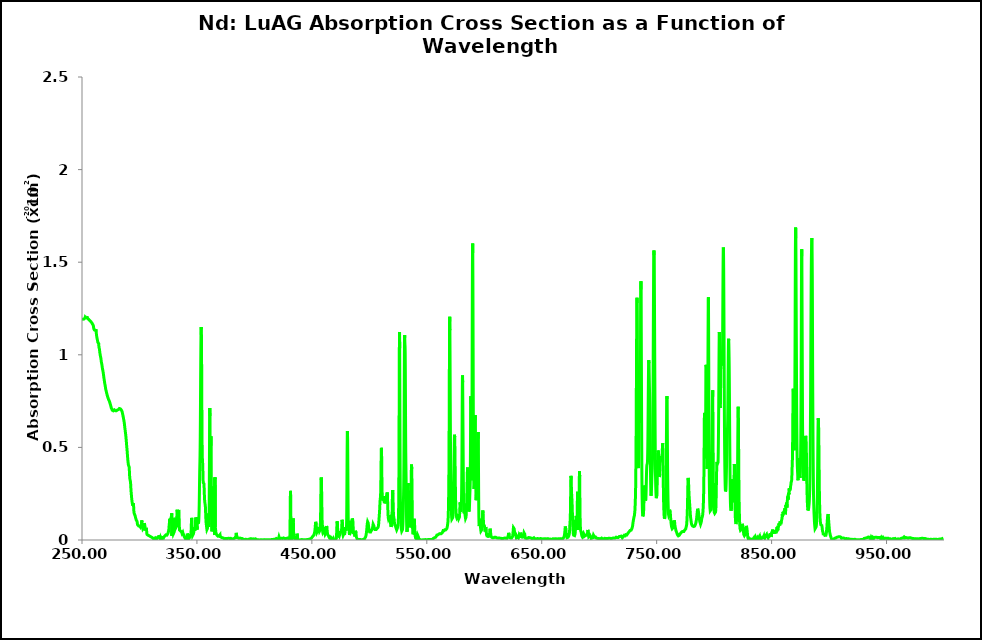
| Category | 175 K |
|---|---|
| 250.0 | 1.189 |
| 250.1 | 1.189 |
| 250.2 | 1.189 |
| 250.3 | 1.189 |
| 250.4 | 1.19 |
| 250.5 | 1.19 |
| 250.6 | 1.191 |
| 250.7 | 1.191 |
| 250.8 | 1.191 |
| 250.9 | 1.192 |
| 251.0 | 1.193 |
| 251.1 | 1.194 |
| 251.2 | 1.193 |
| 251.3 | 1.193 |
| 251.4 | 1.193 |
| 251.5 | 1.193 |
| 251.6 | 1.193 |
| 251.7 | 1.193 |
| 251.8 | 1.193 |
| 251.9 | 1.194 |
| 252.0 | 1.194 |
| 252.1 | 1.195 |
| 252.2 | 1.195 |
| 252.3 | 1.196 |
| 252.4 | 1.196 |
| 252.5 | 1.196 |
| 252.6 | 1.197 |
| 252.7 | 1.199 |
| 252.8 | 1.202 |
| 252.9 | 1.205 |
| 253.0 | 1.208 |
| 253.1 | 1.209 |
| 253.2 | 1.209 |
| 253.3 | 1.207 |
| 253.4 | 1.205 |
| 253.5 | 1.202 |
| 253.6 | 1.2 |
| 253.7 | 1.2 |
| 253.8 | 1.2 |
| 253.9 | 1.2 |
| 254.0 | 1.2 |
| 254.1 | 1.201 |
| 254.2 | 1.201 |
| 254.3 | 1.202 |
| 254.4 | 1.203 |
| 254.5 | 1.204 |
| 254.6 | 1.203 |
| 254.7 | 1.201 |
| 254.8 | 1.198 |
| 254.9 | 1.196 |
| 255.0 | 1.195 |
| 255.1 | 1.196 |
| 255.2 | 1.196 |
| 255.3 | 1.195 |
| 255.4 | 1.194 |
| 255.5 | 1.193 |
| 255.6 | 1.193 |
| 255.7 | 1.192 |
| 255.8 | 1.192 |
| 255.9 | 1.191 |
| 256.0 | 1.191 |
| 256.1 | 1.19 |
| 256.2 | 1.19 |
| 256.3 | 1.189 |
| 256.4 | 1.188 |
| 256.5 | 1.187 |
| 256.6 | 1.186 |
| 256.7 | 1.186 |
| 256.8 | 1.185 |
| 256.9 | 1.184 |
| 257.0 | 1.182 |
| 257.1 | 1.182 |
| 257.2 | 1.182 |
| 257.3 | 1.182 |
| 257.4 | 1.182 |
| 257.5 | 1.181 |
| 257.6 | 1.179 |
| 257.7 | 1.178 |
| 257.8 | 1.178 |
| 257.9 | 1.177 |
| 258.0 | 1.177 |
| 258.1 | 1.176 |
| 258.2 | 1.176 |
| 258.3 | 1.175 |
| 258.4 | 1.175 |
| 258.5 | 1.173 |
| 258.6 | 1.172 |
| 258.7 | 1.171 |
| 258.8 | 1.17 |
| 258.9 | 1.168 |
| 259.0 | 1.168 |
| 259.1 | 1.166 |
| 259.2 | 1.165 |
| 259.3 | 1.164 |
| 259.4 | 1.163 |
| 259.5 | 1.162 |
| 259.6 | 1.161 |
| 259.7 | 1.161 |
| 259.8 | 1.159 |
| 259.9 | 1.158 |
| 260.0 | 1.153 |
| 260.1 | 1.147 |
| 260.2 | 1.142 |
| 260.3 | 1.14 |
| 260.4 | 1.139 |
| 260.5 | 1.139 |
| 260.6 | 1.138 |
| 260.7 | 1.136 |
| 260.8 | 1.134 |
| 260.9 | 1.133 |
| 261.0 | 1.131 |
| 261.1 | 1.131 |
| 261.2 | 1.13 |
| 261.3 | 1.13 |
| 261.4 | 1.129 |
| 261.5 | 1.129 |
| 261.6 | 1.13 |
| 261.7 | 1.133 |
| 261.8 | 1.135 |
| 261.9 | 1.137 |
| 262.0 | 1.138 |
| 262.1 | 1.137 |
| 262.2 | 1.134 |
| 262.3 | 1.128 |
| 262.4 | 1.121 |
| 262.5 | 1.114 |
| 262.6 | 1.108 |
| 262.7 | 1.104 |
| 262.8 | 1.1 |
| 262.9 | 1.096 |
| 263.0 | 1.092 |
| 263.1 | 1.089 |
| 263.2 | 1.086 |
| 263.3 | 1.084 |
| 263.4 | 1.08 |
| 263.5 | 1.077 |
| 263.6 | 1.073 |
| 263.7 | 1.07 |
| 263.8 | 1.067 |
| 263.9 | 1.066 |
| 264.0 | 1.068 |
| 264.1 | 1.071 |
| 264.2 | 1.072 |
| 264.3 | 1.071 |
| 264.4 | 1.066 |
| 264.5 | 1.061 |
| 264.6 | 1.053 |
| 264.7 | 1.046 |
| 264.8 | 1.04 |
| 264.9 | 1.037 |
| 265.0 | 1.035 |
| 265.1 | 1.033 |
| 265.2 | 1.03 |
| 265.3 | 1.025 |
| 265.4 | 1.018 |
| 265.5 | 1.012 |
| 265.6 | 1.009 |
| 265.7 | 1.004 |
| 265.8 | 1.001 |
| 265.9 | 0.997 |
| 266.0 | 0.995 |
| 266.1 | 0.992 |
| 266.2 | 0.988 |
| 266.3 | 0.984 |
| 266.4 | 0.981 |
| 266.5 | 0.978 |
| 266.6 | 0.973 |
| 266.7 | 0.968 |
| 266.8 | 0.963 |
| 266.9 | 0.959 |
| 267.0 | 0.957 |
| 267.1 | 0.954 |
| 267.2 | 0.951 |
| 267.3 | 0.946 |
| 267.4 | 0.942 |
| 267.5 | 0.937 |
| 267.6 | 0.934 |
| 267.7 | 0.929 |
| 267.8 | 0.926 |
| 267.9 | 0.922 |
| 268.0 | 0.92 |
| 268.1 | 0.917 |
| 268.2 | 0.914 |
| 268.3 | 0.91 |
| 268.4 | 0.906 |
| 268.5 | 0.902 |
| 268.6 | 0.898 |
| 268.7 | 0.893 |
| 268.8 | 0.888 |
| 268.9 | 0.883 |
| 269.0 | 0.879 |
| 269.1 | 0.875 |
| 269.2 | 0.87 |
| 269.3 | 0.866 |
| 269.4 | 0.861 |
| 269.5 | 0.857 |
| 269.6 | 0.854 |
| 269.7 | 0.85 |
| 269.8 | 0.846 |
| 269.9 | 0.842 |
| 270.0 | 0.839 |
| 270.1 | 0.835 |
| 270.2 | 0.832 |
| 270.3 | 0.828 |
| 270.4 | 0.825 |
| 270.5 | 0.82 |
| 270.6 | 0.816 |
| 270.7 | 0.813 |
| 270.8 | 0.809 |
| 270.9 | 0.808 |
| 271.0 | 0.806 |
| 271.1 | 0.803 |
| 271.2 | 0.799 |
| 271.3 | 0.797 |
| 271.4 | 0.794 |
| 271.5 | 0.793 |
| 271.6 | 0.79 |
| 271.7 | 0.787 |
| 271.8 | 0.784 |
| 271.9 | 0.783 |
| 272.0 | 0.781 |
| 272.1 | 0.778 |
| 272.2 | 0.776 |
| 272.3 | 0.774 |
| 272.4 | 0.771 |
| 272.5 | 0.769 |
| 272.6 | 0.767 |
| 272.7 | 0.766 |
| 272.8 | 0.765 |
| 272.9 | 0.763 |
| 273.0 | 0.761 |
| 273.1 | 0.758 |
| 273.2 | 0.758 |
| 273.3 | 0.756 |
| 273.4 | 0.757 |
| 273.5 | 0.754 |
| 273.6 | 0.753 |
| 273.7 | 0.751 |
| 273.8 | 0.75 |
| 273.9 | 0.749 |
| 274.0 | 0.746 |
| 274.1 | 0.745 |
| 274.2 | 0.742 |
| 274.3 | 0.74 |
| 274.4 | 0.737 |
| 274.5 | 0.735 |
| 274.6 | 0.733 |
| 274.7 | 0.731 |
| 274.8 | 0.728 |
| 274.9 | 0.727 |
| 275.0 | 0.726 |
| 275.1 | 0.724 |
| 275.2 | 0.72 |
| 275.3 | 0.717 |
| 275.4 | 0.714 |
| 275.5 | 0.711 |
| 275.6 | 0.709 |
| 275.7 | 0.709 |
| 275.8 | 0.71 |
| 275.9 | 0.709 |
| 276.0 | 0.707 |
| 276.1 | 0.704 |
| 276.2 | 0.703 |
| 276.3 | 0.701 |
| 276.4 | 0.699 |
| 276.5 | 0.698 |
| 276.6 | 0.698 |
| 276.7 | 0.698 |
| 276.8 | 0.699 |
| 276.9 | 0.698 |
| 277.0 | 0.698 |
| 277.1 | 0.697 |
| 277.2 | 0.698 |
| 277.3 | 0.698 |
| 277.4 | 0.698 |
| 277.5 | 0.697 |
| 277.6 | 0.696 |
| 277.7 | 0.697 |
| 277.8 | 0.698 |
| 277.9 | 0.699 |
| 278.0 | 0.701 |
| 278.1 | 0.703 |
| 278.2 | 0.703 |
| 278.3 | 0.702 |
| 278.4 | 0.7 |
| 278.5 | 0.7 |
| 278.6 | 0.701 |
| 278.7 | 0.701 |
| 278.8 | 0.7 |
| 278.9 | 0.698 |
| 279.0 | 0.698 |
| 279.1 | 0.698 |
| 279.2 | 0.697 |
| 279.3 | 0.696 |
| 279.4 | 0.697 |
| 279.5 | 0.698 |
| 279.6 | 0.698 |
| 279.7 | 0.698 |
| 279.8 | 0.698 |
| 279.9 | 0.698 |
| 280.0 | 0.7 |
| 280.1 | 0.7 |
| 280.2 | 0.7 |
| 280.3 | 0.7 |
| 280.4 | 0.7 |
| 280.5 | 0.701 |
| 280.6 | 0.701 |
| 280.7 | 0.701 |
| 280.8 | 0.702 |
| 280.9 | 0.702 |
| 281.0 | 0.702 |
| 281.1 | 0.703 |
| 281.2 | 0.704 |
| 281.3 | 0.706 |
| 281.4 | 0.706 |
| 281.5 | 0.705 |
| 281.6 | 0.704 |
| 281.7 | 0.704 |
| 281.8 | 0.704 |
| 281.9 | 0.705 |
| 282.0 | 0.706 |
| 282.1 | 0.707 |
| 282.2 | 0.708 |
| 282.3 | 0.708 |
| 282.4 | 0.709 |
| 282.5 | 0.71 |
| 282.6 | 0.711 |
| 282.7 | 0.711 |
| 282.8 | 0.71 |
| 282.9 | 0.708 |
| 283.0 | 0.708 |
| 283.1 | 0.708 |
| 283.2 | 0.71 |
| 283.3 | 0.709 |
| 283.4 | 0.708 |
| 283.5 | 0.707 |
| 283.6 | 0.706 |
| 283.7 | 0.705 |
| 283.8 | 0.704 |
| 283.9 | 0.704 |
| 284.0 | 0.703 |
| 284.1 | 0.703 |
| 284.2 | 0.701 |
| 284.3 | 0.699 |
| 284.4 | 0.698 |
| 284.5 | 0.699 |
| 284.6 | 0.698 |
| 284.7 | 0.696 |
| 284.8 | 0.695 |
| 284.9 | 0.693 |
| 285.0 | 0.691 |
| 285.1 | 0.687 |
| 285.2 | 0.683 |
| 285.3 | 0.682 |
| 285.4 | 0.68 |
| 285.5 | 0.677 |
| 285.6 | 0.673 |
| 285.7 | 0.669 |
| 285.8 | 0.667 |
| 285.9 | 0.665 |
| 286.0 | 0.661 |
| 286.1 | 0.657 |
| 286.2 | 0.653 |
| 286.3 | 0.65 |
| 286.4 | 0.648 |
| 286.5 | 0.644 |
| 286.6 | 0.639 |
| 286.7 | 0.635 |
| 286.8 | 0.632 |
| 286.9 | 0.629 |
| 287.0 | 0.621 |
| 287.1 | 0.616 |
| 287.2 | 0.61 |
| 287.3 | 0.606 |
| 287.4 | 0.6 |
| 287.5 | 0.596 |
| 287.6 | 0.59 |
| 287.7 | 0.585 |
| 287.8 | 0.58 |
| 287.9 | 0.575 |
| 288.0 | 0.57 |
| 288.1 | 0.564 |
| 288.2 | 0.558 |
| 288.3 | 0.55 |
| 288.4 | 0.544 |
| 288.5 | 0.537 |
| 288.6 | 0.531 |
| 288.7 | 0.522 |
| 288.8 | 0.514 |
| 288.9 | 0.506 |
| 289.0 | 0.5 |
| 289.1 | 0.493 |
| 289.2 | 0.487 |
| 289.3 | 0.478 |
| 289.4 | 0.471 |
| 289.5 | 0.462 |
| 289.6 | 0.453 |
| 289.7 | 0.445 |
| 289.8 | 0.438 |
| 289.9 | 0.431 |
| 290.0 | 0.425 |
| 290.1 | 0.42 |
| 290.2 | 0.414 |
| 290.3 | 0.41 |
| 290.4 | 0.405 |
| 290.5 | 0.405 |
| 290.6 | 0.405 |
| 290.7 | 0.407 |
| 290.8 | 0.411 |
| 290.9 | 0.411 |
| 291.0 | 0.405 |
| 291.1 | 0.392 |
| 291.2 | 0.378 |
| 291.3 | 0.363 |
| 291.4 | 0.351 |
| 291.5 | 0.34 |
| 291.6 | 0.333 |
| 291.7 | 0.328 |
| 291.8 | 0.325 |
| 291.9 | 0.322 |
| 292.0 | 0.319 |
| 292.1 | 0.317 |
| 292.2 | 0.312 |
| 292.3 | 0.305 |
| 292.4 | 0.293 |
| 292.5 | 0.282 |
| 292.6 | 0.271 |
| 292.7 | 0.263 |
| 292.8 | 0.255 |
| 292.9 | 0.25 |
| 293.0 | 0.241 |
| 293.1 | 0.234 |
| 293.2 | 0.227 |
| 293.3 | 0.222 |
| 293.4 | 0.215 |
| 293.5 | 0.209 |
| 293.6 | 0.205 |
| 293.7 | 0.201 |
| 293.8 | 0.198 |
| 293.9 | 0.194 |
| 294.0 | 0.193 |
| 294.1 | 0.19 |
| 294.2 | 0.185 |
| 294.3 | 0.183 |
| 294.4 | 0.184 |
| 294.5 | 0.191 |
| 294.6 | 0.196 |
| 294.7 | 0.198 |
| 294.8 | 0.193 |
| 294.9 | 0.183 |
| 295.0 | 0.169 |
| 295.1 | 0.159 |
| 295.2 | 0.15 |
| 295.3 | 0.148 |
| 295.4 | 0.144 |
| 295.5 | 0.145 |
| 295.6 | 0.141 |
| 295.7 | 0.14 |
| 295.8 | 0.137 |
| 295.9 | 0.137 |
| 296.0 | 0.136 |
| 296.1 | 0.134 |
| 296.2 | 0.133 |
| 296.3 | 0.13 |
| 296.4 | 0.126 |
| 296.5 | 0.123 |
| 296.6 | 0.122 |
| 296.7 | 0.12 |
| 296.8 | 0.118 |
| 296.9 | 0.114 |
| 297.0 | 0.112 |
| 297.1 | 0.111 |
| 297.2 | 0.108 |
| 297.3 | 0.107 |
| 297.4 | 0.105 |
| 297.5 | 0.106 |
| 297.6 | 0.106 |
| 297.7 | 0.105 |
| 297.8 | 0.103 |
| 297.9 | 0.101 |
| 298.0 | 0.096 |
| 298.1 | 0.091 |
| 298.2 | 0.086 |
| 298.3 | 0.083 |
| 298.4 | 0.083 |
| 298.5 | 0.081 |
| 298.6 | 0.081 |
| 298.7 | 0.08 |
| 298.8 | 0.08 |
| 298.9 | 0.079 |
| 299.0 | 0.078 |
| 299.1 | 0.078 |
| 299.2 | 0.076 |
| 299.3 | 0.074 |
| 299.4 | 0.072 |
| 299.5 | 0.071 |
| 299.6 | 0.072 |
| 299.7 | 0.073 |
| 299.8 | 0.073 |
| 299.9 | 0.073 |
| 300.0 | 0.074 |
| 300.1 | 0.075 |
| 300.2 | 0.076 |
| 300.3 | 0.077 |
| 300.4 | 0.076 |
| 300.5 | 0.073 |
| 300.6 | 0.071 |
| 300.7 | 0.07 |
| 300.8 | 0.07 |
| 300.9 | 0.068 |
| 301.0 | 0.067 |
| 301.1 | 0.068 |
| 301.2 | 0.071 |
| 301.3 | 0.074 |
| 301.4 | 0.074 |
| 301.5 | 0.076 |
| 301.6 | 0.081 |
| 301.7 | 0.087 |
| 301.8 | 0.095 |
| 301.9 | 0.1 |
| 302.0 | 0.106 |
| 302.1 | 0.103 |
| 302.2 | 0.096 |
| 302.3 | 0.086 |
| 302.4 | 0.08 |
| 302.5 | 0.076 |
| 302.6 | 0.073 |
| 302.7 | 0.069 |
| 302.8 | 0.065 |
| 302.9 | 0.062 |
| 303.0 | 0.059 |
| 303.1 | 0.059 |
| 303.2 | 0.059 |
| 303.3 | 0.062 |
| 303.4 | 0.061 |
| 303.5 | 0.061 |
| 303.6 | 0.061 |
| 303.7 | 0.061 |
| 303.8 | 0.065 |
| 303.9 | 0.07 |
| 304.0 | 0.078 |
| 304.1 | 0.085 |
| 304.2 | 0.09 |
| 304.3 | 0.091 |
| 304.4 | 0.09 |
| 304.5 | 0.085 |
| 304.6 | 0.081 |
| 304.7 | 0.077 |
| 304.8 | 0.073 |
| 304.9 | 0.067 |
| 305.0 | 0.06 |
| 305.1 | 0.056 |
| 305.2 | 0.051 |
| 305.3 | 0.048 |
| 305.4 | 0.047 |
| 305.5 | 0.051 |
| 305.6 | 0.055 |
| 305.7 | 0.06 |
| 305.8 | 0.063 |
| 305.9 | 0.066 |
| 306.0 | 0.063 |
| 306.1 | 0.059 |
| 306.2 | 0.051 |
| 306.3 | 0.043 |
| 306.4 | 0.036 |
| 306.5 | 0.032 |
| 306.6 | 0.03 |
| 306.7 | 0.03 |
| 306.8 | 0.029 |
| 306.9 | 0.028 |
| 307.0 | 0.027 |
| 307.1 | 0.028 |
| 307.2 | 0.03 |
| 307.3 | 0.03 |
| 307.4 | 0.029 |
| 307.5 | 0.026 |
| 307.6 | 0.021 |
| 307.7 | 0.022 |
| 307.8 | 0.023 |
| 307.9 | 0.025 |
| 308.0 | 0.023 |
| 308.1 | 0.022 |
| 308.2 | 0.023 |
| 308.3 | 0.023 |
| 308.4 | 0.023 |
| 308.5 | 0.024 |
| 308.6 | 0.023 |
| 308.7 | 0.021 |
| 308.8 | 0.022 |
| 308.9 | 0.022 |
| 309.0 | 0.023 |
| 309.1 | 0.021 |
| 309.2 | 0.021 |
| 309.3 | 0.02 |
| 309.4 | 0.017 |
| 309.5 | 0.018 |
| 309.6 | 0.02 |
| 309.7 | 0.019 |
| 309.8 | 0.019 |
| 309.9 | 0.018 |
| 310.0 | 0.02 |
| 310.1 | 0.019 |
| 310.2 | 0.016 |
| 310.3 | 0.014 |
| 310.4 | 0.012 |
| 310.5 | 0.015 |
| 310.6 | 0.017 |
| 310.7 | 0.018 |
| 310.8 | 0.016 |
| 310.9 | 0.014 |
| 311.0 | 0.013 |
| 311.1 | 0.013 |
| 311.2 | 0.012 |
| 311.3 | 0.015 |
| 311.4 | 0.015 |
| 311.5 | 0.018 |
| 311.6 | 0.013 |
| 311.7 | 0.012 |
| 311.8 | 0.009 |
| 311.9 | 0.009 |
| 312.0 | 0.008 |
| 312.1 | 0.008 |
| 312.2 | 0.009 |
| 312.3 | 0.007 |
| 312.4 | 0.007 |
| 312.5 | 0.007 |
| 312.6 | 0.007 |
| 312.7 | 0.007 |
| 312.8 | 0.008 |
| 312.9 | 0.01 |
| 313.0 | 0.009 |
| 313.1 | 0.01 |
| 313.2 | 0.009 |
| 313.3 | 0.01 |
| 313.4 | 0.009 |
| 313.5 | 0.009 |
| 313.6 | 0.007 |
| 313.7 | 0.005 |
| 313.8 | 0.006 |
| 313.9 | 0.008 |
| 314.0 | 0.008 |
| 314.1 | 0.007 |
| 314.2 | 0.007 |
| 314.3 | 0.011 |
| 314.4 | 0.01 |
| 314.5 | 0.009 |
| 314.6 | 0.007 |
| 314.7 | 0.009 |
| 314.8 | 0.01 |
| 314.9 | 0.009 |
| 315.0 | 0.008 |
| 315.1 | 0.007 |
| 315.2 | 0.008 |
| 315.3 | 0.009 |
| 315.4 | 0.01 |
| 315.5 | 0.011 |
| 315.6 | 0.01 |
| 315.7 | 0.011 |
| 315.8 | 0.014 |
| 315.9 | 0.017 |
| 316.0 | 0.016 |
| 316.1 | 0.014 |
| 316.2 | 0.012 |
| 316.3 | 0.013 |
| 316.4 | 0.009 |
| 316.5 | 0.01 |
| 316.6 | 0.012 |
| 316.7 | 0.015 |
| 316.8 | 0.017 |
| 316.9 | 0.02 |
| 317.0 | 0.026 |
| 317.1 | 0.026 |
| 317.2 | 0.024 |
| 317.3 | 0.02 |
| 317.4 | 0.017 |
| 317.5 | 0.013 |
| 317.6 | 0.013 |
| 317.7 | 0.014 |
| 317.8 | 0.013 |
| 317.9 | 0.01 |
| 318.0 | 0.006 |
| 318.1 | 0.009 |
| 318.2 | 0.012 |
| 318.3 | 0.013 |
| 318.4 | 0.012 |
| 318.5 | 0.009 |
| 318.6 | 0.009 |
| 318.7 | 0.005 |
| 318.8 | 0.003 |
| 318.9 | 0.001 |
| 319.0 | 0.001 |
| 319.1 | 0.003 |
| 319.2 | 0.006 |
| 319.3 | 0.008 |
| 319.4 | 0.008 |
| 319.5 | 0.007 |
| 319.6 | 0.006 |
| 319.7 | 0.006 |
| 319.8 | 0.007 |
| 319.9 | 0.01 |
| 320.0 | 0.013 |
| 320.1 | 0.014 |
| 320.2 | 0.013 |
| 320.3 | 0.012 |
| 320.4 | 0.012 |
| 320.5 | 0.009 |
| 320.6 | 0.01 |
| 320.7 | 0.01 |
| 320.8 | 0.013 |
| 320.9 | 0.01 |
| 321.0 | 0.01 |
| 321.1 | 0.012 |
| 321.2 | 0.013 |
| 321.3 | 0.016 |
| 321.4 | 0.016 |
| 321.5 | 0.016 |
| 321.6 | 0.017 |
| 321.7 | 0.018 |
| 321.8 | 0.019 |
| 321.9 | 0.018 |
| 322.0 | 0.02 |
| 322.1 | 0.022 |
| 322.2 | 0.023 |
| 322.3 | 0.023 |
| 322.4 | 0.022 |
| 322.5 | 0.023 |
| 322.6 | 0.024 |
| 322.7 | 0.026 |
| 322.8 | 0.027 |
| 322.9 | 0.028 |
| 323.0 | 0.027 |
| 323.1 | 0.025 |
| 323.2 | 0.026 |
| 323.3 | 0.025 |
| 323.4 | 0.027 |
| 323.5 | 0.026 |
| 323.6 | 0.026 |
| 323.7 | 0.027 |
| 323.8 | 0.026 |
| 323.9 | 0.027 |
| 324.0 | 0.029 |
| 324.1 | 0.031 |
| 324.2 | 0.031 |
| 324.3 | 0.031 |
| 324.4 | 0.032 |
| 324.5 | 0.031 |
| 324.6 | 0.031 |
| 324.7 | 0.034 |
| 324.8 | 0.035 |
| 324.9 | 0.038 |
| 325.0 | 0.038 |
| 325.1 | 0.043 |
| 325.2 | 0.046 |
| 325.3 | 0.049 |
| 325.4 | 0.052 |
| 325.5 | 0.054 |
| 325.6 | 0.059 |
| 325.7 | 0.067 |
| 325.8 | 0.076 |
| 325.9 | 0.082 |
| 326.0 | 0.088 |
| 326.1 | 0.095 |
| 326.2 | 0.106 |
| 326.3 | 0.115 |
| 326.4 | 0.118 |
| 326.5 | 0.117 |
| 326.6 | 0.113 |
| 326.7 | 0.113 |
| 326.8 | 0.108 |
| 326.9 | 0.107 |
| 327.0 | 0.106 |
| 327.1 | 0.11 |
| 327.2 | 0.113 |
| 327.3 | 0.116 |
| 327.4 | 0.116 |
| 327.5 | 0.119 |
| 327.6 | 0.121 |
| 327.7 | 0.126 |
| 327.8 | 0.128 |
| 327.9 | 0.133 |
| 328.0 | 0.139 |
| 328.1 | 0.144 |
| 328.2 | 0.023 |
| 328.3 | 0.03 |
| 328.4 | 0.035 |
| 328.5 | 0.038 |
| 328.6 | 0.042 |
| 328.7 | 0.048 |
| 328.8 | 0.051 |
| 328.9 | 0.051 |
| 329.0 | 0.046 |
| 329.1 | 0.044 |
| 329.2 | 0.04 |
| 329.3 | 0.036 |
| 329.4 | 0.032 |
| 329.5 | 0.03 |
| 329.6 | 0.03 |
| 329.7 | 0.028 |
| 329.8 | 0.029 |
| 329.9 | 0.032 |
| 330.0 | 0.04 |
| 330.1 | 0.05 |
| 330.2 | 0.067 |
| 330.3 | 0.084 |
| 330.4 | 0.1 |
| 330.5 | 0.11 |
| 330.6 | 0.116 |
| 330.7 | 0.12 |
| 330.8 | 0.116 |
| 330.9 | 0.11 |
| 331.0 | 0.098 |
| 331.1 | 0.088 |
| 331.2 | 0.079 |
| 331.3 | 0.073 |
| 331.4 | 0.069 |
| 331.5 | 0.065 |
| 331.6 | 0.061 |
| 331.7 | 0.061 |
| 331.8 | 0.062 |
| 331.9 | 0.064 |
| 332.0 | 0.065 |
| 332.1 | 0.067 |
| 332.2 | 0.073 |
| 332.3 | 0.083 |
| 332.4 | 0.097 |
| 332.5 | 0.118 |
| 332.6 | 0.14 |
| 332.7 | 0.158 |
| 332.8 | 0.163 |
| 332.9 | 0.162 |
| 333.0 | 0.153 |
| 333.1 | 0.142 |
| 333.2 | 0.13 |
| 333.3 | 0.123 |
| 333.4 | 0.119 |
| 333.5 | 0.118 |
| 333.6 | 0.12 |
| 333.7 | 0.127 |
| 333.8 | 0.135 |
| 333.9 | 0.145 |
| 334.0 | 0.154 |
| 334.1 | 0.162 |
| 334.2 | 0.162 |
| 334.3 | 0.154 |
| 334.4 | 0.139 |
| 334.5 | 0.118 |
| 334.6 | 0.094 |
| 334.7 | 0.074 |
| 334.8 | 0.06 |
| 334.9 | 0.053 |
| 335.0 | 0.051 |
| 335.1 | 0.053 |
| 335.2 | 0.053 |
| 335.3 | 0.053 |
| 335.4 | 0.052 |
| 335.5 | 0.053 |
| 335.6 | 0.052 |
| 335.7 | 0.05 |
| 335.8 | 0.047 |
| 335.9 | 0.045 |
| 336.0 | 0.045 |
| 336.1 | 0.045 |
| 336.2 | 0.047 |
| 336.3 | 0.05 |
| 336.4 | 0.05 |
| 336.5 | 0.048 |
| 336.6 | 0.046 |
| 336.7 | 0.043 |
| 336.8 | 0.041 |
| 336.9 | 0.038 |
| 337.0 | 0.037 |
| 337.1 | 0.033 |
| 337.2 | 0.034 |
| 337.3 | 0.036 |
| 337.4 | 0.04 |
| 337.5 | 0.042 |
| 337.6 | 0.042 |
| 337.7 | 0.04 |
| 337.8 | 0.038 |
| 337.9 | 0.035 |
| 338.0 | 0.033 |
| 338.1 | 0.03 |
| 338.2 | 0.03 |
| 338.3 | 0.03 |
| 338.4 | 0.029 |
| 338.5 | 0.028 |
| 338.6 | 0.026 |
| 338.7 | 0.022 |
| 338.8 | 0.019 |
| 338.9 | 0.019 |
| 339.0 | 0.018 |
| 339.1 | 0.016 |
| 339.2 | 0.014 |
| 339.3 | 0.015 |
| 339.4 | 0.015 |
| 339.5 | 0.015 |
| 339.6 | 0.013 |
| 339.7 | 0.013 |
| 339.8 | 0.01 |
| 339.9 | 0.008 |
| 340.0 | 0.005 |
| 340.1 | 0.005 |
| 340.2 | 0.004 |
| 340.3 | 0.006 |
| 340.4 | 0.002 |
| 340.5 | 0.004 |
| 340.6 | 0.006 |
| 340.7 | 0.002 |
| 340.8 | 0.001 |
| 340.9 | 0.002 |
| 341.0 | 0.003 |
| 341.1 | 0.004 |
| 341.2 | 0.006 |
| 341.3 | 0.012 |
| 341.4 | 0.02 |
| 341.5 | 0.026 |
| 341.6 | 0.03 |
| 341.7 | 0.035 |
| 341.8 | 0.038 |
| 341.9 | 0.037 |
| 342.0 | 0.035 |
| 342.1 | 0.029 |
| 342.2 | 0.026 |
| 342.3 | 0.02 |
| 342.4 | 0.02 |
| 342.5 | 0.017 |
| 342.6 | 0.014 |
| 342.7 | 0.01 |
| 342.8 | 0.009 |
| 342.9 | 0.01 |
| 343.0 | 0.008 |
| 343.1 | 0.008 |
| 343.2 | 0.006 |
| 343.3 | 0.008 |
| 343.4 | 0.007 |
| 343.5 | 0.011 |
| 343.6 | 0.01 |
| 343.7 | 0.014 |
| 343.8 | 0.014 |
| 343.9 | 0.017 |
| 344.0 | 0.015 |
| 344.1 | 0.019 |
| 344.2 | 0.02 |
| 344.3 | 0.022 |
| 344.4 | 0.023 |
| 344.5 | 0.026 |
| 344.6 | 0.027 |
| 344.7 | 0.029 |
| 344.8 | 0.034 |
| 344.9 | 0.044 |
| 345.0 | 0.059 |
| 345.1 | 0.076 |
| 345.2 | 0.095 |
| 345.3 | 0.11 |
| 345.4 | 0.119 |
| 345.5 | 0.117 |
| 345.6 | 0.106 |
| 345.7 | 0.091 |
| 345.8 | 0.072 |
| 345.9 | 0.056 |
| 346.0 | 0.039 |
| 346.1 | 0.03 |
| 346.2 | 0.024 |
| 346.3 | 0.023 |
| 346.4 | 0.022 |
| 346.5 | 0.02 |
| 346.6 | 0.021 |
| 346.7 | 0.022 |
| 346.8 | 0.023 |
| 346.9 | 0.024 |
| 347.0 | 0.029 |
| 347.1 | 0.035 |
| 347.2 | 0.043 |
| 347.3 | 0.052 |
| 347.4 | 0.062 |
| 347.5 | 0.069 |
| 347.6 | 0.073 |
| 347.7 | 0.071 |
| 347.8 | 0.066 |
| 347.9 | 0.057 |
| 348.0 | 0.05 |
| 348.1 | 0.046 |
| 348.2 | 0.047 |
| 348.3 | 0.049 |
| 348.4 | 0.052 |
| 348.5 | 0.059 |
| 348.6 | 0.071 |
| 348.7 | 0.087 |
| 348.8 | 0.101 |
| 348.9 | 0.113 |
| 349.0 | 0.118 |
| 349.1 | 0.121 |
| 349.2 | 0.118 |
| 349.3 | 0.11 |
| 349.4 | 0.095 |
| 349.5 | 0.083 |
| 349.6 | 0.072 |
| 349.7 | 0.068 |
| 349.8 | 0.065 |
| 349.9 | 0.068 |
| 350.0 | 0.073 |
| 350.1 | 0.057 |
| 350.2 | 0.064 |
| 350.3 | 0.073 |
| 350.4 | 0.088 |
| 350.5 | 0.103 |
| 350.6 | 0.118 |
| 350.7 | 0.124 |
| 350.8 | 0.123 |
| 350.9 | 0.116 |
| 351.0 | 0.107 |
| 351.1 | 0.097 |
| 351.2 | 0.09 |
| 351.3 | 0.087 |
| 351.4 | 0.089 |
| 351.5 | 0.095 |
| 351.6 | 0.106 |
| 351.7 | 0.121 |
| 351.8 | 0.138 |
| 351.9 | 0.161 |
| 352.0 | 0.191 |
| 352.1 | 0.231 |
| 352.2 | 0.277 |
| 352.3 | 0.324 |
| 352.4 | 0.365 |
| 352.5 | 0.396 |
| 352.6 | 0.424 |
| 352.7 | 0.454 |
| 352.8 | 0.502 |
| 352.9 | 0.562 |
| 353.0 | 0.646 |
| 353.1 | 0.745 |
| 353.2 | 0.849 |
| 353.3 | 0.945 |
| 353.4 | 1.026 |
| 353.5 | 1.091 |
| 353.6 | 1.134 |
| 353.7 | 1.15 |
| 353.8 | 1.137 |
| 353.9 | 1.096 |
| 354.0 | 1.028 |
| 354.1 | 0.933 |
| 354.2 | 0.821 |
| 354.3 | 0.702 |
| 354.4 | 0.601 |
| 354.5 | 0.523 |
| 354.6 | 0.474 |
| 354.7 | 0.446 |
| 354.8 | 0.431 |
| 354.9 | 0.422 |
| 355.0 | 0.41 |
| 355.1 | 0.392 |
| 355.2 | 0.365 |
| 355.3 | 0.338 |
| 355.4 | 0.319 |
| 355.5 | 0.309 |
| 355.6 | 0.307 |
| 355.7 | 0.308 |
| 355.8 | 0.308 |
| 355.9 | 0.31 |
| 356.0 | 0.309 |
| 356.1 | 0.304 |
| 356.2 | 0.292 |
| 356.3 | 0.276 |
| 356.4 | 0.257 |
| 356.5 | 0.24 |
| 356.6 | 0.225 |
| 356.7 | 0.215 |
| 356.8 | 0.206 |
| 356.9 | 0.201 |
| 357.0 | 0.198 |
| 357.1 | 0.197 |
| 357.2 | 0.193 |
| 357.3 | 0.186 |
| 357.4 | 0.174 |
| 357.5 | 0.159 |
| 357.6 | 0.141 |
| 357.7 | 0.126 |
| 357.8 | 0.112 |
| 357.9 | 0.103 |
| 358.0 | 0.093 |
| 358.1 | 0.088 |
| 358.2 | 0.083 |
| 358.3 | 0.078 |
| 358.4 | 0.072 |
| 358.5 | 0.065 |
| 358.6 | 0.061 |
| 358.7 | 0.056 |
| 358.8 | 0.052 |
| 358.9 | 0.051 |
| 359.0 | 0.055 |
| 359.1 | 0.062 |
| 359.2 | 0.076 |
| 359.3 | 0.093 |
| 359.4 | 0.113 |
| 359.5 | 0.132 |
| 359.6 | 0.143 |
| 359.7 | 0.143 |
| 359.8 | 0.127 |
| 359.9 | 0.106 |
| 360.0 | 0.089 |
| 360.1 | 0.076 |
| 360.2 | 0.07 |
| 360.3 | 0.067 |
| 360.4 | 0.075 |
| 360.5 | 0.094 |
| 360.6 | 0.137 |
| 360.7 | 0.209 |
| 360.8 | 0.313 |
| 360.9 | 0.44 |
| 361.0 | 0.572 |
| 361.1 | 0.675 |
| 361.2 | 0.713 |
| 361.3 | 0.669 |
| 361.4 | 0.559 |
| 361.5 | 0.42 |
| 361.6 | 0.301 |
| 361.7 | 0.246 |
| 361.8 | 0.265 |
| 361.9 | 0.345 |
| 362.0 | 0.45 |
| 362.1 | 0.537 |
| 362.2 | 0.56 |
| 362.3 | 0.509 |
| 362.4 | 0.402 |
| 362.5 | 0.285 |
| 362.6 | 0.184 |
| 362.7 | 0.122 |
| 362.8 | 0.083 |
| 362.9 | 0.059 |
| 363.0 | 0.046 |
| 363.1 | 0.052 |
| 363.2 | 0.082 |
| 363.3 | 0.132 |
| 363.4 | 0.196 |
| 363.5 | 0.255 |
| 363.6 | 0.289 |
| 363.7 | 0.287 |
| 363.8 | 0.251 |
| 363.9 | 0.196 |
| 364.0 | 0.139 |
| 364.1 | 0.105 |
| 364.2 | 0.106 |
| 364.3 | 0.139 |
| 364.4 | 0.192 |
| 364.5 | 0.239 |
| 364.6 | 0.268 |
| 364.7 | 0.263 |
| 364.8 | 0.23 |
| 364.9 | 0.175 |
| 365.0 | 0.119 |
| 365.1 | 0.074 |
| 365.2 | 0.045 |
| 365.3 | 0.027 |
| 365.4 | 0.335 |
| 365.5 | 0.33 |
| 365.6 | 0.329 |
| 365.7 | 0.333 |
| 365.8 | 0.338 |
| 365.9 | 0.34 |
| 366.0 | 0.07 |
| 366.1 | 0.063 |
| 366.2 | 0.058 |
| 366.3 | 0.053 |
| 366.4 | 0.046 |
| 366.5 | 0.042 |
| 366.6 | 0.039 |
| 366.7 | 0.038 |
| 366.8 | 0.035 |
| 366.9 | 0.033 |
| 367.0 | 0.032 |
| 367.1 | 0.03 |
| 367.2 | 0.03 |
| 367.3 | 0.027 |
| 367.4 | 0.025 |
| 367.5 | 0.022 |
| 367.6 | 0.023 |
| 367.7 | 0.023 |
| 367.8 | 0.023 |
| 367.9 | 0.022 |
| 368.0 | 0.022 |
| 368.1 | 0.021 |
| 368.2 | 0.021 |
| 368.3 | 0.023 |
| 368.4 | 0.022 |
| 368.5 | 0.024 |
| 368.6 | 0.021 |
| 368.7 | 0.023 |
| 368.8 | 0.022 |
| 368.9 | 0.023 |
| 369.0 | 0.023 |
| 369.1 | 0.021 |
| 369.2 | 0.02 |
| 369.3 | 0.02 |
| 369.4 | 0.021 |
| 369.5 | 0.022 |
| 369.6 | 0.02 |
| 369.7 | 0.018 |
| 369.8 | 0.018 |
| 369.9 | 0.018 |
| 370.0 | 0.028 |
| 370.1 | 0.012 |
| 370.2 | 0.014 |
| 370.3 | 0.017 |
| 370.4 | 0.019 |
| 370.5 | 0.02 |
| 370.6 | 0.019 |
| 370.7 | 0.018 |
| 370.8 | 0.017 |
| 370.9 | 0.017 |
| 371.0 | 0.016 |
| 371.1 | 0.014 |
| 371.2 | 0.014 |
| 371.3 | 0.014 |
| 371.4 | 0.016 |
| 371.5 | 0.015 |
| 371.6 | 0.017 |
| 371.7 | 0.017 |
| 371.8 | 0.017 |
| 371.9 | 0.016 |
| 372.0 | 0.014 |
| 372.1 | 0.013 |
| 372.2 | 0.012 |
| 372.3 | 0.011 |
| 372.4 | 0.012 |
| 372.5 | 0.011 |
| 372.6 | 0.012 |
| 372.7 | 0.011 |
| 372.8 | 0.008 |
| 372.9 | 0.008 |
| 373.0 | 0.008 |
| 373.1 | 0.01 |
| 373.2 | 0.01 |
| 373.3 | 0.008 |
| 373.4 | 0.006 |
| 373.5 | 0.006 |
| 373.6 | 0.006 |
| 373.7 | 0.007 |
| 373.8 | 0.007 |
| 373.9 | 0.008 |
| 374.0 | 0.006 |
| 374.1 | 0.006 |
| 374.2 | 0.006 |
| 374.3 | 0.006 |
| 374.4 | 0.007 |
| 374.5 | 0.007 |
| 374.6 | 0.008 |
| 374.7 | 0.007 |
| 374.8 | 0.008 |
| 374.9 | 0.008 |
| 375.0 | 0.009 |
| 375.1 | 0.006 |
| 375.2 | 0.006 |
| 375.3 | 0.005 |
| 375.4 | 0.007 |
| 375.5 | 0.008 |
| 375.6 | 0.009 |
| 375.7 | 0.009 |
| 375.8 | 0.007 |
| 375.9 | 0.007 |
| 376.0 | 0.008 |
| 376.1 | 0.009 |
| 376.2 | 0.01 |
| 376.3 | 0.01 |
| 376.4 | 0.01 |
| 376.5 | 0.01 |
| 376.6 | 0.008 |
| 376.7 | 0.008 |
| 376.8 | 0.009 |
| 376.9 | 0.011 |
| 377.0 | 0.01 |
| 377.1 | 0.009 |
| 377.2 | 0.01 |
| 377.3 | 0.009 |
| 377.4 | 0.01 |
| 377.5 | 0.01 |
| 377.6 | 0.01 |
| 377.7 | 0.008 |
| 377.8 | 0.007 |
| 377.9 | 0.008 |
| 378.0 | 0.009 |
| 378.1 | 0.01 |
| 378.2 | 0.01 |
| 378.3 | 0.01 |
| 378.4 | 0.01 |
| 378.5 | 0.008 |
| 378.6 | 0.008 |
| 378.7 | 0.007 |
| 378.8 | 0.009 |
| 378.9 | 0.009 |
| 379.0 | 0.008 |
| 379.1 | 0.008 |
| 379.2 | 0.007 |
| 379.3 | 0.01 |
| 379.4 | 0.009 |
| 379.5 | 0.01 |
| 379.6 | 0.009 |
| 379.7 | 0.009 |
| 379.8 | 0.008 |
| 379.9 | 0.007 |
| 380.0 | 0.006 |
| 380.1 | 0.007 |
| 380.2 | 0.006 |
| 380.3 | 0.006 |
| 380.4 | 0.004 |
| 380.5 | 0.006 |
| 380.6 | 0.005 |
| 380.7 | 0.005 |
| 380.8 | 0.004 |
| 380.9 | 0.004 |
| 381.0 | 0.005 |
| 381.1 | 0.005 |
| 381.2 | 0.006 |
| 381.3 | 0.006 |
| 381.4 | 0.009 |
| 381.5 | 0.009 |
| 381.6 | 0.009 |
| 381.7 | 0.011 |
| 381.8 | 0.01 |
| 381.9 | 0.01 |
| 382.0 | 0.007 |
| 382.1 | 0.008 |
| 382.2 | 0.008 |
| 382.3 | 0.009 |
| 382.4 | 0.007 |
| 382.5 | 0.007 |
| 382.6 | 0.008 |
| 382.7 | 0.009 |
| 382.8 | 0.009 |
| 382.9 | 0.01 |
| 383.0 | 0.011 |
| 383.1 | 0.01 |
| 383.2 | 0.009 |
| 383.3 | 0.009 |
| 383.4 | 0.01 |
| 383.5 | 0.011 |
| 383.6 | 0.01 |
| 383.7 | 0.012 |
| 383.8 | 0.013 |
| 383.9 | 0.02 |
| 384.0 | 0.026 |
| 384.1 | 0.033 |
| 384.2 | 0.038 |
| 384.3 | 0.04 |
| 384.4 | 0.036 |
| 384.5 | 0.03 |
| 384.6 | 0.022 |
| 384.7 | 0.018 |
| 384.8 | 0.013 |
| 384.9 | 0.012 |
| 385.0 | 0.011 |
| 385.1 | 0.011 |
| 385.2 | 0.012 |
| 385.3 | 0.014 |
| 385.4 | 0.016 |
| 385.5 | 0.016 |
| 385.6 | 0.012 |
| 385.7 | 0.012 |
| 385.8 | 0.011 |
| 385.9 | 0.012 |
| 386.0 | 0.012 |
| 386.1 | 0.013 |
| 386.2 | 0.015 |
| 386.3 | 0.014 |
| 386.4 | 0.012 |
| 386.5 | 0.01 |
| 386.6 | 0.009 |
| 386.7 | 0.008 |
| 386.8 | 0.009 |
| 386.9 | 0.011 |
| 387.0 | 0.011 |
| 387.1 | 0.011 |
| 387.2 | 0.011 |
| 387.3 | 0.012 |
| 387.4 | 0.011 |
| 387.5 | 0.01 |
| 387.6 | 0.009 |
| 387.7 | 0.01 |
| 387.8 | 0.009 |
| 387.9 | 0.009 |
| 388.0 | 0.008 |
| 388.1 | 0.009 |
| 388.2 | 0.008 |
| 388.3 | 0.009 |
| 388.4 | 0.009 |
| 388.5 | 0.007 |
| 388.6 | 0.008 |
| 388.7 | 0.007 |
| 388.8 | 0.007 |
| 388.9 | 0.007 |
| 389.0 | 0.007 |
| 389.1 | 0.008 |
| 389.2 | 0.007 |
| 389.3 | 0.008 |
| 389.4 | 0.006 |
| 389.5 | 0.006 |
| 389.6 | 0.005 |
| 389.7 | 0.004 |
| 389.8 | 0.005 |
| 389.9 | 0.005 |
| 390.0 | 0.006 |
| 390.1 | 0.005 |
| 390.2 | 0.005 |
| 390.3 | 0.003 |
| 390.4 | 0.004 |
| 390.5 | 0.004 |
| 390.6 | 0.004 |
| 390.7 | 0.004 |
| 390.8 | 0.005 |
| 390.9 | 0.005 |
| 391.0 | 0.004 |
| 391.1 | 0.002 |
| 391.2 | 0.002 |
| 391.3 | 0.005 |
| 391.4 | 0.006 |
| 391.5 | 0.006 |
| 391.6 | 0.004 |
| 391.7 | 0.004 |
| 391.8 | 0.003 |
| 391.9 | 0.004 |
| 392.0 | 0.004 |
| 392.1 | 0.005 |
| 392.2 | 0.003 |
| 392.3 | 0.004 |
| 392.4 | 0.004 |
| 392.5 | 0.006 |
| 392.6 | 0.006 |
| 392.7 | 0.006 |
| 392.8 | 0.004 |
| 392.9 | 0.003 |
| 393.0 | 0.001 |
| 393.1 | 0.002 |
| 393.2 | 0.002 |
| 393.3 | 0.003 |
| 393.4 | 0.003 |
| 393.5 | 0.003 |
| 393.6 | 0.002 |
| 393.7 | 0.001 |
| 393.8 | 0 |
| 393.9 | 0.002 |
| 394.0 | 0.003 |
| 394.1 | 0.003 |
| 394.2 | 0.002 |
| 394.3 | 0.004 |
| 394.4 | 0.003 |
| 394.5 | 0.004 |
| 394.6 | 0.004 |
| 394.7 | 0.004 |
| 394.8 | 0.004 |
| 394.9 | 0.002 |
| 395.0 | 0.003 |
| 395.1 | 0.002 |
| 395.2 | 0.002 |
| 395.3 | 0.002 |
| 395.4 | 0.003 |
| 395.5 | 0.004 |
| 395.6 | 0.003 |
| 395.7 | 0.003 |
| 395.8 | 0.004 |
| 395.9 | 0.006 |
| 396.0 | 0.007 |
| 396.1 | 0.006 |
| 396.2 | 0.006 |
| 396.3 | 0.006 |
| 396.4 | 0.007 |
| 396.5 | 0.007 |
| 396.6 | 0.007 |
| 396.7 | 0.006 |
| 396.8 | 0.006 |
| 396.9 | 0.005 |
| 397.0 | 0.005 |
| 397.1 | 0.005 |
| 397.2 | 0.006 |
| 397.3 | 0.006 |
| 397.4 | 0.007 |
| 397.5 | 0.006 |
| 397.6 | 0.007 |
| 397.7 | 0.006 |
| 397.8 | 0.007 |
| 397.9 | 0.008 |
| 398.0 | 0.006 |
| 398.1 | 0.006 |
| 398.2 | 0.005 |
| 398.3 | 0.005 |
| 398.4 | 0.005 |
| 398.5 | 0.007 |
| 398.6 | 0.007 |
| 398.7 | 0.007 |
| 398.8 | 0.007 |
| 398.9 | 0.006 |
| 399.0 | 0.007 |
| 399.1 | 0.005 |
| 399.2 | 0.006 |
| 399.3 | 0.004 |
| 399.4 | 0.007 |
| 399.5 | 0.006 |
| 399.6 | 0.006 |
| 399.7 | 0.005 |
| 399.8 | 0.005 |
| 399.9 | 0.005 |
| 400.0 | 0.004 |
| 400.1 | 0.004 |
| 400.2 | 0.004 |
| 400.3 | 0.005 |
| 400.4 | 0.004 |
| 400.5 | 0.005 |
| 400.6 | 0.006 |
| 400.7 | 0.005 |
| 400.8 | 0.005 |
| 400.9 | 0.006 |
| 401.0 | 0.006 |
| 401.1 | 0.006 |
| 401.2 | 0.004 |
| 401.3 | 0.004 |
| 401.4 | 0.003 |
| 401.5 | 0.004 |
| 401.6 | 0.003 |
| 401.7 | 0.002 |
| 401.8 | 0.002 |
| 401.9 | 0.002 |
| 402.0 | 0.003 |
| 402.1 | 0.004 |
| 402.2 | 0.004 |
| 402.3 | 0.005 |
| 402.4 | 0.005 |
| 402.5 | 0.004 |
| 402.6 | 0.003 |
| 402.7 | 0.001 |
| 402.8 | 0 |
| 402.9 | 0.001 |
| 403.0 | 0.003 |
| 403.1 | 0.002 |
| 403.2 | 0.003 |
| 403.3 | 0.001 |
| 403.4 | 0.001 |
| 403.5 | 0.001 |
| 403.6 | 0.002 |
| 403.7 | 0.001 |
| 403.8 | 0 |
| 403.9 | 0.003 |
| 404.0 | 0.002 |
| 404.1 | 0.003 |
| 404.2 | 0.002 |
| 404.3 | 0.002 |
| 404.4 | 0 |
| 404.5 | 0.002 |
| 404.6 | 0 |
| 404.7 | 0 |
| 404.8 | 0.002 |
| 404.9 | 0.001 |
| 405.0 | 0.002 |
| 405.1 | 0.002 |
| 405.2 | 0.001 |
| 405.3 | 0.002 |
| 405.4 | 0.002 |
| 405.5 | 0.002 |
| 405.6 | 0.002 |
| 405.7 | 0.002 |
| 405.8 | 0.002 |
| 405.9 | 0.002 |
| 406.0 | 0.001 |
| 406.1 | 0.001 |
| 406.2 | 0 |
| 406.3 | 0 |
| 406.4 | 0.002 |
| 406.5 | 0.002 |
| 406.6 | 0.002 |
| 406.7 | 0.002 |
| 406.8 | 0.001 |
| 406.9 | 0.001 |
| 407.0 | 0.002 |
| 407.1 | 0.001 |
| 407.2 | 0 |
| 407.3 | 0 |
| 407.4 | 0.001 |
| 407.5 | 0.001 |
| 407.6 | 0 |
| 407.7 | 0 |
| 407.8 | 0.001 |
| 407.9 | 0.001 |
| 408.0 | 0.001 |
| 408.1 | 0.001 |
| 408.2 | 0.001 |
| 408.3 | 0.001 |
| 408.4 | 0 |
| 408.5 | 0.002 |
| 408.6 | 0.002 |
| 408.7 | 0.001 |
| 408.8 | 0.002 |
| 408.9 | 0 |
| 409.0 | 0.002 |
| 409.1 | 0.002 |
| 409.2 | 0.002 |
| 409.3 | 0.002 |
| 409.4 | 0 |
| 409.5 | 0.001 |
| 409.6 | 0.003 |
| 409.7 | 0.002 |
| 409.8 | 0.001 |
| 409.9 | 0.001 |
| 410.0 | 0.002 |
| 410.1 | 0.001 |
| 410.2 | 0.001 |
| 410.3 | 0.001 |
| 410.4 | 0.001 |
| 410.5 | 0.001 |
| 410.6 | 0 |
| 410.7 | 0.001 |
| 410.8 | 0 |
| 410.9 | 0.002 |
| 411.0 | 0.001 |
| 411.1 | 0.002 |
| 411.2 | 0.001 |
| 411.3 | 0.001 |
| 411.4 | 0.001 |
| 411.5 | 0.002 |
| 411.6 | 0.001 |
| 411.7 | 0.001 |
| 411.8 | 0.001 |
| 411.9 | 0.002 |
| 412.0 | 0 |
| 412.1 | 0 |
| 412.2 | 0.001 |
| 412.3 | 0.001 |
| 412.4 | 0.002 |
| 412.5 | 0.001 |
| 412.6 | 0.001 |
| 412.7 | 0.001 |
| 412.8 | 0.001 |
| 412.9 | 0.001 |
| 413.0 | 0.001 |
| 413.1 | 0.002 |
| 413.2 | 0.001 |
| 413.3 | 0.001 |
| 413.4 | 0.002 |
| 413.5 | 0.001 |
| 413.6 | 0.001 |
| 413.7 | 0.001 |
| 413.8 | 0.002 |
| 413.9 | 0.001 |
| 414.0 | 0.001 |
| 414.1 | 0.001 |
| 414.2 | 0.002 |
| 414.3 | 0.003 |
| 414.4 | 0.002 |
| 414.5 | 0.002 |
| 414.6 | 0.002 |
| 414.7 | 0.002 |
| 414.8 | 0.003 |
| 414.9 | 0.002 |
| 415.0 | 0.002 |
| 415.1 | 0.001 |
| 415.2 | 0.002 |
| 415.3 | 0.002 |
| 415.4 | 0.003 |
| 415.5 | 0.002 |
| 415.6 | 0.003 |
| 415.7 | 0.003 |
| 415.8 | 0.003 |
| 415.9 | 0.004 |
| 416.0 | 0.003 |
| 416.1 | 0.004 |
| 416.2 | 0.003 |
| 416.3 | 0.003 |
| 416.4 | 0.004 |
| 416.5 | 0.002 |
| 416.6 | 0.002 |
| 416.7 | 0.001 |
| 416.8 | 0.002 |
| 416.9 | 0.002 |
| 417.0 | 0.003 |
| 417.1 | 0.003 |
| 417.2 | 0.005 |
| 417.3 | 0.006 |
| 417.4 | 0.004 |
| 417.5 | 0.004 |
| 417.6 | 0.004 |
| 417.7 | 0.005 |
| 417.8 | 0.004 |
| 417.9 | 0.004 |
| 418.0 | 0.004 |
| 418.1 | 0.004 |
| 418.2 | 0.005 |
| 418.3 | 0.006 |
| 418.4 | 0.006 |
| 418.5 | 0.007 |
| 418.6 | 0.007 |
| 418.7 | 0.007 |
| 418.8 | 0.007 |
| 418.9 | 0.007 |
| 419.0 | 0.008 |
| 419.1 | 0.008 |
| 419.2 | 0.008 |
| 419.3 | 0.008 |
| 419.4 | 0.008 |
| 419.5 | 0.008 |
| 419.6 | 0.006 |
| 419.7 | 0.005 |
| 419.8 | 0.005 |
| 419.9 | 0.005 |
| 420.0 | 0.005 |
| 420.1 | 0.005 |
| 420.2 | 0.006 |
| 420.3 | 0.007 |
| 420.4 | 0.008 |
| 420.5 | 0.008 |
| 420.6 | 0.007 |
| 420.7 | 0.005 |
| 420.8 | 0.004 |
| 420.9 | 0.005 |
| 421.0 | 0.006 |
| 421.1 | 0.008 |
| 421.2 | 0.011 |
| 421.3 | 0.014 |
| 421.4 | 0.016 |
| 421.5 | 0.017 |
| 421.6 | 0.015 |
| 421.7 | 0.013 |
| 421.8 | 0.009 |
| 421.9 | 0.008 |
| 422.0 | 0.006 |
| 422.1 | 0.006 |
| 422.2 | 0.006 |
| 422.3 | 0.007 |
| 422.4 | 0.008 |
| 422.5 | 0.01 |
| 422.6 | 0.009 |
| 422.7 | 0.008 |
| 422.8 | 0.007 |
| 422.9 | 0.008 |
| 423.0 | 0.008 |
| 423.1 | 0.008 |
| 423.2 | 0.008 |
| 423.3 | 0.009 |
| 423.4 | 0.011 |
| 423.5 | 0.01 |
| 423.6 | 0.01 |
| 423.7 | 0.008 |
| 423.8 | 0.009 |
| 423.9 | 0.009 |
| 424.0 | 0.009 |
| 424.1 | 0.008 |
| 424.2 | 0.008 |
| 424.3 | 0.009 |
| 424.4 | 0.008 |
| 424.5 | 0.008 |
| 424.6 | 0.007 |
| 424.7 | 0.008 |
| 424.8 | 0.01 |
| 424.9 | 0.011 |
| 425.0 | 0.011 |
| 425.1 | 0.01 |
| 425.2 | 0.009 |
| 425.3 | 0.01 |
| 425.4 | 0.011 |
| 425.5 | 0.011 |
| 425.6 | 0.01 |
| 425.7 | 0.008 |
| 425.8 | 0.008 |
| 425.9 | 0.008 |
| 426.0 | 0.008 |
| 426.1 | 0.008 |
| 426.2 | 0.008 |
| 426.3 | 0.008 |
| 426.4 | 0.008 |
| 426.5 | 0.007 |
| 426.6 | 0.008 |
| 426.7 | 0.006 |
| 426.8 | 0.007 |
| 426.9 | 0.006 |
| 427.0 | 0.007 |
| 427.1 | 0.007 |
| 427.2 | 0.007 |
| 427.3 | 0.008 |
| 427.4 | 0.008 |
| 427.5 | 0.008 |
| 427.6 | 0.008 |
| 427.7 | 0.008 |
| 427.8 | 0.009 |
| 427.9 | 0.01 |
| 428.0 | 0.009 |
| 428.1 | 0.009 |
| 428.2 | 0.009 |
| 428.3 | 0.009 |
| 428.4 | 0.009 |
| 428.5 | 0.006 |
| 428.6 | 0.007 |
| 428.7 | 0.008 |
| 428.8 | 0.01 |
| 428.9 | 0.01 |
| 429.0 | 0.011 |
| 429.1 | 0.01 |
| 429.2 | 0.011 |
| 429.3 | 0.01 |
| 429.4 | 0.01 |
| 429.5 | 0.011 |
| 429.6 | 0.01 |
| 429.7 | 0.01 |
| 429.8 | 0.009 |
| 429.9 | 0.01 |
| 430.0 | 0.011 |
| 430.1 | 0.001 |
| 430.2 | 0.001 |
| 430.3 | 0.001 |
| 430.4 | 0.002 |
| 430.5 | 0.003 |
| 430.6 | 0.004 |
| 430.7 | 0.006 |
| 430.8 | 0.011 |
| 430.9 | 0.029 |
| 431.0 | 0.064 |
| 431.1 | 0.115 |
| 431.2 | 0.178 |
| 431.3 | 0.236 |
| 431.4 | 0.265 |
| 431.5 | 0.255 |
| 431.6 | 0.21 |
| 431.7 | 0.149 |
| 431.8 | 0.09 |
| 431.9 | 0.046 |
| 432.0 | 0.021 |
| 432.1 | 0.008 |
| 432.2 | 0.003 |
| 432.3 | 0.001 |
| 432.4 | 0.001 |
| 432.5 | 0.001 |
| 432.6 | 0.001 |
| 432.7 | 0.001 |
| 432.8 | 0.002 |
| 432.9 | 0.004 |
| 433.0 | 0.008 |
| 433.1 | 0.015 |
| 433.2 | 0.028 |
| 433.3 | 0.045 |
| 433.4 | 0.068 |
| 433.5 | 0.09 |
| 433.6 | 0.108 |
| 433.7 | 0.117 |
| 433.8 | 0.111 |
| 433.9 | 0.095 |
| 434.0 | 0.071 |
| 434.1 | 0.047 |
| 434.2 | 0.026 |
| 434.3 | 0.011 |
| 434.4 | 0.004 |
| 434.5 | 0.002 |
| 434.6 | 0.003 |
| 434.7 | 0.005 |
| 434.8 | 0.009 |
| 434.9 | 0.012 |
| 435.0 | 0.016 |
| 435.1 | 0.019 |
| 435.2 | 0.019 |
| 435.3 | 0.014 |
| 435.4 | 0.01 |
| 435.5 | 0.007 |
| 435.6 | 0.005 |
| 435.7 | 0.002 |
| 435.8 | 0.001 |
| 435.9 | 0.002 |
| 436.0 | 0.002 |
| 436.1 | 0.001 |
| 436.2 | 0.001 |
| 436.3 | 0.002 |
| 436.4 | 0.002 |
| 436.5 | 0.005 |
| 436.6 | 0.007 |
| 436.7 | 0.012 |
| 436.8 | 0.019 |
| 436.9 | 0.027 |
| 437.0 | 0.034 |
| 437.1 | 0.038 |
| 437.2 | 0.037 |
| 437.3 | 0.034 |
| 437.4 | 0.026 |
| 437.5 | 0.019 |
| 437.6 | 0.012 |
| 437.7 | 0.008 |
| 437.8 | 0.005 |
| 437.9 | 0.002 |
| 438.0 | 0.001 |
| 438.1 | 0 |
| 438.2 | 0.002 |
| 438.3 | 0.001 |
| 438.4 | 0.001 |
| 438.5 | 0 |
| 438.6 | 0.001 |
| 438.7 | 0 |
| 438.8 | 0.001 |
| 438.9 | 0.001 |
| 439.0 | 0.002 |
| 439.1 | 0.001 |
| 439.2 | 0.001 |
| 439.3 | 0.001 |
| 439.4 | 0 |
| 439.5 | 0.002 |
| 439.6 | 0 |
| 439.7 | 0.001 |
| 439.8 | 0 |
| 439.9 | 0.001 |
| 440.0 | 0.002 |
| 440.1 | 0.002 |
| 440.2 | 0.002 |
| 440.3 | 0.002 |
| 440.4 | 0.001 |
| 440.5 | 0.002 |
| 440.6 | 0 |
| 440.7 | 0.001 |
| 440.8 | 0.001 |
| 440.9 | 0.001 |
| 441.0 | 0.001 |
| 441.1 | 0.001 |
| 441.2 | 0.001 |
| 441.3 | 0.001 |
| 441.4 | 0.003 |
| 441.5 | 0.003 |
| 441.6 | 0 |
| 441.7 | 0.001 |
| 441.8 | 0.003 |
| 441.9 | 0.003 |
| 442.0 | 0.002 |
| 442.1 | 0.001 |
| 442.2 | 0.001 |
| 442.3 | 0.001 |
| 442.4 | 0.001 |
| 442.5 | 0.002 |
| 442.6 | 0.002 |
| 442.7 | 0.001 |
| 442.8 | 0 |
| 442.9 | 0 |
| 443.0 | 0.001 |
| 443.1 | 0.001 |
| 443.2 | 0.001 |
| 443.3 | 0.002 |
| 443.4 | 0.001 |
| 443.5 | 0.001 |
| 443.6 | 0.002 |
| 443.7 | 0 |
| 443.8 | 0.001 |
| 443.9 | 0.002 |
| 444.0 | 0.002 |
| 444.1 | 0.001 |
| 444.2 | 0.001 |
| 444.3 | 0.001 |
| 444.4 | 0.002 |
| 444.5 | 0.001 |
| 444.6 | 0.001 |
| 444.7 | 0 |
| 444.8 | 0.001 |
| 444.9 | 0.001 |
| 445.0 | 0.001 |
| 445.1 | 0.001 |
| 445.2 | 0.002 |
| 445.3 | 0.002 |
| 445.4 | 0.002 |
| 445.5 | 0.001 |
| 445.6 | 0.001 |
| 445.7 | 0.001 |
| 445.8 | 0.002 |
| 445.9 | 0.003 |
| 446.0 | 0.002 |
| 446.1 | 0.001 |
| 446.2 | 0.001 |
| 446.3 | 0.002 |
| 446.4 | 0.003 |
| 446.5 | 0.002 |
| 446.6 | 0.002 |
| 446.7 | 0.002 |
| 446.8 | 0.003 |
| 446.9 | 0.003 |
| 447.0 | 0.003 |
| 447.1 | 0.004 |
| 447.2 | 0.004 |
| 447.3 | 0.004 |
| 447.4 | 0.004 |
| 447.5 | 0.004 |
| 447.6 | 0.004 |
| 447.7 | 0.005 |
| 447.8 | 0.005 |
| 447.9 | 0.005 |
| 448.0 | 0.005 |
| 448.1 | 0.006 |
| 448.2 | 0.007 |
| 448.3 | 0.008 |
| 448.4 | 0.008 |
| 448.5 | 0.006 |
| 448.6 | 0.006 |
| 448.7 | 0.006 |
| 448.8 | 0.007 |
| 448.9 | 0.007 |
| 449.0 | 0.007 |
| 449.1 | 0.007 |
| 449.2 | 0.008 |
| 449.3 | 0.009 |
| 449.4 | 0.01 |
| 449.5 | 0.01 |
| 449.6 | 0.01 |
| 449.7 | 0.012 |
| 449.8 | 0.013 |
| 449.9 | 0.013 |
| 450.0 | 0.013 |
| 450.1 | 0.014 |
| 450.2 | 0.015 |
| 450.3 | 0.016 |
| 450.4 | 0.017 |
| 450.5 | 0.018 |
| 450.6 | 0.019 |
| 450.7 | 0.02 |
| 450.8 | 0.021 |
| 450.9 | 0.021 |
| 451.0 | 0.021 |
| 451.1 | 0.022 |
| 451.2 | 0.023 |
| 451.3 | 0.024 |
| 451.4 | 0.024 |
| 451.5 | 0.025 |
| 451.6 | 0.026 |
| 451.7 | 0.026 |
| 451.8 | 0.027 |
| 451.9 | 0.028 |
| 452.0 | 0.031 |
| 452.1 | 0.034 |
| 452.2 | 0.037 |
| 452.3 | 0.039 |
| 452.4 | 0.042 |
| 452.5 | 0.045 |
| 452.6 | 0.05 |
| 452.7 | 0.054 |
| 452.8 | 0.061 |
| 452.9 | 0.067 |
| 453.0 | 0.076 |
| 453.1 | 0.084 |
| 453.2 | 0.092 |
| 453.3 | 0.098 |
| 453.4 | 0.102 |
| 453.5 | 0.103 |
| 453.6 | 0.1 |
| 453.7 | 0.093 |
| 453.8 | 0.084 |
| 453.9 | 0.072 |
| 454.0 | 0.062 |
| 454.1 | 0.055 |
| 454.2 | 0.049 |
| 454.3 | 0.046 |
| 454.4 | 0.042 |
| 454.5 | 0.04 |
| 454.6 | 0.04 |
| 454.7 | 0.042 |
| 454.8 | 0.045 |
| 454.9 | 0.048 |
| 455.0 | 0.051 |
| 455.1 | 0.054 |
| 455.2 | 0.058 |
| 455.3 | 0.063 |
| 455.4 | 0.066 |
| 455.5 | 0.067 |
| 455.6 | 0.067 |
| 455.7 | 0.066 |
| 455.8 | 0.065 |
| 455.9 | 0.063 |
| 456.0 | 0.061 |
| 456.1 | 0.06 |
| 456.2 | 0.058 |
| 456.3 | 0.056 |
| 456.4 | 0.053 |
| 456.5 | 0.05 |
| 456.6 | 0.047 |
| 456.7 | 0.045 |
| 456.8 | 0.044 |
| 456.9 | 0.045 |
| 457.0 | 0.048 |
| 457.1 | 0.053 |
| 457.2 | 0.061 |
| 457.3 | 0.073 |
| 457.4 | 0.088 |
| 457.5 | 0.11 |
| 457.6 | 0.139 |
| 457.7 | 0.179 |
| 457.8 | 0.227 |
| 457.9 | 0.276 |
| 458.0 | 0.316 |
| 458.1 | 0.338 |
| 458.2 | 0.34 |
| 458.3 | 0.325 |
| 458.4 | 0.296 |
| 458.5 | 0.259 |
| 458.6 | 0.22 |
| 458.7 | 0.181 |
| 458.8 | 0.145 |
| 458.9 | 0.113 |
| 459.0 | 0.089 |
| 459.1 | 0.072 |
| 459.2 | 0.06 |
| 459.3 | 0.052 |
| 459.4 | 0.046 |
| 459.5 | 0.041 |
| 459.6 | 0.04 |
| 459.7 | 0.039 |
| 459.8 | 0.039 |
| 459.9 | 0.038 |
| 460.0 | 0.038 |
| 460.1 | 0.039 |
| 460.2 | 0.042 |
| 460.3 | 0.044 |
| 460.4 | 0.048 |
| 460.5 | 0.052 |
| 460.6 | 0.057 |
| 460.7 | 0.059 |
| 460.8 | 0.06 |
| 460.9 | 0.059 |
| 461.0 | 0.056 |
| 461.1 | 0.052 |
| 461.2 | 0.048 |
| 461.3 | 0.044 |
| 461.4 | 0.039 |
| 461.5 | 0.035 |
| 461.6 | 0.032 |
| 461.7 | 0.03 |
| 461.8 | 0.03 |
| 461.9 | 0.031 |
| 462.0 | 0.034 |
| 462.1 | 0.037 |
| 462.2 | 0.043 |
| 462.3 | 0.05 |
| 462.4 | 0.057 |
| 462.5 | 0.062 |
| 462.6 | 0.068 |
| 462.7 | 0.072 |
| 462.8 | 0.075 |
| 462.9 | 0.075 |
| 463.0 | 0.072 |
| 463.1 | 0.067 |
| 463.2 | 0.06 |
| 463.3 | 0.052 |
| 463.4 | 0.045 |
| 463.5 | 0.04 |
| 463.6 | 0.035 |
| 463.7 | 0.031 |
| 463.8 | 0.029 |
| 463.9 | 0.027 |
| 464.0 | 0.027 |
| 464.1 | 0.026 |
| 464.2 | 0.025 |
| 464.3 | 0.025 |
| 464.4 | 0.024 |
| 464.5 | 0.024 |
| 464.6 | 0.022 |
| 464.7 | 0.021 |
| 464.8 | 0.018 |
| 464.9 | 0.016 |
| 465.0 | 0.014 |
| 465.1 | 0.013 |
| 465.2 | 0.013 |
| 465.3 | 0.011 |
| 465.4 | 0.01 |
| 465.5 | 0.009 |
| 465.6 | 0.009 |
| 465.7 | 0.008 |
| 465.8 | 0.008 |
| 465.9 | 0.006 |
| 466.0 | 0.006 |
| 466.1 | 0.005 |
| 466.2 | 0.006 |
| 466.3 | 0.007 |
| 466.4 | 0.009 |
| 466.5 | 0.01 |
| 466.6 | 0.012 |
| 466.7 | 0.013 |
| 466.8 | 0.014 |
| 466.9 | 0.016 |
| 467.0 | 0.017 |
| 467.1 | 0.016 |
| 467.2 | 0.014 |
| 467.3 | 0.011 |
| 467.4 | 0.009 |
| 467.5 | 0.007 |
| 467.6 | 0.005 |
| 467.7 | 0.003 |
| 467.8 | 0 |
| 467.9 | 0 |
| 468.0 | 0 |
| 468.1 | 0.001 |
| 468.2 | 0.002 |
| 468.3 | 0.001 |
| 468.4 | 0 |
| 468.5 | 0.007 |
| 468.6 | 0.005 |
| 468.7 | 0 |
| 468.8 | 0.001 |
| 468.9 | 0.001 |
| 469.0 | 0.001 |
| 469.1 | 0.001 |
| 469.2 | 0.001 |
| 469.3 | 0.001 |
| 469.4 | 0.001 |
| 469.5 | 0.002 |
| 469.6 | 0.002 |
| 469.7 | 0 |
| 469.8 | 0 |
| 469.9 | 0.001 |
| 470.0 | 0.002 |
| 470.1 | 0.002 |
| 470.2 | 0.002 |
| 470.3 | 0.001 |
| 470.4 | 0 |
| 470.5 | 0 |
| 470.6 | 0.001 |
| 470.7 | 0.001 |
| 470.8 | 0.001 |
| 470.9 | 0.002 |
| 471.0 | 0.003 |
| 471.1 | 0.005 |
| 471.2 | 0.008 |
| 471.3 | 0.013 |
| 471.4 | 0.021 |
| 471.5 | 0.031 |
| 471.6 | 0.044 |
| 471.7 | 0.062 |
| 471.8 | 0.08 |
| 471.9 | 0.094 |
| 472.0 | 0.101 |
| 472.1 | 0.1 |
| 472.2 | 0.09 |
| 472.3 | 0.078 |
| 472.4 | 0.065 |
| 472.5 | 0.055 |
| 472.6 | 0.047 |
| 472.7 | 0.042 |
| 472.8 | 0.039 |
| 472.9 | 0.037 |
| 473.0 | 0.034 |
| 473.1 | 0.03 |
| 473.2 | 0.026 |
| 473.3 | 0.024 |
| 473.4 | 0.024 |
| 473.5 | 0.025 |
| 473.6 | 0.027 |
| 473.7 | 0.03 |
| 473.8 | 0.032 |
| 473.9 | 0.031 |
| 474.0 | 0.028 |
| 474.1 | 0.026 |
| 474.2 | 0.025 |
| 474.3 | 0.028 |
| 474.4 | 0.03 |
| 474.5 | 0.034 |
| 474.6 | 0.038 |
| 474.7 | 0.041 |
| 474.8 | 0.043 |
| 474.9 | 0.042 |
| 475.0 | 0.04 |
| 475.1 | 0.039 |
| 475.2 | 0.038 |
| 475.3 | 0.039 |
| 475.4 | 0.04 |
| 475.5 | 0.042 |
| 475.6 | 0.044 |
| 475.7 | 0.048 |
| 475.8 | 0.053 |
| 475.9 | 0.062 |
| 476.0 | 0.073 |
| 476.1 | 0.086 |
| 476.2 | 0.099 |
| 476.3 | 0.109 |
| 476.4 | 0.111 |
| 476.5 | 0.102 |
| 476.6 | 0.087 |
| 476.7 | 0.068 |
| 476.8 | 0.051 |
| 476.9 | 0.038 |
| 477.0 | 0.031 |
| 477.1 | 0.026 |
| 477.2 | 0.025 |
| 477.3 | 0.025 |
| 477.4 | 0.026 |
| 477.5 | 0.028 |
| 477.6 | 0.03 |
| 477.7 | 0.032 |
| 477.8 | 0.034 |
| 477.9 | 0.035 |
| 478.0 | 0.035 |
| 478.1 | 0.034 |
| 478.2 | 0.034 |
| 478.3 | 0.034 |
| 478.4 | 0.032 |
| 478.5 | 0.033 |
| 478.6 | 0.034 |
| 478.7 | 0.037 |
| 478.8 | 0.041 |
| 478.9 | 0.047 |
| 479.0 | 0.053 |
| 479.1 | 0.059 |
| 479.2 | 0.065 |
| 479.3 | 0.069 |
| 479.4 | 0.07 |
| 479.5 | 0.069 |
| 479.6 | 0.063 |
| 479.7 | 0.057 |
| 479.8 | 0.051 |
| 479.9 | 0.047 |
| 480.0 | 0.048 |
| 480.1 | 0.056 |
| 480.2 | 0.08 |
| 480.3 | 0.124 |
| 480.4 | 0.194 |
| 480.5 | 0.289 |
| 480.6 | 0.392 |
| 480.7 | 0.488 |
| 480.8 | 0.555 |
| 480.9 | 0.588 |
| 481.0 | 0.586 |
| 481.1 | 0.549 |
| 481.2 | 0.477 |
| 481.3 | 0.386 |
| 481.4 | 0.286 |
| 481.5 | 0.196 |
| 481.6 | 0.126 |
| 481.7 | 0.089 |
| 481.8 | 0.079 |
| 481.9 | 0.084 |
| 482.0 | 0.093 |
| 482.1 | 0.099 |
| 482.2 | 0.099 |
| 482.3 | 0.09 |
| 482.4 | 0.073 |
| 482.5 | 0.054 |
| 482.6 | 0.038 |
| 482.7 | 0.027 |
| 482.8 | 0.024 |
| 482.9 | 0.026 |
| 483.0 | 0.034 |
| 483.1 | 0.045 |
| 483.2 | 0.06 |
| 483.3 | 0.077 |
| 483.4 | 0.093 |
| 483.5 | 0.104 |
| 483.6 | 0.107 |
| 483.7 | 0.102 |
| 483.8 | 0.092 |
| 483.9 | 0.079 |
| 484.0 | 0.066 |
| 484.1 | 0.054 |
| 484.2 | 0.043 |
| 484.3 | 0.037 |
| 484.4 | 0.036 |
| 484.5 | 0.042 |
| 484.6 | 0.054 |
| 484.7 | 0.069 |
| 484.8 | 0.085 |
| 484.9 | 0.099 |
| 485.0 | 0.11 |
| 485.1 | 0.116 |
| 485.2 | 0.118 |
| 485.3 | 0.117 |
| 485.4 | 0.115 |
| 485.5 | 0.112 |
| 485.6 | 0.107 |
| 485.7 | 0.1 |
| 485.8 | 0.088 |
| 485.9 | 0.073 |
| 486.0 | 0.057 |
| 486.1 | 0.043 |
| 486.2 | 0.032 |
| 486.3 | 0.027 |
| 486.4 | 0.028 |
| 486.5 | 0.033 |
| 486.6 | 0.04 |
| 486.7 | 0.045 |
| 486.8 | 0.047 |
| 486.9 | 0.046 |
| 487.0 | 0.041 |
| 487.1 | 0.034 |
| 487.2 | 0.028 |
| 487.3 | 0.022 |
| 487.4 | 0.019 |
| 487.5 | 0.018 |
| 487.6 | 0.022 |
| 487.7 | 0.029 |
| 487.8 | 0.037 |
| 487.9 | 0.044 |
| 488.0 | 0.05 |
| 488.1 | 0.052 |
| 488.2 | 0.052 |
| 488.3 | 0.046 |
| 488.4 | 0.039 |
| 488.5 | 0.03 |
| 488.6 | 0.022 |
| 488.7 | 0.017 |
| 488.8 | 0.014 |
| 488.9 | 0.014 |
| 489.0 | 0.013 |
| 489.1 | 0.011 |
| 489.2 | 0.01 |
| 489.3 | 0.007 |
| 489.4 | 0.005 |
| 489.5 | 0.003 |
| 489.6 | 0.002 |
| 489.7 | 0.001 |
| 489.8 | 0.001 |
| 489.9 | 0.001 |
| 490.0 | 0.01 |
| 490.1 | 0.007 |
| 490.2 | 0.005 |
| 490.3 | 0 |
| 490.4 | 0 |
| 490.5 | 0.001 |
| 490.6 | 0.001 |
| 490.7 | 0.01 |
| 490.8 | 0.001 |
| 490.9 | 0.001 |
| 491.0 | 0.01 |
| 491.1 | 0.007 |
| 491.2 | 0.001 |
| 491.3 | 0.001 |
| 491.4 | 0 |
| 491.5 | 0.001 |
| 491.6 | 0.001 |
| 491.7 | 0 |
| 491.8 | 0 |
| 491.9 | 0 |
| 492.0 | 0 |
| 492.1 | 0.001 |
| 492.2 | 0.001 |
| 492.3 | 0.001 |
| 492.4 | 0.001 |
| 492.5 | 0.001 |
| 492.6 | 0.002 |
| 492.7 | 0.002 |
| 492.8 | 0.002 |
| 492.9 | 0.001 |
| 493.0 | 0.001 |
| 493.1 | 0 |
| 493.2 | 0 |
| 493.3 | 0 |
| 493.4 | 0.001 |
| 493.5 | 0.001 |
| 493.6 | 0.001 |
| 493.7 | 0.001 |
| 493.8 | 0.001 |
| 493.9 | 0.002 |
| 494.0 | 0.002 |
| 494.1 | 0.003 |
| 494.2 | 0.002 |
| 494.3 | 0.003 |
| 494.4 | 0.003 |
| 494.5 | 0.003 |
| 494.6 | 0.002 |
| 494.7 | 0.003 |
| 494.8 | 0.003 |
| 494.9 | 0.004 |
| 495.0 | 0.004 |
| 495.1 | 0.005 |
| 495.2 | 0.005 |
| 495.3 | 0.006 |
| 495.4 | 0.007 |
| 495.5 | 0.007 |
| 495.6 | 0.006 |
| 495.7 | 0.005 |
| 495.8 | 0.007 |
| 495.9 | 0.007 |
| 496.0 | 0.008 |
| 496.1 | 0.008 |
| 496.2 | 0.011 |
| 496.3 | 0.011 |
| 496.4 | 0.011 |
| 496.5 | 0.011 |
| 496.6 | 0.013 |
| 496.7 | 0.016 |
| 496.8 | 0.018 |
| 496.9 | 0.02 |
| 497.0 | 0.023 |
| 497.1 | 0.025 |
| 497.2 | 0.028 |
| 497.3 | 0.031 |
| 497.4 | 0.036 |
| 497.5 | 0.042 |
| 497.6 | 0.047 |
| 497.7 | 0.053 |
| 497.8 | 0.059 |
| 497.9 | 0.066 |
| 498.0 | 0.073 |
| 498.1 | 0.08 |
| 498.2 | 0.086 |
| 498.3 | 0.091 |
| 498.4 | 0.095 |
| 498.5 | 0.099 |
| 498.6 | 0.1 |
| 498.7 | 0.1 |
| 498.8 | 0.099 |
| 498.9 | 0.096 |
| 499.0 | 0.092 |
| 499.1 | 0.087 |
| 499.2 | 0.082 |
| 499.3 | 0.077 |
| 499.4 | 0.071 |
| 499.5 | 0.065 |
| 499.6 | 0.06 |
| 499.7 | 0.057 |
| 499.8 | 0.053 |
| 499.9 | 0.05 |
| 500.0 | 0.046 |
| 500.1 | 0.045 |
| 500.2 | 0.044 |
| 500.3 | 0.043 |
| 500.4 | 0.042 |
| 500.5 | 0.042 |
| 500.6 | 0.042 |
| 500.7 | 0.042 |
| 500.8 | 0.042 |
| 500.9 | 0.042 |
| 501.0 | 0.043 |
| 501.1 | 0.043 |
| 501.2 | 0.043 |
| 501.3 | 0.044 |
| 501.4 | 0.047 |
| 501.5 | 0.048 |
| 501.6 | 0.049 |
| 501.7 | 0.05 |
| 501.8 | 0.05 |
| 501.9 | 0.051 |
| 502.0 | 0.053 |
| 502.1 | 0.054 |
| 502.2 | 0.054 |
| 502.3 | 0.056 |
| 502.4 | 0.057 |
| 502.5 | 0.058 |
| 502.6 | 0.06 |
| 502.7 | 0.063 |
| 502.8 | 0.067 |
| 502.9 | 0.07 |
| 503.0 | 0.073 |
| 503.1 | 0.077 |
| 503.2 | 0.081 |
| 503.3 | 0.085 |
| 503.4 | 0.088 |
| 503.5 | 0.088 |
| 503.6 | 0.089 |
| 503.7 | 0.087 |
| 503.8 | 0.085 |
| 503.9 | 0.08 |
| 504.0 | 0.075 |
| 504.1 | 0.072 |
| 504.2 | 0.069 |
| 504.3 | 0.067 |
| 504.4 | 0.064 |
| 504.5 | 0.062 |
| 504.6 | 0.06 |
| 504.7 | 0.059 |
| 504.8 | 0.058 |
| 504.9 | 0.058 |
| 505.0 | 0.056 |
| 505.1 | 0.056 |
| 505.2 | 0.055 |
| 505.3 | 0.056 |
| 505.4 | 0.055 |
| 505.5 | 0.055 |
| 505.6 | 0.055 |
| 505.7 | 0.056 |
| 505.8 | 0.056 |
| 505.9 | 0.056 |
| 506.0 | 0.057 |
| 506.1 | 0.058 |
| 506.2 | 0.059 |
| 506.3 | 0.06 |
| 506.4 | 0.06 |
| 506.5 | 0.061 |
| 506.6 | 0.062 |
| 506.7 | 0.063 |
| 506.8 | 0.063 |
| 506.9 | 0.063 |
| 507.0 | 0.064 |
| 507.1 | 0.064 |
| 507.2 | 0.064 |
| 507.3 | 0.065 |
| 507.4 | 0.065 |
| 507.5 | 0.067 |
| 507.6 | 0.068 |
| 507.7 | 0.07 |
| 507.8 | 0.072 |
| 507.9 | 0.076 |
| 508.0 | 0.08 |
| 508.1 | 0.087 |
| 508.2 | 0.094 |
| 508.3 | 0.102 |
| 508.4 | 0.11 |
| 508.5 | 0.12 |
| 508.6 | 0.129 |
| 508.7 | 0.136 |
| 508.8 | 0.145 |
| 508.9 | 0.155 |
| 509.0 | 0.167 |
| 509.1 | 0.179 |
| 509.2 | 0.193 |
| 509.3 | 0.206 |
| 509.4 | 0.215 |
| 509.5 | 0.222 |
| 509.6 | 0.226 |
| 509.7 | 0.233 |
| 509.8 | 0.245 |
| 509.9 | 0.267 |
| 510.0 | 0.301 |
| 510.1 | 0.346 |
| 510.2 | 0.397 |
| 510.3 | 0.445 |
| 510.4 | 0.482 |
| 510.5 | 0.498 |
| 510.6 | 0.488 |
| 510.7 | 0.451 |
| 510.8 | 0.401 |
| 510.9 | 0.346 |
| 511.0 | 0.3 |
| 511.1 | 0.264 |
| 511.2 | 0.238 |
| 511.3 | 0.221 |
| 511.4 | 0.213 |
| 511.5 | 0.211 |
| 511.6 | 0.21 |
| 511.7 | 0.21 |
| 511.8 | 0.212 |
| 511.9 | 0.216 |
| 512.0 | 0.222 |
| 512.1 | 0.227 |
| 512.2 | 0.231 |
| 512.3 | 0.234 |
| 512.4 | 0.237 |
| 512.5 | 0.235 |
| 512.6 | 0.229 |
| 512.7 | 0.22 |
| 512.8 | 0.212 |
| 512.9 | 0.205 |
| 513.0 | 0.199 |
| 513.1 | 0.196 |
| 513.2 | 0.197 |
| 513.3 | 0.2 |
| 513.4 | 0.204 |
| 513.5 | 0.208 |
| 513.6 | 0.209 |
| 513.7 | 0.207 |
| 513.8 | 0.203 |
| 513.9 | 0.198 |
| 514.0 | 0.196 |
| 514.1 | 0.195 |
| 514.2 | 0.197 |
| 514.3 | 0.202 |
| 514.4 | 0.21 |
| 514.5 | 0.218 |
| 514.6 | 0.226 |
| 514.7 | 0.231 |
| 514.8 | 0.236 |
| 514.9 | 0.238 |
| 515.0 | 0.24 |
| 515.1 | 0.241 |
| 515.2 | 0.245 |
| 515.3 | 0.249 |
| 515.4 | 0.253 |
| 515.5 | 0.257 |
| 515.6 | 0.255 |
| 515.7 | 0.248 |
| 515.8 | 0.232 |
| 515.9 | 0.212 |
| 516.0 | 0.19 |
| 516.1 | 0.169 |
| 516.2 | 0.151 |
| 516.3 | 0.136 |
| 516.4 | 0.126 |
| 516.5 | 0.119 |
| 516.6 | 0.115 |
| 516.7 | 0.113 |
| 516.8 | 0.111 |
| 516.9 | 0.11 |
| 517.0 | 0.109 |
| 517.1 | 0.11 |
| 517.2 | 0.112 |
| 517.3 | 0.116 |
| 517.4 | 0.122 |
| 517.5 | 0.127 |
| 517.6 | 0.132 |
| 517.7 | 0.135 |
| 517.8 | 0.138 |
| 517.9 | 0.138 |
| 518.0 | 0.134 |
| 518.1 | 0.124 |
| 518.2 | 0.113 |
| 518.3 | 0.103 |
| 518.4 | 0.095 |
| 518.5 | 0.087 |
| 518.6 | 0.082 |
| 518.7 | 0.076 |
| 518.8 | 0.073 |
| 518.9 | 0.071 |
| 519.0 | 0.072 |
| 519.1 | 0.074 |
| 519.2 | 0.077 |
| 519.3 | 0.082 |
| 519.4 | 0.088 |
| 519.5 | 0.096 |
| 519.6 | 0.107 |
| 519.7 | 0.122 |
| 519.8 | 0.143 |
| 519.9 | 0.172 |
| 520.0 | 0.205 |
| 520.1 | 0.237 |
| 520.2 | 0.259 |
| 520.3 | 0.27 |
| 520.4 | 0.266 |
| 520.5 | 0.252 |
| 520.6 | 0.229 |
| 520.7 | 0.203 |
| 520.8 | 0.176 |
| 520.9 | 0.155 |
| 521.0 | 0.139 |
| 521.1 | 0.13 |
| 521.2 | 0.124 |
| 521.3 | 0.121 |
| 521.4 | 0.119 |
| 521.5 | 0.117 |
| 521.6 | 0.111 |
| 521.7 | 0.104 |
| 521.8 | 0.096 |
| 521.9 | 0.09 |
| 522.0 | 0.085 |
| 522.1 | 0.082 |
| 522.2 | 0.081 |
| 522.3 | 0.082 |
| 522.4 | 0.082 |
| 522.5 | 0.081 |
| 522.6 | 0.079 |
| 522.7 | 0.076 |
| 522.8 | 0.075 |
| 522.9 | 0.072 |
| 523.0 | 0.07 |
| 523.1 | 0.067 |
| 523.2 | 0.065 |
| 523.3 | 0.064 |
| 523.4 | 0.062 |
| 523.5 | 0.06 |
| 523.6 | 0.058 |
| 523.7 | 0.056 |
| 523.8 | 0.055 |
| 523.9 | 0.055 |
| 524.0 | 0.055 |
| 524.1 | 0.057 |
| 524.2 | 0.06 |
| 524.3 | 0.062 |
| 524.4 | 0.065 |
| 524.5 | 0.066 |
| 524.6 | 0.07 |
| 524.7 | 0.072 |
| 524.8 | 0.075 |
| 524.9 | 0.078 |
| 525.0 | 0.084 |
| 525.1 | 0.092 |
| 525.2 | 0.104 |
| 525.3 | 0.119 |
| 525.4 | 0.14 |
| 525.5 | 0.175 |
| 525.6 | 0.235 |
| 525.7 | 0.33 |
| 525.8 | 0.458 |
| 525.9 | 0.624 |
| 526.0 | 0.81 |
| 526.1 | 0.992 |
| 526.2 | 1.108 |
| 526.3 | 1.123 |
| 526.4 | 1.036 |
| 526.5 | 0.876 |
| 526.6 | 0.688 |
| 526.7 | 0.52 |
| 526.8 | 0.386 |
| 526.9 | 0.29 |
| 527.0 | 0.223 |
| 527.1 | 0.178 |
| 527.2 | 0.149 |
| 527.3 | 0.125 |
| 527.4 | 0.106 |
| 527.5 | 0.091 |
| 527.6 | 0.079 |
| 527.7 | 0.069 |
| 527.8 | 0.061 |
| 527.9 | 0.057 |
| 528.0 | 0.054 |
| 528.1 | 0.051 |
| 528.2 | 0.048 |
| 528.3 | 0.047 |
| 528.4 | 0.048 |
| 528.5 | 0.048 |
| 528.6 | 0.049 |
| 528.7 | 0.051 |
| 528.8 | 0.055 |
| 528.9 | 0.059 |
| 529.0 | 0.066 |
| 529.1 | 0.074 |
| 529.2 | 0.086 |
| 529.3 | 0.105 |
| 529.4 | 0.128 |
| 529.5 | 0.156 |
| 529.6 | 0.185 |
| 529.7 | 0.215 |
| 529.8 | 0.247 |
| 529.9 | 0.284 |
| 530.0 | 0.341 |
| 530.1 | 0.419 |
| 530.2 | 0.534 |
| 530.3 | 0.686 |
| 530.4 | 0.854 |
| 530.5 | 1 |
| 530.6 | 1.082 |
| 530.7 | 1.107 |
| 530.8 | 1.092 |
| 530.9 | 1.069 |
| 531.0 | 1.054 |
| 531.1 | 1.044 |
| 531.2 | 1.012 |
| 531.3 | 0.932 |
| 531.4 | 0.81 |
| 531.5 | 0.672 |
| 531.6 | 0.557 |
| 531.7 | 0.472 |
| 531.8 | 0.416 |
| 531.9 | 0.37 |
| 532.0 | 0.322 |
| 532.1 | 0.268 |
| 532.2 | 0.208 |
| 532.3 | 0.153 |
| 532.4 | 0.107 |
| 532.5 | 0.077 |
| 532.6 | 0.059 |
| 532.7 | 0.05 |
| 532.8 | 0.044 |
| 532.9 | 0.045 |
| 533.0 | 0.05 |
| 533.1 | 0.061 |
| 533.2 | 0.084 |
| 533.3 | 0.122 |
| 533.4 | 0.173 |
| 533.5 | 0.226 |
| 533.6 | 0.272 |
| 533.7 | 0.302 |
| 533.8 | 0.308 |
| 533.9 | 0.292 |
| 534.0 | 0.258 |
| 534.1 | 0.223 |
| 534.2 | 0.191 |
| 534.3 | 0.168 |
| 534.4 | 0.153 |
| 534.5 | 0.147 |
| 534.6 | 0.144 |
| 534.7 | 0.137 |
| 534.8 | 0.129 |
| 534.9 | 0.116 |
| 535.0 | 0.102 |
| 535.1 | 0.086 |
| 535.2 | 0.074 |
| 535.3 | 0.068 |
| 535.4 | 0.069 |
| 535.5 | 0.078 |
| 535.6 | 0.092 |
| 535.7 | 0.115 |
| 535.8 | 0.144 |
| 535.9 | 0.174 |
| 536.0 | 0.2 |
| 536.1 | 0.22 |
| 536.2 | 0.241 |
| 536.3 | 0.268 |
| 536.4 | 0.304 |
| 536.5 | 0.347 |
| 536.6 | 0.385 |
| 536.7 | 0.408 |
| 536.8 | 0.407 |
| 536.9 | 0.383 |
| 537.0 | 0.341 |
| 537.1 | 0.289 |
| 537.2 | 0.233 |
| 537.3 | 0.179 |
| 537.4 | 0.132 |
| 537.5 | 0.097 |
| 537.6 | 0.072 |
| 537.7 | 0.056 |
| 537.8 | 0.045 |
| 537.9 | 0.036 |
| 538.0 | 0.031 |
| 538.1 | 0.028 |
| 538.2 | 0.026 |
| 538.3 | 0.027 |
| 538.4 | 0.03 |
| 538.5 | 0.038 |
| 538.6 | 0.049 |
| 538.7 | 0.064 |
| 538.8 | 0.079 |
| 538.9 | 0.095 |
| 539.0 | 0.107 |
| 539.1 | 0.115 |
| 539.2 | 0.112 |
| 539.3 | 0.099 |
| 539.4 | 0.081 |
| 539.5 | 0.064 |
| 539.6 | 0.05 |
| 539.7 | 0.038 |
| 539.8 | 0.029 |
| 539.9 | 0.023 |
| 540.0 | 0.018 |
| 540.1 | 0.015 |
| 540.2 | 0.013 |
| 540.3 | 0.011 |
| 540.4 | 0.009 |
| 540.5 | 0.006 |
| 540.6 | 0.005 |
| 540.7 | 0.004 |
| 540.8 | 0.005 |
| 540.9 | 0.006 |
| 541.0 | 0.005 |
| 541.1 | 0.005 |
| 541.2 | 0.004 |
| 541.3 | 0.005 |
| 541.4 | 0.005 |
| 541.5 | 0.006 |
| 541.6 | 0.008 |
| 541.7 | 0.011 |
| 541.8 | 0.014 |
| 541.9 | 0.017 |
| 542.0 | 0.021 |
| 542.1 | 0.025 |
| 542.2 | 0.027 |
| 542.3 | 0.026 |
| 542.4 | 0.025 |
| 542.5 | 0.021 |
| 542.6 | 0.018 |
| 542.7 | 0.015 |
| 542.8 | 0.013 |
| 542.9 | 0.011 |
| 543.0 | 0.009 |
| 543.1 | 0.008 |
| 543.2 | 0.007 |
| 543.3 | 0.005 |
| 543.4 | 0.005 |
| 543.5 | 0.004 |
| 543.6 | 0.003 |
| 543.7 | 0.003 |
| 543.8 | 0.003 |
| 543.9 | 0.003 |
| 544.0 | 0.002 |
| 544.1 | 0.002 |
| 544.2 | 0.002 |
| 544.3 | 0.002 |
| 544.4 | 0.002 |
| 544.5 | 0.002 |
| 544.6 | 0.002 |
| 544.7 | 0.002 |
| 544.8 | 0.002 |
| 544.9 | 0.002 |
| 545.0 | 0.001 |
| 545.1 | 0.001 |
| 545.2 | 0.001 |
| 545.3 | 0.001 |
| 545.4 | 0.001 |
| 545.5 | 0 |
| 545.6 | 0 |
| 545.7 | 0 |
| 545.8 | 0.001 |
| 545.9 | 0 |
| 546.0 | 0 |
| 546.1 | 0 |
| 546.2 | 0 |
| 546.3 | 0.001 |
| 546.4 | 0.001 |
| 546.5 | 0.002 |
| 546.6 | 0.001 |
| 546.7 | 0.002 |
| 546.8 | 0.002 |
| 546.9 | 0.002 |
| 547.0 | 0.002 |
| 547.1 | 0.001 |
| 547.2 | 0.001 |
| 547.3 | 0.001 |
| 547.4 | 0.001 |
| 547.5 | 0 |
| 547.6 | 0 |
| 547.7 | 0.001 |
| 547.8 | 0.001 |
| 547.9 | 0.002 |
| 548.0 | 0.001 |
| 548.1 | 0 |
| 548.2 | 0.003 |
| 548.3 | 0.002 |
| 548.4 | 0 |
| 548.5 | 0.001 |
| 548.6 | 0.001 |
| 548.7 | 0.003 |
| 548.8 | 0.002 |
| 548.9 | 0.002 |
| 549.0 | 0.003 |
| 549.1 | 0 |
| 549.2 | 0.001 |
| 549.3 | 0.001 |
| 549.4 | 0.001 |
| 549.5 | 0 |
| 549.6 | 0.001 |
| 549.7 | 0 |
| 549.8 | 0.001 |
| 549.9 | 0 |
| 550.0 | 0.001 |
| 550.1 | 0.001 |
| 550.2 | 0.001 |
| 550.3 | 0.001 |
| 550.4 | 0.002 |
| 550.5 | 0.001 |
| 550.6 | 0.001 |
| 550.7 | 0 |
| 550.8 | 0.001 |
| 550.9 | 0.002 |
| 551.0 | 0.002 |
| 551.1 | 0.002 |
| 551.2 | 0.002 |
| 551.3 | 0.002 |
| 551.4 | 0.003 |
| 551.5 | 0.003 |
| 551.6 | 0.005 |
| 551.7 | 0.005 |
| 551.8 | 0.006 |
| 551.9 | 0.005 |
| 552.0 | 0.005 |
| 552.1 | 0.004 |
| 552.2 | 0.004 |
| 552.3 | 0.003 |
| 552.4 | 0.004 |
| 552.5 | 0.003 |
| 552.6 | 0.002 |
| 552.7 | 0.001 |
| 552.8 | 0.003 |
| 552.9 | 0.003 |
| 553.0 | 0.003 |
| 553.1 | 0.002 |
| 553.2 | 0.003 |
| 553.3 | 0.003 |
| 553.4 | 0.004 |
| 553.5 | 0.004 |
| 553.6 | 0.004 |
| 553.7 | 0.004 |
| 553.8 | 0.003 |
| 553.9 | 0.002 |
| 554.0 | 0.002 |
| 554.1 | 0.003 |
| 554.2 | 0.003 |
| 554.3 | 0.002 |
| 554.4 | 0.002 |
| 554.5 | 0.003 |
| 554.6 | 0.003 |
| 554.7 | 0.003 |
| 554.8 | 0.004 |
| 554.9 | 0.004 |
| 555.0 | 0.004 |
| 555.1 | 0.005 |
| 555.2 | 0.006 |
| 555.3 | 0.007 |
| 555.4 | 0.007 |
| 555.5 | 0.008 |
| 555.6 | 0.009 |
| 555.7 | 0.009 |
| 555.8 | 0.009 |
| 555.9 | 0.01 |
| 556.0 | 0.01 |
| 556.1 | 0.011 |
| 556.2 | 0.01 |
| 556.3 | 0.01 |
| 556.4 | 0.01 |
| 556.5 | 0.011 |
| 556.6 | 0.012 |
| 556.7 | 0.013 |
| 556.8 | 0.013 |
| 556.9 | 0.012 |
| 557.0 | 0.012 |
| 557.1 | 0.012 |
| 557.2 | 0.012 |
| 557.3 | 0.013 |
| 557.4 | 0.013 |
| 557.5 | 0.014 |
| 557.6 | 0.015 |
| 557.7 | 0.015 |
| 557.8 | 0.016 |
| 557.9 | 0.016 |
| 558.0 | 0.017 |
| 558.1 | 0.018 |
| 558.2 | 0.018 |
| 558.3 | 0.02 |
| 558.4 | 0.022 |
| 558.5 | 0.023 |
| 558.6 | 0.024 |
| 558.7 | 0.025 |
| 558.8 | 0.026 |
| 558.9 | 0.028 |
| 559.0 | 0.027 |
| 559.1 | 0.028 |
| 559.2 | 0.028 |
| 559.3 | 0.028 |
| 559.4 | 0.027 |
| 559.5 | 0.027 |
| 559.6 | 0.027 |
| 559.7 | 0.028 |
| 559.8 | 0.027 |
| 559.9 | 0.028 |
| 560.0 | 0.029 |
| 560.1 | 0.03 |
| 560.2 | 0.031 |
| 560.3 | 0.031 |
| 560.4 | 0.031 |
| 560.5 | 0.031 |
| 560.6 | 0.033 |
| 560.7 | 0.033 |
| 560.8 | 0.034 |
| 560.9 | 0.033 |
| 561.0 | 0.034 |
| 561.1 | 0.034 |
| 561.2 | 0.034 |
| 561.3 | 0.034 |
| 561.4 | 0.034 |
| 561.5 | 0.034 |
| 561.6 | 0.035 |
| 561.7 | 0.034 |
| 561.8 | 0.034 |
| 561.9 | 0.033 |
| 562.0 | 0.033 |
| 562.1 | 0.033 |
| 562.2 | 0.033 |
| 562.3 | 0.034 |
| 562.4 | 0.034 |
| 562.5 | 0.034 |
| 562.6 | 0.034 |
| 562.7 | 0.035 |
| 562.8 | 0.036 |
| 562.9 | 0.035 |
| 563.0 | 0.036 |
| 563.1 | 0.037 |
| 563.2 | 0.038 |
| 563.3 | 0.038 |
| 563.4 | 0.038 |
| 563.5 | 0.039 |
| 563.6 | 0.041 |
| 563.7 | 0.043 |
| 563.8 | 0.044 |
| 563.9 | 0.046 |
| 564.0 | 0.048 |
| 564.1 | 0.049 |
| 564.2 | 0.051 |
| 564.3 | 0.051 |
| 564.4 | 0.052 |
| 564.5 | 0.05 |
| 564.6 | 0.049 |
| 564.7 | 0.048 |
| 564.8 | 0.048 |
| 564.9 | 0.048 |
| 565.0 | 0.048 |
| 565.1 | 0.05 |
| 565.2 | 0.051 |
| 565.3 | 0.052 |
| 565.4 | 0.053 |
| 565.5 | 0.053 |
| 565.6 | 0.054 |
| 565.7 | 0.056 |
| 565.8 | 0.057 |
| 565.9 | 0.058 |
| 566.0 | 0.057 |
| 566.1 | 0.057 |
| 566.2 | 0.056 |
| 566.3 | 0.055 |
| 566.4 | 0.056 |
| 566.5 | 0.056 |
| 566.6 | 0.056 |
| 566.7 | 0.056 |
| 566.8 | 0.056 |
| 566.9 | 0.056 |
| 567.0 | 0.057 |
| 567.1 | 0.058 |
| 567.2 | 0.059 |
| 567.3 | 0.061 |
| 567.4 | 0.062 |
| 567.5 | 0.064 |
| 567.6 | 0.066 |
| 567.7 | 0.068 |
| 567.8 | 0.071 |
| 567.9 | 0.075 |
| 568.0 | 0.079 |
| 568.1 | 0.083 |
| 568.2 | 0.087 |
| 568.3 | 0.092 |
| 568.4 | 0.1 |
| 568.5 | 0.11 |
| 568.6 | 0.122 |
| 568.7 | 0.139 |
| 568.8 | 0.162 |
| 568.9 | 0.192 |
| 569.0 | 0.233 |
| 569.1 | 0.281 |
| 569.2 | 0.344 |
| 569.3 | 0.43 |
| 569.4 | 0.547 |
| 569.5 | 0.691 |
| 569.6 | 0.85 |
| 569.7 | 1.007 |
| 569.8 | 1.134 |
| 569.9 | 1.205 |
| 570.0 | 1.201 |
| 570.1 | 1.133 |
| 570.2 | 1.02 |
| 570.3 | 0.886 |
| 570.4 | 0.75 |
| 570.5 | 0.629 |
| 570.6 | 0.531 |
| 570.7 | 0.449 |
| 570.8 | 0.38 |
| 570.9 | 0.323 |
| 571.0 | 0.277 |
| 571.1 | 0.24 |
| 571.2 | 0.207 |
| 571.3 | 0.18 |
| 571.4 | 0.156 |
| 571.5 | 0.139 |
| 571.6 | 0.126 |
| 571.7 | 0.118 |
| 571.8 | 0.113 |
| 571.9 | 0.11 |
| 572.0 | 0.108 |
| 572.1 | 0.109 |
| 572.2 | 0.109 |
| 572.3 | 0.112 |
| 572.4 | 0.114 |
| 572.5 | 0.118 |
| 572.6 | 0.121 |
| 572.7 | 0.128 |
| 572.8 | 0.135 |
| 572.9 | 0.144 |
| 573.0 | 0.155 |
| 573.1 | 0.168 |
| 573.2 | 0.187 |
| 573.3 | 0.212 |
| 573.4 | 0.247 |
| 573.5 | 0.287 |
| 573.6 | 0.335 |
| 573.7 | 0.39 |
| 573.8 | 0.451 |
| 573.9 | 0.506 |
| 574.0 | 0.546 |
| 574.1 | 0.568 |
| 574.2 | 0.571 |
| 574.3 | 0.555 |
| 574.4 | 0.521 |
| 574.5 | 0.476 |
| 574.6 | 0.423 |
| 574.7 | 0.369 |
| 574.8 | 0.318 |
| 574.9 | 0.272 |
| 575.0 | 0.238 |
| 575.1 | 0.21 |
| 575.2 | 0.188 |
| 575.3 | 0.169 |
| 575.4 | 0.153 |
| 575.5 | 0.143 |
| 575.6 | 0.136 |
| 575.7 | 0.13 |
| 575.8 | 0.126 |
| 575.9 | 0.123 |
| 576.0 | 0.121 |
| 576.1 | 0.12 |
| 576.2 | 0.119 |
| 576.3 | 0.119 |
| 576.4 | 0.12 |
| 576.5 | 0.122 |
| 576.6 | 0.124 |
| 576.7 | 0.125 |
| 576.8 | 0.128 |
| 576.9 | 0.129 |
| 577.0 | 0.128 |
| 577.1 | 0.128 |
| 577.2 | 0.126 |
| 577.3 | 0.124 |
| 577.4 | 0.121 |
| 577.5 | 0.118 |
| 577.6 | 0.116 |
| 577.7 | 0.114 |
| 577.8 | 0.113 |
| 577.9 | 0.112 |
| 578.0 | 0.111 |
| 578.1 | 0.112 |
| 578.2 | 0.114 |
| 578.3 | 0.118 |
| 578.4 | 0.124 |
| 578.5 | 0.133 |
| 578.6 | 0.145 |
| 578.7 | 0.16 |
| 578.8 | 0.178 |
| 578.9 | 0.194 |
| 579.0 | 0.204 |
| 579.1 | 0.205 |
| 579.2 | 0.2 |
| 579.3 | 0.188 |
| 579.4 | 0.174 |
| 579.5 | 0.161 |
| 579.6 | 0.153 |
| 579.7 | 0.151 |
| 579.8 | 0.154 |
| 579.9 | 0.163 |
| 580.0 | 0.175 |
| 580.1 | 0.194 |
| 580.2 | 0.22 |
| 580.3 | 0.257 |
| 580.4 | 0.309 |
| 580.5 | 0.379 |
| 580.6 | 0.474 |
| 580.7 | 0.589 |
| 580.8 | 0.712 |
| 580.9 | 0.814 |
| 581.0 | 0.876 |
| 581.1 | 0.889 |
| 581.2 | 0.851 |
| 581.3 | 0.777 |
| 581.4 | 0.685 |
| 581.5 | 0.588 |
| 581.6 | 0.492 |
| 581.7 | 0.402 |
| 581.8 | 0.326 |
| 581.9 | 0.269 |
| 582.0 | 0.226 |
| 582.1 | 0.192 |
| 582.2 | 0.169 |
| 582.3 | 0.152 |
| 582.4 | 0.143 |
| 582.5 | 0.139 |
| 582.6 | 0.141 |
| 582.7 | 0.145 |
| 582.8 | 0.149 |
| 582.9 | 0.151 |
| 583.0 | 0.15 |
| 583.1 | 0.147 |
| 583.2 | 0.143 |
| 583.3 | 0.136 |
| 583.4 | 0.13 |
| 583.5 | 0.124 |
| 583.6 | 0.119 |
| 583.7 | 0.117 |
| 583.8 | 0.116 |
| 583.9 | 0.117 |
| 584.0 | 0.119 |
| 584.1 | 0.123 |
| 584.2 | 0.13 |
| 584.3 | 0.138 |
| 584.4 | 0.15 |
| 584.5 | 0.166 |
| 584.6 | 0.184 |
| 584.7 | 0.208 |
| 584.8 | 0.233 |
| 584.9 | 0.26 |
| 585.0 | 0.287 |
| 585.1 | 0.316 |
| 585.2 | 0.345 |
| 585.3 | 0.368 |
| 585.4 | 0.385 |
| 585.5 | 0.391 |
| 585.6 | 0.386 |
| 585.7 | 0.366 |
| 585.8 | 0.337 |
| 585.9 | 0.303 |
| 586.0 | 0.268 |
| 586.1 | 0.233 |
| 586.2 | 0.202 |
| 586.3 | 0.179 |
| 586.4 | 0.162 |
| 586.5 | 0.153 |
| 586.6 | 0.149 |
| 586.7 | 0.148 |
| 586.8 | 0.15 |
| 586.9 | 0.154 |
| 587.0 | 0.163 |
| 587.1 | 0.177 |
| 587.2 | 0.195 |
| 587.3 | 0.216 |
| 587.4 | 0.237 |
| 587.5 | 0.257 |
| 587.6 | 0.272 |
| 587.7 | 0.291 |
| 587.8 | 0.325 |
| 587.9 | 0.391 |
| 588.0 | 0.494 |
| 588.1 | 0.619 |
| 588.2 | 0.727 |
| 588.3 | 0.776 |
| 588.4 | 0.736 |
| 588.5 | 0.633 |
| 588.6 | 0.506 |
| 588.7 | 0.407 |
| 588.8 | 0.343 |
| 588.9 | 0.323 |
| 589.0 | 0.336 |
| 589.1 | 0.389 |
| 589.2 | 0.48 |
| 589.3 | 0.636 |
| 589.4 | 0.843 |
| 589.5 | 1.089 |
| 589.6 | 1.306 |
| 589.7 | 1.477 |
| 589.8 | 1.575 |
| 589.9 | 1.601 |
| 590.0 | 1.549 |
| 590.1 | 1.429 |
| 590.2 | 1.254 |
| 590.3 | 1.039 |
| 590.4 | 0.825 |
| 590.5 | 0.638 |
| 590.6 | 0.507 |
| 590.7 | 0.415 |
| 590.8 | 0.356 |
| 590.9 | 0.315 |
| 591.0 | 0.289 |
| 591.1 | 0.276 |
| 591.2 | 0.272 |
| 591.3 | 0.277 |
| 591.4 | 0.294 |
| 591.5 | 0.327 |
| 591.6 | 0.378 |
| 591.7 | 0.447 |
| 591.8 | 0.529 |
| 591.9 | 0.605 |
| 592.0 | 0.659 |
| 592.1 | 0.675 |
| 592.2 | 0.648 |
| 592.3 | 0.576 |
| 592.4 | 0.485 |
| 592.5 | 0.396 |
| 592.6 | 0.329 |
| 592.7 | 0.275 |
| 592.8 | 0.237 |
| 592.9 | 0.215 |
| 593.0 | 0.212 |
| 593.1 | 0.23 |
| 593.2 | 0.272 |
| 593.3 | 0.334 |
| 593.4 | 0.405 |
| 593.5 | 0.466 |
| 593.6 | 0.509 |
| 593.7 | 0.527 |
| 593.8 | 0.521 |
| 593.9 | 0.495 |
| 594.0 | 0.458 |
| 594.1 | 0.423 |
| 594.2 | 0.405 |
| 594.3 | 0.416 |
| 594.4 | 0.459 |
| 594.5 | 0.518 |
| 594.6 | 0.569 |
| 594.7 | 0.583 |
| 594.8 | 0.547 |
| 594.9 | 0.468 |
| 595.0 | 0.366 |
| 595.1 | 0.263 |
| 595.2 | 0.18 |
| 595.3 | 0.124 |
| 595.4 | 0.096 |
| 595.5 | 0.08 |
| 595.6 | 0.075 |
| 595.7 | 0.071 |
| 595.8 | 0.073 |
| 595.9 | 0.077 |
| 596.0 | 0.086 |
| 596.1 | 0.098 |
| 596.2 | 0.109 |
| 596.3 | 0.115 |
| 596.4 | 0.113 |
| 596.5 | 0.104 |
| 596.6 | 0.09 |
| 596.7 | 0.076 |
| 596.8 | 0.065 |
| 596.9 | 0.056 |
| 597.0 | 0.051 |
| 597.1 | 0.048 |
| 597.2 | 0.047 |
| 597.3 | 0.046 |
| 597.4 | 0.047 |
| 597.5 | 0.048 |
| 597.6 | 0.05 |
| 597.7 | 0.054 |
| 597.8 | 0.059 |
| 597.9 | 0.066 |
| 598.0 | 0.074 |
| 598.1 | 0.086 |
| 598.2 | 0.098 |
| 598.3 | 0.112 |
| 598.4 | 0.125 |
| 598.5 | 0.139 |
| 598.6 | 0.151 |
| 598.7 | 0.159 |
| 598.8 | 0.161 |
| 598.9 | 0.155 |
| 599.0 | 0.142 |
| 599.1 | 0.127 |
| 599.2 | 0.112 |
| 599.3 | 0.099 |
| 599.4 | 0.089 |
| 599.5 | 0.083 |
| 599.6 | 0.082 |
| 599.7 | 0.083 |
| 599.8 | 0.086 |
| 599.9 | 0.085 |
| 600.0 | 0.084 |
| 600.1 | 0.08 |
| 600.2 | 0.075 |
| 600.3 | 0.069 |
| 600.4 | 0.064 |
| 600.5 | 0.056 |
| 600.6 | 0.051 |
| 600.7 | 0.045 |
| 600.8 | 0.043 |
| 600.9 | 0.043 |
| 601.0 | 0.047 |
| 601.1 | 0.054 |
| 601.2 | 0.063 |
| 601.3 | 0.069 |
| 601.4 | 0.073 |
| 601.5 | 0.069 |
| 601.6 | 0.062 |
| 601.7 | 0.052 |
| 601.8 | 0.042 |
| 601.9 | 0.034 |
| 602.0 | 0.028 |
| 602.1 | 0.024 |
| 602.2 | 0.024 |
| 602.3 | 0.022 |
| 602.4 | 0.021 |
| 602.5 | 0.02 |
| 602.6 | 0.02 |
| 602.7 | 0.02 |
| 602.8 | 0.02 |
| 602.9 | 0.019 |
| 603.0 | 0.02 |
| 603.1 | 0.019 |
| 603.2 | 0.019 |
| 603.3 | 0.019 |
| 603.4 | 0.018 |
| 603.5 | 0.018 |
| 603.6 | 0.017 |
| 603.7 | 0.017 |
| 603.8 | 0.018 |
| 603.9 | 0.019 |
| 604.0 | 0.019 |
| 604.1 | 0.019 |
| 604.2 | 0.02 |
| 604.3 | 0.022 |
| 604.4 | 0.024 |
| 604.5 | 0.027 |
| 604.6 | 0.033 |
| 604.7 | 0.04 |
| 604.8 | 0.047 |
| 604.9 | 0.054 |
| 605.0 | 0.059 |
| 605.1 | 0.061 |
| 605.2 | 0.06 |
| 605.3 | 0.055 |
| 605.4 | 0.049 |
| 605.5 | 0.041 |
| 605.6 | 0.035 |
| 605.7 | 0.029 |
| 605.8 | 0.026 |
| 605.9 | 0.022 |
| 606.0 | 0.02 |
| 606.1 | 0.018 |
| 606.2 | 0.017 |
| 606.3 | 0.015 |
| 606.4 | 0.014 |
| 606.5 | 0.013 |
| 606.6 | 0.013 |
| 606.7 | 0.012 |
| 606.8 | 0.012 |
| 606.9 | 0.012 |
| 607.0 | 0.012 |
| 607.1 | 0.012 |
| 607.2 | 0.012 |
| 607.3 | 0.012 |
| 607.4 | 0.012 |
| 607.5 | 0.013 |
| 607.6 | 0.014 |
| 607.7 | 0.014 |
| 607.8 | 0.013 |
| 607.9 | 0.012 |
| 608.0 | 0.012 |
| 608.1 | 0.012 |
| 608.2 | 0.012 |
| 608.3 | 0.013 |
| 608.4 | 0.014 |
| 608.5 | 0.013 |
| 608.6 | 0.012 |
| 608.7 | 0.012 |
| 608.8 | 0.013 |
| 608.9 | 0.014 |
| 609.0 | 0.015 |
| 609.1 | 0.016 |
| 609.2 | 0.017 |
| 609.3 | 0.015 |
| 609.4 | 0.016 |
| 609.5 | 0.014 |
| 609.6 | 0.013 |
| 609.7 | 0.012 |
| 609.8 | 0.014 |
| 609.9 | 0.015 |
| 610.0 | 0.015 |
| 610.1 | 0.014 |
| 610.2 | 0.013 |
| 610.3 | 0.014 |
| 610.4 | 0.013 |
| 610.5 | 0.013 |
| 610.6 | 0.011 |
| 610.7 | 0.011 |
| 610.8 | 0.012 |
| 610.9 | 0.011 |
| 611.0 | 0.011 |
| 611.1 | 0.011 |
| 611.2 | 0.011 |
| 611.3 | 0.011 |
| 611.4 | 0.01 |
| 611.5 | 0.011 |
| 611.6 | 0.011 |
| 611.7 | 0.011 |
| 611.8 | 0.011 |
| 611.9 | 0.011 |
| 612.0 | 0.012 |
| 612.1 | 0.011 |
| 612.2 | 0.012 |
| 612.3 | 0.012 |
| 612.4 | 0.012 |
| 612.5 | 0.01 |
| 612.6 | 0.01 |
| 612.7 | 0.011 |
| 612.8 | 0.012 |
| 612.9 | 0.011 |
| 613.0 | 0.01 |
| 613.1 | 0.01 |
| 613.2 | 0.011 |
| 613.3 | 0.011 |
| 613.4 | 0.011 |
| 613.5 | 0.01 |
| 613.6 | 0.01 |
| 613.7 | 0.01 |
| 613.8 | 0.01 |
| 613.9 | 0.011 |
| 614.0 | 0.011 |
| 614.1 | 0.01 |
| 614.2 | 0.009 |
| 614.3 | 0.009 |
| 614.4 | 0.01 |
| 614.5 | 0.009 |
| 614.6 | 0.01 |
| 614.7 | 0.01 |
| 614.8 | 0.011 |
| 614.9 | 0.01 |
| 615.0 | 0.01 |
| 615.1 | 0.009 |
| 615.2 | 0.008 |
| 615.3 | 0.008 |
| 615.4 | 0.008 |
| 615.5 | 0.009 |
| 615.6 | 0.008 |
| 615.7 | 0.007 |
| 615.8 | 0.007 |
| 615.9 | 0.009 |
| 616.0 | 0.01 |
| 616.1 | 0.01 |
| 616.2 | 0.008 |
| 616.3 | 0.007 |
| 616.4 | 0.008 |
| 616.5 | 0.009 |
| 616.6 | 0.01 |
| 616.7 | 0.009 |
| 616.8 | 0.009 |
| 616.9 | 0.009 |
| 617.0 | 0.01 |
| 617.1 | 0.01 |
| 617.2 | 0.01 |
| 617.3 | 0.01 |
| 617.4 | 0.01 |
| 617.5 | 0.01 |
| 617.6 | 0.01 |
| 617.7 | 0.01 |
| 617.8 | 0.01 |
| 617.9 | 0.011 |
| 618.0 | 0.011 |
| 618.1 | 0.011 |
| 618.2 | 0.01 |
| 618.3 | 0.01 |
| 618.4 | 0.009 |
| 618.5 | 0.01 |
| 618.6 | 0.01 |
| 618.7 | 0.01 |
| 618.8 | 0.009 |
| 618.9 | 0.009 |
| 619.0 | 0.01 |
| 619.1 | 0.01 |
| 619.2 | 0.01 |
| 619.3 | 0.01 |
| 619.4 | 0.01 |
| 619.5 | 0.009 |
| 619.6 | 0.01 |
| 619.7 | 0.009 |
| 619.8 | 0.009 |
| 619.9 | 0.009 |
| 620.0 | 0.01 |
| 620.1 | 0.012 |
| 620.2 | 0.012 |
| 620.3 | 0.014 |
| 620.4 | 0.015 |
| 620.5 | 0.016 |
| 620.6 | 0.017 |
| 620.7 | 0.019 |
| 620.8 | 0.022 |
| 620.9 | 0.024 |
| 621.0 | 0.028 |
| 621.1 | 0.032 |
| 621.2 | 0.039 |
| 621.3 | 0.042 |
| 621.4 | 0.043 |
| 621.5 | 0.04 |
| 621.6 | 0.034 |
| 621.7 | 0.028 |
| 621.8 | 0.021 |
| 621.9 | 0.017 |
| 622.0 | 0.014 |
| 622.1 | 0.012 |
| 622.2 | 0.011 |
| 622.3 | 0.012 |
| 622.4 | 0.013 |
| 622.5 | 0.013 |
| 622.6 | 0.012 |
| 622.7 | 0.011 |
| 622.8 | 0.01 |
| 622.9 | 0.011 |
| 623.0 | 0.011 |
| 623.1 | 0.012 |
| 623.2 | 0.012 |
| 623.3 | 0.012 |
| 623.4 | 0.012 |
| 623.5 | 0.011 |
| 623.6 | 0.011 |
| 623.7 | 0.01 |
| 623.8 | 0.011 |
| 623.9 | 0.011 |
| 624.0 | 0.012 |
| 624.1 | 0.012 |
| 624.2 | 0.013 |
| 624.3 | 0.014 |
| 624.4 | 0.015 |
| 624.5 | 0.015 |
| 624.6 | 0.019 |
| 624.7 | 0.022 |
| 624.8 | 0.025 |
| 624.9 | 0.028 |
| 625.0 | 0.036 |
| 625.1 | 0.044 |
| 625.2 | 0.054 |
| 625.3 | 0.061 |
| 625.4 | 0.067 |
| 625.5 | 0.07 |
| 625.6 | 0.071 |
| 625.7 | 0.071 |
| 625.8 | 0.069 |
| 625.9 | 0.066 |
| 626.0 | 0.061 |
| 626.1 | 0.056 |
| 626.2 | 0.051 |
| 626.3 | 0.047 |
| 626.4 | 0.043 |
| 626.5 | 0.041 |
| 626.6 | 0.039 |
| 626.7 | 0.041 |
| 626.8 | 0.044 |
| 626.9 | 0.046 |
| 627.0 | 0.046 |
| 627.1 | 0.044 |
| 627.2 | 0.039 |
| 627.3 | 0.033 |
| 627.4 | 0.026 |
| 627.5 | 0.022 |
| 627.6 | 0.018 |
| 627.7 | 0.017 |
| 627.8 | 0.014 |
| 627.9 | 0.012 |
| 628.0 | 0.011 |
| 628.1 | 0.012 |
| 628.2 | 0.013 |
| 628.3 | 0.014 |
| 628.4 | 0.014 |
| 628.5 | 0.014 |
| 628.6 | 0.015 |
| 628.7 | 0.016 |
| 628.8 | 0.018 |
| 628.9 | 0.018 |
| 629.0 | 0.02 |
| 629.1 | 0.02 |
| 629.2 | 0.02 |
| 629.3 | 0.019 |
| 629.4 | 0.017 |
| 629.5 | 0.015 |
| 629.6 | 0.013 |
| 629.7 | 0.011 |
| 629.8 | 0.012 |
| 629.9 | 0.015 |
| 630.0 | 0.017 |
| 630.1 | 0.019 |
| 630.2 | 0.022 |
| 630.3 | 0.025 |
| 630.4 | 0.028 |
| 630.5 | 0.027 |
| 630.6 | 0.025 |
| 630.7 | 0.02 |
| 630.8 | 0.015 |
| 630.9 | 0.012 |
| 631.0 | 0.012 |
| 631.1 | 0.014 |
| 631.2 | 0.016 |
| 631.3 | 0.02 |
| 631.4 | 0.025 |
| 631.5 | 0.033 |
| 631.6 | 0.04 |
| 631.7 | 0.043 |
| 631.8 | 0.041 |
| 631.9 | 0.035 |
| 632.0 | 0.028 |
| 632.1 | 0.022 |
| 632.2 | 0.019 |
| 632.3 | 0.018 |
| 632.4 | 0.017 |
| 632.5 | 0.016 |
| 632.6 | 0.015 |
| 632.7 | 0.016 |
| 632.8 | 0.016 |
| 632.9 | 0.016 |
| 633.0 | 0.016 |
| 633.1 | 0.016 |
| 633.2 | 0.017 |
| 633.3 | 0.017 |
| 633.4 | 0.015 |
| 633.5 | 0.014 |
| 633.6 | 0.014 |
| 633.7 | 0.015 |
| 633.8 | 0.015 |
| 633.9 | 0.016 |
| 634.0 | 0.016 |
| 634.1 | 0.019 |
| 634.2 | 0.023 |
| 634.3 | 0.027 |
| 634.4 | 0.031 |
| 634.5 | 0.035 |
| 634.6 | 0.039 |
| 634.7 | 0.042 |
| 634.8 | 0.042 |
| 634.9 | 0.043 |
| 635.0 | 0.04 |
| 635.1 | 0.036 |
| 635.2 | 0.032 |
| 635.3 | 0.027 |
| 635.4 | 0.022 |
| 635.5 | 0.018 |
| 635.6 | 0.015 |
| 635.7 | 0.013 |
| 635.8 | 0.011 |
| 635.9 | 0.01 |
| 636.0 | 0.009 |
| 636.1 | 0.01 |
| 636.2 | 0.009 |
| 636.3 | 0.01 |
| 636.4 | 0.01 |
| 636.5 | 0.009 |
| 636.6 | 0.009 |
| 636.7 | 0.008 |
| 636.8 | 0.009 |
| 636.9 | 0.008 |
| 637.0 | 0.008 |
| 637.1 | 0.008 |
| 637.2 | 0.008 |
| 637.3 | 0.009 |
| 637.4 | 0.007 |
| 637.5 | 0.008 |
| 637.6 | 0.008 |
| 637.7 | 0.009 |
| 637.8 | 0.01 |
| 637.9 | 0.011 |
| 638.0 | 0.012 |
| 638.1 | 0.013 |
| 638.2 | 0.013 |
| 638.3 | 0.012 |
| 638.4 | 0.012 |
| 638.5 | 0.013 |
| 638.6 | 0.014 |
| 638.7 | 0.013 |
| 638.8 | 0.012 |
| 638.9 | 0.012 |
| 639.0 | 0.012 |
| 639.1 | 0.013 |
| 639.2 | 0.013 |
| 639.3 | 0.014 |
| 639.4 | 0.013 |
| 639.5 | 0.012 |
| 639.6 | 0.013 |
| 639.7 | 0.013 |
| 639.8 | 0.014 |
| 639.9 | 0.014 |
| 640.0 | 0.014 |
| 640.1 | 0.014 |
| 640.2 | 0.013 |
| 640.3 | 0.012 |
| 640.4 | 0.011 |
| 640.5 | 0.01 |
| 640.6 | 0.011 |
| 640.7 | 0.01 |
| 640.8 | 0.011 |
| 640.9 | 0.009 |
| 641.0 | 0.008 |
| 641.1 | 0.009 |
| 641.2 | 0.008 |
| 641.3 | 0.008 |
| 641.4 | 0.006 |
| 641.5 | 0.006 |
| 641.6 | 0.006 |
| 641.7 | 0.006 |
| 641.8 | 0.007 |
| 641.9 | 0.007 |
| 642.0 | 0.007 |
| 642.1 | 0.008 |
| 642.2 | 0.008 |
| 642.3 | 0.008 |
| 642.4 | 0.007 |
| 642.5 | 0.008 |
| 642.6 | 0.009 |
| 642.7 | 0.01 |
| 642.8 | 0.01 |
| 642.9 | 0.011 |
| 643.0 | 0.011 |
| 643.1 | 0.012 |
| 643.2 | 0.011 |
| 643.3 | 0.01 |
| 643.4 | 0.009 |
| 643.5 | 0.008 |
| 643.6 | 0.007 |
| 643.7 | 0.006 |
| 643.8 | 0.006 |
| 643.9 | 0.006 |
| 644.0 | 0.006 |
| 644.1 | 0.007 |
| 644.2 | 0.007 |
| 644.3 | 0.008 |
| 644.4 | 0.007 |
| 644.5 | 0.007 |
| 644.6 | 0.006 |
| 644.7 | 0.006 |
| 644.8 | 0.006 |
| 644.9 | 0.007 |
| 645.0 | 0.007 |
| 645.1 | 0.008 |
| 645.2 | 0.007 |
| 645.3 | 0.007 |
| 645.4 | 0.006 |
| 645.5 | 0.006 |
| 645.6 | 0.007 |
| 645.7 | 0.006 |
| 645.8 | 0.007 |
| 645.9 | 0.007 |
| 646.0 | 0.007 |
| 646.1 | 0.006 |
| 646.2 | 0.006 |
| 646.3 | 0.007 |
| 646.4 | 0.008 |
| 646.5 | 0.008 |
| 646.6 | 0.007 |
| 646.7 | 0.007 |
| 646.8 | 0.007 |
| 646.9 | 0.006 |
| 647.0 | 0.006 |
| 647.1 | 0.006 |
| 647.2 | 0.007 |
| 647.3 | 0.006 |
| 647.4 | 0.007 |
| 647.5 | 0.008 |
| 647.6 | 0.008 |
| 647.7 | 0.007 |
| 647.8 | 0.006 |
| 647.9 | 0.007 |
| 648.0 | 0.006 |
| 648.1 | 0.007 |
| 648.2 | 0.007 |
| 648.3 | 0.008 |
| 648.4 | 0.007 |
| 648.5 | 0.007 |
| 648.6 | 0.007 |
| 648.7 | 0.007 |
| 648.8 | 0.006 |
| 648.9 | 0.007 |
| 649.0 | 0.006 |
| 649.1 | 0.008 |
| 649.2 | 0.007 |
| 649.3 | 0.007 |
| 649.4 | 0.007 |
| 649.5 | 0.007 |
| 649.6 | 0.006 |
| 649.7 | 0.005 |
| 649.8 | 0.005 |
| 649.9 | 0.007 |
| 650.0 | 0.007 |
| 650.1 | 0.007 |
| 650.2 | 0.006 |
| 650.3 | 0.008 |
| 650.4 | 0.008 |
| 650.5 | 0.008 |
| 650.6 | 0.007 |
| 650.7 | 0.006 |
| 650.8 | 0.005 |
| 650.9 | 0.004 |
| 651.0 | 0.007 |
| 651.1 | 0.006 |
| 651.2 | 0.006 |
| 651.3 | 0.006 |
| 651.4 | 0.006 |
| 651.5 | 0.006 |
| 651.6 | 0.006 |
| 651.7 | 0.007 |
| 651.8 | 0.007 |
| 651.9 | 0.008 |
| 652.0 | 0.007 |
| 652.1 | 0.008 |
| 652.2 | 0.007 |
| 652.3 | 0.007 |
| 652.4 | 0.006 |
| 652.5 | 0.006 |
| 652.6 | 0.007 |
| 652.7 | 0.007 |
| 652.8 | 0.007 |
| 652.9 | 0.005 |
| 653.0 | 0.005 |
| 653.1 | 0.006 |
| 653.2 | 0.008 |
| 653.3 | 0.008 |
| 653.4 | 0.007 |
| 653.5 | 0.007 |
| 653.6 | 0.007 |
| 653.7 | 0.007 |
| 653.8 | 0.005 |
| 653.9 | 0.004 |
| 654.0 | 0.004 |
| 654.1 | 0.003 |
| 654.2 | 0.004 |
| 654.3 | 0.004 |
| 654.4 | 0.004 |
| 654.5 | 0.003 |
| 654.6 | 0.005 |
| 654.7 | 0.003 |
| 654.8 | 0.003 |
| 654.9 | 0.002 |
| 655.0 | 0.005 |
| 655.1 | 0.006 |
| 655.2 | 0.008 |
| 655.3 | 0.008 |
| 655.4 | 0.007 |
| 655.5 | 0.007 |
| 655.6 | 0.007 |
| 655.7 | 0.007 |
| 655.8 | 0.005 |
| 655.9 | 0.004 |
| 656.0 | 0.004 |
| 656.1 | 0.003 |
| 656.2 | 0.004 |
| 656.3 | 0.004 |
| 656.4 | 0.004 |
| 656.5 | 0.003 |
| 656.6 | 0.005 |
| 656.7 | 0.003 |
| 656.8 | 0.003 |
| 656.9 | 0.002 |
| 657.0 | 0.007 |
| 657.1 | 0.005 |
| 657.2 | 0.006 |
| 657.3 | 0.008 |
| 657.4 | 0.008 |
| 657.5 | 0.007 |
| 657.6 | 0.007 |
| 657.7 | 0.007 |
| 657.8 | 0.007 |
| 657.9 | 0.005 |
| 658.0 | 0.004 |
| 658.1 | 0.004 |
| 658.2 | 0.003 |
| 658.3 | 0.004 |
| 658.4 | 0.004 |
| 658.5 | 0.004 |
| 658.6 | 0.003 |
| 658.7 | 0.005 |
| 658.8 | 0.003 |
| 658.9 | 0.003 |
| 659.0 | 0.002 |
| 659.1 | 0.007 |
| 659.2 | 0.007 |
| 659.3 | 0.007 |
| 659.4 | 0.007 |
| 659.5 | 0.007 |
| 659.6 | 0.006 |
| 659.7 | 0.005 |
| 659.8 | 0.005 |
| 659.9 | 0.007 |
| 660.0 | 0.007 |
| 660.1 | 0.007 |
| 660.2 | 0.006 |
| 660.3 | 0.008 |
| 660.4 | 0.008 |
| 660.5 | 0.008 |
| 660.6 | 0.007 |
| 660.7 | 0.006 |
| 660.8 | 0.005 |
| 660.9 | 0.004 |
| 661.0 | 0.007 |
| 661.1 | 0.006 |
| 661.2 | 0.006 |
| 661.3 | 0.006 |
| 661.4 | 0.006 |
| 661.5 | 0.006 |
| 661.6 | 0.006 |
| 661.7 | 0.007 |
| 661.8 | 0.007 |
| 661.9 | 0.008 |
| 662.0 | 0.007 |
| 662.1 | 0.008 |
| 662.2 | 0.007 |
| 662.3 | 0.007 |
| 662.4 | 0.006 |
| 662.5 | 0.006 |
| 662.6 | 0.007 |
| 662.7 | 0.007 |
| 662.8 | 0.007 |
| 662.9 | 0.005 |
| 663.0 | 0.005 |
| 663.1 | 0.006 |
| 663.2 | 0.008 |
| 663.3 | 0.008 |
| 663.4 | 0.005 |
| 663.5 | 0.004 |
| 663.6 | 0.007 |
| 663.7 | 0.006 |
| 663.8 | 0.006 |
| 663.9 | 0.006 |
| 664.0 | 0.006 |
| 664.1 | 0.006 |
| 664.2 | 0.006 |
| 664.3 | 0.007 |
| 664.4 | 0.007 |
| 664.5 | 0.008 |
| 664.6 | 0.007 |
| 664.7 | 0.008 |
| 664.8 | 0.007 |
| 664.9 | 0.007 |
| 665.0 | 0.006 |
| 665.1 | 0.006 |
| 665.2 | 0.007 |
| 665.3 | 0.007 |
| 665.4 | 0.007 |
| 665.5 | 0.005 |
| 665.6 | 0.005 |
| 665.7 | 0.006 |
| 665.8 | 0.008 |
| 665.9 | 0.008 |
| 666.0 | 0.007 |
| 666.1 | 0.007 |
| 666.2 | 0.007 |
| 666.3 | 0.007 |
| 666.4 | 0.005 |
| 666.5 | 0.007 |
| 666.6 | 0 |
| 666.7 | 0.001 |
| 666.8 | 0.001 |
| 666.9 | 0.001 |
| 667.0 | 0.001 |
| 667.1 | 0.003 |
| 667.2 | 0.003 |
| 667.3 | 0.003 |
| 667.4 | 0.003 |
| 667.5 | 0.004 |
| 667.6 | 0.005 |
| 667.7 | 0.005 |
| 667.8 | 0.006 |
| 667.9 | 0.006 |
| 668.0 | 0.006 |
| 668.1 | 0.007 |
| 668.2 | 0.007 |
| 668.3 | 0.008 |
| 668.4 | 0.008 |
| 668.5 | 0.009 |
| 668.6 | 0.008 |
| 668.7 | 0.01 |
| 668.8 | 0.01 |
| 668.9 | 0.012 |
| 669.0 | 0.012 |
| 669.1 | 0.013 |
| 669.2 | 0.014 |
| 669.3 | 0.014 |
| 669.4 | 0.016 |
| 669.5 | 0.018 |
| 669.6 | 0.021 |
| 669.7 | 0.024 |
| 669.8 | 0.028 |
| 669.9 | 0.033 |
| 670.0 | 0.038 |
| 670.1 | 0.044 |
| 670.2 | 0.051 |
| 670.3 | 0.058 |
| 670.4 | 0.066 |
| 670.5 | 0.073 |
| 670.6 | 0.077 |
| 670.7 | 0.078 |
| 670.8 | 0.075 |
| 670.9 | 0.068 |
| 671.0 | 0.059 |
| 671.1 | 0.049 |
| 671.2 | 0.041 |
| 671.3 | 0.032 |
| 671.4 | 0.025 |
| 671.5 | 0.022 |
| 671.6 | 0.02 |
| 671.7 | 0.018 |
| 671.8 | 0.016 |
| 671.9 | 0.014 |
| 672.0 | 0.013 |
| 672.1 | 0.012 |
| 672.2 | 0.011 |
| 672.3 | 0.011 |
| 672.4 | 0.011 |
| 672.5 | 0.012 |
| 672.6 | 0.013 |
| 672.7 | 0.013 |
| 672.8 | 0.013 |
| 672.9 | 0.014 |
| 673.0 | 0.017 |
| 673.1 | 0.018 |
| 673.2 | 0.018 |
| 673.3 | 0.018 |
| 673.4 | 0.019 |
| 673.5 | 0.022 |
| 673.6 | 0.023 |
| 673.7 | 0.024 |
| 673.8 | 0.026 |
| 673.9 | 0.031 |
| 674.0 | 0.035 |
| 674.1 | 0.04 |
| 674.2 | 0.047 |
| 674.3 | 0.058 |
| 674.4 | 0.072 |
| 674.5 | 0.084 |
| 674.6 | 0.094 |
| 674.7 | 0.101 |
| 674.8 | 0.114 |
| 674.9 | 0.135 |
| 675.0 | 0.168 |
| 675.1 | 0.214 |
| 675.2 | 0.263 |
| 675.3 | 0.309 |
| 675.4 | 0.338 |
| 675.5 | 0.346 |
| 675.6 | 0.333 |
| 675.7 | 0.311 |
| 675.8 | 0.285 |
| 675.9 | 0.265 |
| 676.0 | 0.25 |
| 676.1 | 0.238 |
| 676.2 | 0.228 |
| 676.3 | 0.214 |
| 676.4 | 0.2 |
| 676.5 | 0.181 |
| 676.6 | 0.162 |
| 676.7 | 0.142 |
| 676.8 | 0.122 |
| 676.9 | 0.105 |
| 677.0 | 0.086 |
| 677.1 | 0.072 |
| 677.2 | 0.058 |
| 677.3 | 0.048 |
| 677.4 | 0.039 |
| 677.5 | 0.032 |
| 677.6 | 0.028 |
| 677.7 | 0.026 |
| 677.8 | 0.025 |
| 677.9 | 0.024 |
| 678.0 | 0.023 |
| 678.1 | 0.022 |
| 678.2 | 0.022 |
| 678.3 | 0.021 |
| 678.4 | 0.021 |
| 678.5 | 0.023 |
| 678.6 | 0.024 |
| 678.7 | 0.025 |
| 678.8 | 0.026 |
| 678.9 | 0.029 |
| 679.0 | 0.032 |
| 679.1 | 0.036 |
| 679.2 | 0.044 |
| 679.3 | 0.053 |
| 679.4 | 0.066 |
| 679.5 | 0.079 |
| 679.6 | 0.094 |
| 679.7 | 0.11 |
| 679.8 | 0.123 |
| 679.9 | 0.13 |
| 680.0 | 0.131 |
| 680.1 | 0.129 |
| 680.2 | 0.122 |
| 680.3 | 0.114 |
| 680.4 | 0.104 |
| 680.5 | 0.099 |
| 680.6 | 0.099 |
| 680.7 | 0.108 |
| 680.8 | 0.13 |
| 680.9 | 0.165 |
| 681.0 | 0.207 |
| 681.1 | 0.243 |
| 681.2 | 0.261 |
| 681.3 | 0.253 |
| 681.4 | 0.219 |
| 681.5 | 0.176 |
| 681.6 | 0.132 |
| 681.7 | 0.099 |
| 681.8 | 0.074 |
| 681.9 | 0.06 |
| 682.0 | 0.054 |
| 682.1 | 0.057 |
| 682.2 | 0.068 |
| 682.3 | 0.094 |
| 682.4 | 0.135 |
| 682.5 | 0.192 |
| 682.6 | 0.258 |
| 682.7 | 0.32 |
| 682.8 | 0.364 |
| 682.9 | 0.371 |
| 683.0 | 0.344 |
| 683.1 | 0.286 |
| 683.2 | 0.22 |
| 683.3 | 0.16 |
| 683.4 | 0.12 |
| 683.5 | 0.092 |
| 683.6 | 0.074 |
| 683.7 | 0.063 |
| 683.8 | 0.055 |
| 683.9 | 0.051 |
| 684.0 | 0.049 |
| 684.1 | 0.046 |
| 684.2 | 0.044 |
| 684.3 | 0.042 |
| 684.4 | 0.04 |
| 684.5 | 0.036 |
| 684.6 | 0.033 |
| 684.7 | 0.03 |
| 684.8 | 0.026 |
| 684.9 | 0.022 |
| 685.0 | 0.02 |
| 685.1 | 0.02 |
| 685.2 | 0.018 |
| 685.3 | 0.018 |
| 685.4 | 0.017 |
| 685.5 | 0.016 |
| 685.6 | 0.016 |
| 685.7 | 0.018 |
| 685.8 | 0.018 |
| 685.9 | 0.019 |
| 686.0 | 0.022 |
| 686.1 | 0.025 |
| 686.2 | 0.028 |
| 686.3 | 0.03 |
| 686.4 | 0.033 |
| 686.5 | 0.035 |
| 686.6 | 0.035 |
| 686.7 | 0.034 |
| 686.8 | 0.033 |
| 686.9 | 0.031 |
| 687.0 | 0.03 |
| 687.1 | 0.028 |
| 687.2 | 0.025 |
| 687.3 | 0.021 |
| 687.4 | 0.019 |
| 687.5 | 0.019 |
| 687.6 | 0.02 |
| 687.7 | 0.022 |
| 687.8 | 0.022 |
| 687.9 | 0.023 |
| 688.0 | 0.024 |
| 688.1 | 0.026 |
| 688.2 | 0.026 |
| 688.3 | 0.025 |
| 688.4 | 0.025 |
| 688.5 | 0.025 |
| 688.6 | 0.027 |
| 688.7 | 0.026 |
| 688.8 | 0.026 |
| 688.9 | 0.027 |
| 689.0 | 0.026 |
| 689.1 | 0.026 |
| 689.2 | 0.025 |
| 689.3 | 0.025 |
| 689.4 | 0.025 |
| 689.5 | 0.026 |
| 689.6 | 0.028 |
| 689.7 | 0.03 |
| 689.8 | 0.033 |
| 689.9 | 0.039 |
| 690.0 | 0.047 |
| 690.1 | 0.054 |
| 690.2 | 0.058 |
| 690.3 | 0.058 |
| 690.4 | 0.055 |
| 690.5 | 0.048 |
| 690.6 | 0.041 |
| 690.7 | 0.032 |
| 690.8 | 0.025 |
| 690.9 | 0.02 |
| 691.0 | 0.017 |
| 691.1 | 0.016 |
| 691.2 | 0.015 |
| 691.3 | 0.015 |
| 691.4 | 0.015 |
| 691.5 | 0.016 |
| 691.6 | 0.019 |
| 691.7 | 0.023 |
| 691.8 | 0.027 |
| 691.9 | 0.029 |
| 692.0 | 0.03 |
| 692.1 | 0.029 |
| 692.2 | 0.028 |
| 692.3 | 0.024 |
| 692.4 | 0.02 |
| 692.5 | 0.017 |
| 692.6 | 0.015 |
| 692.7 | 0.014 |
| 692.8 | 0.013 |
| 692.9 | 0.01 |
| 693.0 | 0.009 |
| 693.1 | 0.009 |
| 693.2 | 0.011 |
| 693.3 | 0.011 |
| 693.4 | 0.01 |
| 693.5 | 0.01 |
| 693.6 | 0.01 |
| 693.7 | 0.011 |
| 693.8 | 0.01 |
| 693.9 | 0.011 |
| 694.0 | 0.01 |
| 694.1 | 0.01 |
| 694.2 | 0.01 |
| 694.3 | 0.011 |
| 694.4 | 0.012 |
| 694.5 | 0.012 |
| 694.6 | 0.016 |
| 694.7 | 0.019 |
| 694.8 | 0.022 |
| 694.9 | 0.024 |
| 695.0 | 0.026 |
| 695.1 | 0.028 |
| 695.2 | 0.03 |
| 695.3 | 0.028 |
| 695.4 | 0.025 |
| 695.5 | 0.021 |
| 695.6 | 0.019 |
| 695.7 | 0.018 |
| 695.8 | 0.016 |
| 695.9 | 0.015 |
| 696.0 | 0.015 |
| 696.1 | 0.015 |
| 696.2 | 0.015 |
| 696.3 | 0.015 |
| 696.4 | 0.015 |
| 696.5 | 0.014 |
| 696.6 | 0.014 |
| 696.7 | 0.015 |
| 696.8 | 0.016 |
| 696.9 | 0.017 |
| 697.0 | 0.015 |
| 697.1 | 0.016 |
| 697.2 | 0.015 |
| 697.3 | 0.015 |
| 697.4 | 0.013 |
| 697.5 | 0.011 |
| 697.6 | 0.01 |
| 697.7 | 0.01 |
| 697.8 | 0.01 |
| 697.9 | 0.011 |
| 698.0 | 0.012 |
| 698.1 | 0.013 |
| 698.2 | 0.012 |
| 698.3 | 0.01 |
| 698.4 | 0.008 |
| 698.5 | 0.009 |
| 698.6 | 0.01 |
| 698.7 | 0.011 |
| 698.8 | 0.01 |
| 698.9 | 0.01 |
| 699.0 | 0.011 |
| 699.1 | 0.014 |
| 699.2 | 0.011 |
| 699.3 | 0.01 |
| 699.4 | 0.008 |
| 699.5 | 0.011 |
| 699.6 | 0.011 |
| 699.7 | 0.01 |
| 699.8 | 0.009 |
| 699.9 | 0.009 |
| 700.0 | 0.009 |
| 700.1 | 0.009 |
| 700.2 | 0.009 |
| 700.3 | 0.007 |
| 700.4 | 0.006 |
| 700.5 | 0.005 |
| 700.6 | 0.005 |
| 700.7 | 0.006 |
| 700.8 | 0.005 |
| 700.9 | 0.007 |
| 701.0 | 0.006 |
| 701.1 | 0.006 |
| 701.2 | 0.007 |
| 701.3 | 0.007 |
| 701.4 | 0.008 |
| 701.5 | 0.006 |
| 701.6 | 0.007 |
| 701.7 | 0.008 |
| 701.8 | 0.009 |
| 701.9 | 0.01 |
| 702.0 | 0.01 |
| 702.1 | 0.01 |
| 702.2 | 0.01 |
| 702.3 | 0.009 |
| 702.4 | 0.007 |
| 702.5 | 0.007 |
| 702.6 | 0.007 |
| 702.7 | 0.008 |
| 702.8 | 0.007 |
| 702.9 | 0.007 |
| 703.0 | 0.006 |
| 703.1 | 0.007 |
| 703.2 | 0.007 |
| 703.3 | 0.006 |
| 703.4 | 0.005 |
| 703.5 | 0.006 |
| 703.6 | 0.006 |
| 703.7 | 0.007 |
| 703.8 | 0.006 |
| 703.9 | 0.006 |
| 704.0 | 0.006 |
| 704.1 | 0.007 |
| 704.2 | 0.008 |
| 704.3 | 0.009 |
| 704.4 | 0.009 |
| 704.5 | 0.008 |
| 704.6 | 0.008 |
| 704.7 | 0.008 |
| 704.8 | 0.009 |
| 704.9 | 0.009 |
| 705.0 | 0.01 |
| 705.1 | 0.009 |
| 705.2 | 0.009 |
| 705.3 | 0.008 |
| 705.4 | 0.007 |
| 705.5 | 0.007 |
| 705.6 | 0.007 |
| 705.7 | 0.008 |
| 705.8 | 0.008 |
| 705.9 | 0.008 |
| 706.0 | 0.008 |
| 706.1 | 0.009 |
| 706.2 | 0.008 |
| 706.3 | 0.008 |
| 706.4 | 0.008 |
| 706.5 | 0.008 |
| 706.6 | 0.008 |
| 706.7 | 0.007 |
| 706.8 | 0.007 |
| 706.9 | 0.007 |
| 707.0 | 0.006 |
| 707.1 | 0.007 |
| 707.2 | 0.005 |
| 707.3 | 0.006 |
| 707.4 | 0.006 |
| 707.5 | 0.008 |
| 707.6 | 0.008 |
| 707.7 | 0.008 |
| 707.8 | 0.008 |
| 707.9 | 0.008 |
| 708.0 | 0.008 |
| 708.1 | 0.007 |
| 708.2 | 0.007 |
| 708.3 | 0.008 |
| 708.4 | 0.01 |
| 708.5 | 0.01 |
| 708.6 | 0.01 |
| 708.7 | 0.009 |
| 708.8 | 0.008 |
| 708.9 | 0.008 |
| 709.0 | 0.009 |
| 709.1 | 0.01 |
| 709.2 | 0.009 |
| 709.3 | 0.009 |
| 709.4 | 0.008 |
| 709.5 | 0.009 |
| 709.6 | 0.009 |
| 709.7 | 0.008 |
| 709.8 | 0.008 |
| 709.9 | 0.008 |
| 710.0 | 0.009 |
| 710.1 | 0.008 |
| 710.2 | 0.008 |
| 710.3 | 0.008 |
| 710.4 | 0.008 |
| 710.5 | 0.009 |
| 710.6 | 0.009 |
| 710.7 | 0.009 |
| 710.8 | 0.007 |
| 710.9 | 0.006 |
| 711.0 | 0.007 |
| 711.1 | 0.009 |
| 711.2 | 0.009 |
| 711.3 | 0.01 |
| 711.4 | 0.01 |
| 711.5 | 0.011 |
| 711.6 | 0.01 |
| 711.7 | 0.012 |
| 711.8 | 0.012 |
| 711.9 | 0.012 |
| 712.0 | 0.011 |
| 712.1 | 0.01 |
| 712.2 | 0.009 |
| 712.3 | 0.009 |
| 712.4 | 0.009 |
| 712.5 | 0.009 |
| 712.6 | 0.009 |
| 712.7 | 0.009 |
| 712.8 | 0.011 |
| 712.9 | 0.01 |
| 713.0 | 0.01 |
| 713.1 | 0.009 |
| 713.2 | 0.011 |
| 713.3 | 0.011 |
| 713.4 | 0.011 |
| 713.5 | 0.011 |
| 713.6 | 0.01 |
| 713.7 | 0.011 |
| 713.8 | 0.011 |
| 713.9 | 0.013 |
| 714.0 | 0.014 |
| 714.1 | 0.016 |
| 714.2 | 0.014 |
| 714.3 | 0.013 |
| 714.4 | 0.013 |
| 714.5 | 0.013 |
| 714.6 | 0.015 |
| 714.7 | 0.015 |
| 714.8 | 0.016 |
| 714.9 | 0.015 |
| 715.0 | 0.013 |
| 715.1 | 0.013 |
| 715.2 | 0.013 |
| 715.3 | 0.013 |
| 715.4 | 0.012 |
| 715.5 | 0.012 |
| 715.6 | 0.013 |
| 715.7 | 0.015 |
| 715.8 | 0.015 |
| 715.9 | 0.015 |
| 716.0 | 0.013 |
| 716.1 | 0.013 |
| 716.2 | 0.013 |
| 716.3 | 0.013 |
| 716.4 | 0.014 |
| 716.5 | 0.013 |
| 716.6 | 0.013 |
| 716.7 | 0.012 |
| 716.8 | 0.014 |
| 716.9 | 0.014 |
| 717.0 | 0.014 |
| 717.1 | 0.013 |
| 717.2 | 0.016 |
| 717.3 | 0.017 |
| 717.4 | 0.019 |
| 717.5 | 0.019 |
| 717.6 | 0.02 |
| 717.7 | 0.019 |
| 717.8 | 0.019 |
| 717.9 | 0.015 |
| 718.0 | 0.016 |
| 718.1 | 0.015 |
| 718.2 | 0.018 |
| 718.3 | 0.02 |
| 718.4 | 0.021 |
| 718.5 | 0.02 |
| 718.6 | 0.019 |
| 718.7 | 0.019 |
| 718.8 | 0.02 |
| 718.9 | 0.021 |
| 719.0 | 0.022 |
| 719.1 | 0.022 |
| 719.2 | 0.021 |
| 719.3 | 0.021 |
| 719.4 | 0.021 |
| 719.5 | 0.02 |
| 719.6 | 0.019 |
| 719.7 | 0.019 |
| 719.8 | 0.021 |
| 719.9 | 0.022 |
| 720.0 | 0.022 |
| 720.1 | 0.012 |
| 720.2 | 0.013 |
| 720.3 | 0.014 |
| 720.4 | 0.014 |
| 720.5 | 0.015 |
| 720.6 | 0.015 |
| 720.7 | 0.017 |
| 720.8 | 0.017 |
| 720.9 | 0.018 |
| 721.0 | 0.019 |
| 721.1 | 0.021 |
| 721.2 | 0.023 |
| 721.3 | 0.023 |
| 721.4 | 0.023 |
| 721.5 | 0.022 |
| 721.6 | 0.021 |
| 721.7 | 0.021 |
| 721.8 | 0.025 |
| 721.9 | 0.028 |
| 722.0 | 0.029 |
| 722.1 | 0.026 |
| 722.2 | 0.027 |
| 722.3 | 0.027 |
| 722.4 | 0.027 |
| 722.5 | 0.025 |
| 722.6 | 0.023 |
| 722.7 | 0.023 |
| 722.8 | 0.023 |
| 722.9 | 0.024 |
| 723.0 | 0.026 |
| 723.1 | 0.028 |
| 723.2 | 0.029 |
| 723.3 | 0.029 |
| 723.4 | 0.03 |
| 723.5 | 0.028 |
| 723.6 | 0.027 |
| 723.7 | 0.026 |
| 723.8 | 0.027 |
| 723.9 | 0.026 |
| 724.0 | 0.025 |
| 724.1 | 0.027 |
| 724.2 | 0.028 |
| 724.3 | 0.028 |
| 724.4 | 0.029 |
| 724.5 | 0.03 |
| 724.6 | 0.031 |
| 724.7 | 0.032 |
| 724.8 | 0.035 |
| 724.9 | 0.036 |
| 725.0 | 0.037 |
| 725.1 | 0.038 |
| 725.2 | 0.04 |
| 725.3 | 0.039 |
| 725.4 | 0.04 |
| 725.5 | 0.042 |
| 725.6 | 0.043 |
| 725.7 | 0.042 |
| 725.8 | 0.041 |
| 725.9 | 0.043 |
| 726.0 | 0.045 |
| 726.1 | 0.045 |
| 726.2 | 0.046 |
| 726.3 | 0.046 |
| 726.4 | 0.047 |
| 726.5 | 0.047 |
| 726.6 | 0.047 |
| 726.7 | 0.048 |
| 726.8 | 0.05 |
| 726.9 | 0.052 |
| 727.0 | 0.052 |
| 727.1 | 0.051 |
| 727.2 | 0.052 |
| 727.3 | 0.049 |
| 727.4 | 0.051 |
| 727.5 | 0.05 |
| 727.6 | 0.053 |
| 727.7 | 0.052 |
| 727.8 | 0.053 |
| 727.9 | 0.053 |
| 728.0 | 0.054 |
| 728.1 | 0.055 |
| 728.2 | 0.057 |
| 728.3 | 0.06 |
| 728.4 | 0.06 |
| 728.5 | 0.06 |
| 728.6 | 0.062 |
| 728.7 | 0.065 |
| 728.8 | 0.068 |
| 728.9 | 0.072 |
| 729.0 | 0.075 |
| 729.1 | 0.078 |
| 729.2 | 0.081 |
| 729.3 | 0.088 |
| 729.4 | 0.094 |
| 729.5 | 0.099 |
| 729.6 | 0.101 |
| 729.7 | 0.105 |
| 729.8 | 0.109 |
| 729.9 | 0.112 |
| 730.0 | 0.114 |
| 730.1 | 0.118 |
| 730.2 | 0.121 |
| 730.3 | 0.125 |
| 730.4 | 0.126 |
| 730.5 | 0.128 |
| 730.6 | 0.131 |
| 730.7 | 0.136 |
| 730.8 | 0.142 |
| 730.9 | 0.148 |
| 731.0 | 0.154 |
| 731.1 | 0.163 |
| 731.2 | 0.175 |
| 731.3 | 0.191 |
| 731.4 | 0.208 |
| 731.5 | 0.226 |
| 731.6 | 0.25 |
| 731.7 | 0.282 |
| 731.8 | 0.324 |
| 731.9 | 0.376 |
| 732.0 | 0.441 |
| 732.1 | 0.527 |
| 732.2 | 0.633 |
| 732.3 | 0.759 |
| 732.4 | 0.885 |
| 732.5 | 1.01 |
| 732.6 | 1.126 |
| 732.7 | 1.224 |
| 732.8 | 1.289 |
| 732.9 | 1.308 |
| 733.0 | 1.28 |
| 733.1 | 1.204 |
| 733.2 | 1.091 |
| 733.3 | 0.957 |
| 733.4 | 0.832 |
| 733.5 | 0.716 |
| 733.6 | 0.619 |
| 733.7 | 0.534 |
| 733.8 | 0.469 |
| 733.9 | 0.424 |
| 734.0 | 0.396 |
| 734.1 | 0.389 |
| 734.2 | 0.399 |
| 734.3 | 0.434 |
| 734.4 | 0.49 |
| 734.5 | 0.569 |
| 734.6 | 0.659 |
| 734.7 | 0.754 |
| 734.8 | 0.834 |
| 734.9 | 0.884 |
| 735.0 | 0.891 |
| 735.1 | 0.856 |
| 735.2 | 0.792 |
| 735.3 | 0.722 |
| 735.4 | 0.663 |
| 735.5 | 0.632 |
| 735.6 | 0.636 |
| 735.7 | 0.691 |
| 735.8 | 0.795 |
| 735.9 | 0.947 |
| 736.0 | 1.12 |
| 736.1 | 1.275 |
| 736.2 | 1.373 |
| 736.3 | 1.397 |
| 736.4 | 1.352 |
| 736.5 | 1.256 |
| 736.6 | 1.12 |
| 736.7 | 0.969 |
| 736.8 | 0.808 |
| 736.9 | 0.647 |
| 737.0 | 0.503 |
| 737.1 | 0.385 |
| 737.2 | 0.305 |
| 737.3 | 0.25 |
| 737.4 | 0.213 |
| 737.5 | 0.185 |
| 737.6 | 0.163 |
| 737.7 | 0.147 |
| 737.8 | 0.136 |
| 737.9 | 0.128 |
| 738.0 | 0.125 |
| 738.1 | 0.124 |
| 738.2 | 0.125 |
| 738.3 | 0.129 |
| 738.4 | 0.135 |
| 738.5 | 0.142 |
| 738.6 | 0.151 |
| 738.7 | 0.163 |
| 738.8 | 0.183 |
| 738.9 | 0.204 |
| 739.0 | 0.229 |
| 739.1 | 0.252 |
| 739.2 | 0.274 |
| 739.3 | 0.287 |
| 739.4 | 0.294 |
| 739.5 | 0.295 |
| 739.6 | 0.292 |
| 739.7 | 0.285 |
| 739.8 | 0.272 |
| 739.9 | 0.257 |
| 740.0 | 0.242 |
| 740.1 | 0.231 |
| 740.2 | 0.221 |
| 740.3 | 0.213 |
| 740.4 | 0.21 |
| 740.5 | 0.212 |
| 740.6 | 0.22 |
| 740.7 | 0.236 |
| 740.8 | 0.257 |
| 740.9 | 0.285 |
| 741.0 | 0.315 |
| 741.1 | 0.343 |
| 741.2 | 0.366 |
| 741.3 | 0.385 |
| 741.4 | 0.397 |
| 741.5 | 0.404 |
| 741.6 | 0.406 |
| 741.7 | 0.408 |
| 741.8 | 0.409 |
| 741.9 | 0.413 |
| 742.0 | 0.422 |
| 742.1 | 0.441 |
| 742.2 | 0.471 |
| 742.3 | 0.51 |
| 742.4 | 0.562 |
| 742.5 | 0.626 |
| 742.6 | 0.701 |
| 742.7 | 0.779 |
| 742.8 | 0.848 |
| 742.9 | 0.908 |
| 743.0 | 0.949 |
| 743.1 | 0.971 |
| 743.2 | 0.971 |
| 743.3 | 0.954 |
| 743.4 | 0.926 |
| 743.5 | 0.893 |
| 743.6 | 0.858 |
| 743.7 | 0.828 |
| 743.8 | 0.8 |
| 743.9 | 0.776 |
| 744.0 | 0.75 |
| 744.1 | 0.72 |
| 744.2 | 0.676 |
| 744.3 | 0.615 |
| 744.4 | 0.538 |
| 744.5 | 0.461 |
| 744.6 | 0.393 |
| 744.7 | 0.339 |
| 744.8 | 0.296 |
| 744.9 | 0.267 |
| 745.0 | 0.248 |
| 745.1 | 0.239 |
| 745.2 | 0.239 |
| 745.3 | 0.247 |
| 745.4 | 0.261 |
| 745.5 | 0.274 |
| 745.6 | 0.293 |
| 745.7 | 0.314 |
| 745.8 | 0.333 |
| 745.9 | 0.349 |
| 746.0 | 0.361 |
| 746.1 | 0.374 |
| 746.2 | 0.39 |
| 746.3 | 0.412 |
| 746.4 | 0.445 |
| 746.5 | 0.494 |
| 746.6 | 0.559 |
| 746.7 | 0.642 |
| 746.8 | 0.737 |
| 746.9 | 0.852 |
| 747.0 | 0.984 |
| 747.1 | 1.124 |
| 747.2 | 1.262 |
| 747.3 | 1.379 |
| 747.4 | 1.472 |
| 747.5 | 1.532 |
| 747.6 | 1.563 |
| 747.7 | 1.565 |
| 747.8 | 1.538 |
| 747.9 | 1.479 |
| 748.0 | 1.383 |
| 748.1 | 1.268 |
| 748.2 | 1.14 |
| 748.3 | 1.009 |
| 748.4 | 0.877 |
| 748.5 | 0.753 |
| 748.6 | 0.646 |
| 748.7 | 0.549 |
| 748.8 | 0.465 |
| 748.9 | 0.396 |
| 749.0 | 0.348 |
| 749.1 | 0.315 |
| 749.2 | 0.289 |
| 749.3 | 0.269 |
| 749.4 | 0.252 |
| 749.5 | 0.241 |
| 749.6 | 0.232 |
| 749.7 | 0.226 |
| 749.8 | 0.223 |
| 749.9 | 0.222 |
| 750.0 | 0.225 |
| 750.1 | 0.231 |
| 750.2 | 0.247 |
| 750.3 | 0.268 |
| 750.4 | 0.296 |
| 750.5 | 0.327 |
| 750.6 | 0.362 |
| 750.7 | 0.394 |
| 750.8 | 0.423 |
| 750.9 | 0.446 |
| 751.0 | 0.463 |
| 751.1 | 0.475 |
| 751.2 | 0.483 |
| 751.3 | 0.487 |
| 751.4 | 0.488 |
| 751.5 | 0.483 |
| 751.6 | 0.473 |
| 751.7 | 0.46 |
| 751.8 | 0.444 |
| 751.9 | 0.426 |
| 752.0 | 0.406 |
| 752.1 | 0.386 |
| 752.2 | 0.366 |
| 752.3 | 0.35 |
| 752.4 | 0.34 |
| 752.5 | 0.338 |
| 752.6 | 0.344 |
| 752.7 | 0.355 |
| 752.8 | 0.372 |
| 752.9 | 0.392 |
| 753.0 | 0.413 |
| 753.1 | 0.431 |
| 753.2 | 0.444 |
| 753.3 | 0.452 |
| 753.4 | 0.453 |
| 753.5 | 0.449 |
| 753.6 | 0.44 |
| 753.7 | 0.432 |
| 753.8 | 0.425 |
| 753.9 | 0.422 |
| 754.0 | 0.425 |
| 754.1 | 0.43 |
| 754.2 | 0.436 |
| 754.3 | 0.44 |
| 754.4 | 0.445 |
| 754.5 | 0.451 |
| 754.6 | 0.455 |
| 754.7 | 0.461 |
| 754.8 | 0.469 |
| 754.9 | 0.482 |
| 755.0 | 0.498 |
| 755.1 | 0.514 |
| 755.2 | 0.522 |
| 755.3 | 0.516 |
| 755.4 | 0.496 |
| 755.5 | 0.461 |
| 755.6 | 0.415 |
| 755.7 | 0.358 |
| 755.8 | 0.301 |
| 755.9 | 0.252 |
| 756.0 | 0.218 |
| 756.1 | 0.193 |
| 756.2 | 0.173 |
| 756.3 | 0.156 |
| 756.4 | 0.141 |
| 756.5 | 0.13 |
| 756.6 | 0.122 |
| 756.7 | 0.117 |
| 756.8 | 0.115 |
| 756.9 | 0.114 |
| 757.0 | 0.115 |
| 757.1 | 0.117 |
| 757.2 | 0.122 |
| 757.3 | 0.129 |
| 757.4 | 0.136 |
| 757.5 | 0.149 |
| 757.6 | 0.162 |
| 757.7 | 0.18 |
| 757.8 | 0.2 |
| 757.9 | 0.226 |
| 758.0 | 0.256 |
| 758.1 | 0.293 |
| 758.2 | 0.337 |
| 758.3 | 0.394 |
| 758.4 | 0.466 |
| 758.5 | 0.551 |
| 758.6 | 0.635 |
| 758.7 | 0.708 |
| 758.8 | 0.756 |
| 758.9 | 0.777 |
| 759.0 | 0.761 |
| 759.1 | 0.717 |
| 759.2 | 0.647 |
| 759.3 | 0.562 |
| 759.4 | 0.474 |
| 759.5 | 0.394 |
| 759.6 | 0.334 |
| 759.7 | 0.285 |
| 759.8 | 0.246 |
| 759.9 | 0.212 |
| 760.0 | 0.189 |
| 760.1 | 0.167 |
| 760.2 | 0.15 |
| 760.3 | 0.138 |
| 760.4 | 0.133 |
| 760.5 | 0.132 |
| 760.6 | 0.13 |
| 760.7 | 0.13 |
| 760.8 | 0.133 |
| 760.9 | 0.138 |
| 761.0 | 0.146 |
| 761.1 | 0.156 |
| 761.2 | 0.163 |
| 761.3 | 0.167 |
| 761.4 | 0.167 |
| 761.5 | 0.168 |
| 761.6 | 0.166 |
| 761.7 | 0.16 |
| 761.8 | 0.151 |
| 761.9 | 0.142 |
| 762.0 | 0.134 |
| 762.1 | 0.124 |
| 762.2 | 0.115 |
| 762.3 | 0.107 |
| 762.4 | 0.103 |
| 762.5 | 0.095 |
| 762.6 | 0.089 |
| 762.7 | 0.083 |
| 762.8 | 0.08 |
| 762.9 | 0.076 |
| 763.0 | 0.072 |
| 763.1 | 0.068 |
| 763.2 | 0.065 |
| 763.3 | 0.065 |
| 763.4 | 0.063 |
| 763.5 | 0.061 |
| 763.6 | 0.058 |
| 763.7 | 0.056 |
| 763.8 | 0.057 |
| 763.9 | 0.057 |
| 764.0 | 0.057 |
| 764.1 | 0.057 |
| 764.2 | 0.058 |
| 764.3 | 0.062 |
| 764.4 | 0.067 |
| 764.5 | 0.07 |
| 764.6 | 0.075 |
| 764.7 | 0.079 |
| 764.8 | 0.087 |
| 764.9 | 0.092 |
| 765.0 | 0.098 |
| 765.1 | 0.102 |
| 765.2 | 0.106 |
| 765.3 | 0.106 |
| 765.4 | 0.105 |
| 765.5 | 0.103 |
| 765.6 | 0.098 |
| 765.7 | 0.089 |
| 765.8 | 0.082 |
| 765.9 | 0.077 |
| 766.0 | 0.074 |
| 766.1 | 0.07 |
| 766.2 | 0.067 |
| 766.3 | 0.064 |
| 766.4 | 0.063 |
| 766.5 | 0.06 |
| 766.6 | 0.057 |
| 766.7 | 0.053 |
| 766.8 | 0.05 |
| 766.9 | 0.048 |
| 767.0 | 0.047 |
| 767.1 | 0.046 |
| 767.2 | 0.046 |
| 767.3 | 0.044 |
| 767.4 | 0.041 |
| 767.5 | 0.038 |
| 767.6 | 0.036 |
| 767.7 | 0.035 |
| 767.8 | 0.032 |
| 767.9 | 0.03 |
| 768.0 | 0.03 |
| 768.1 | 0.028 |
| 768.2 | 0.03 |
| 768.3 | 0.027 |
| 768.4 | 0.028 |
| 768.5 | 0.025 |
| 768.6 | 0.025 |
| 768.7 | 0.023 |
| 768.8 | 0.023 |
| 768.9 | 0.02 |
| 769.0 | 0.023 |
| 769.1 | 0.021 |
| 769.2 | 0.023 |
| 769.3 | 0.023 |
| 769.4 | 0.025 |
| 769.5 | 0.026 |
| 769.6 | 0.024 |
| 769.7 | 0.026 |
| 769.8 | 0.027 |
| 769.9 | 0.03 |
| 770.0 | 0.03 |
| 770.1 | 0.03 |
| 770.2 | 0.032 |
| 770.3 | 0.031 |
| 770.4 | 0.03 |
| 770.5 | 0.032 |
| 770.6 | 0.033 |
| 770.7 | 0.035 |
| 770.8 | 0.035 |
| 770.9 | 0.037 |
| 771.0 | 0.038 |
| 771.1 | 0.038 |
| 771.2 | 0.037 |
| 771.3 | 0.037 |
| 771.4 | 0.04 |
| 771.5 | 0.04 |
| 771.6 | 0.041 |
| 771.7 | 0.04 |
| 771.8 | 0.042 |
| 771.9 | 0.044 |
| 772.0 | 0.046 |
| 772.1 | 0.046 |
| 772.2 | 0.045 |
| 772.3 | 0.047 |
| 772.4 | 0.046 |
| 772.5 | 0.048 |
| 772.6 | 0.045 |
| 772.7 | 0.046 |
| 772.8 | 0.047 |
| 772.9 | 0.05 |
| 773.0 | 0.05 |
| 773.1 | 0.05 |
| 773.2 | 0.049 |
| 773.3 | 0.051 |
| 773.4 | 0.05 |
| 773.5 | 0.048 |
| 773.6 | 0.045 |
| 773.7 | 0.047 |
| 773.8 | 0.048 |
| 773.9 | 0.049 |
| 774.0 | 0.048 |
| 774.1 | 0.049 |
| 774.2 | 0.049 |
| 774.3 | 0.05 |
| 774.4 | 0.051 |
| 774.5 | 0.054 |
| 774.6 | 0.055 |
| 774.7 | 0.055 |
| 774.8 | 0.053 |
| 774.9 | 0.056 |
| 775.0 | 0.056 |
| 775.1 | 0.059 |
| 775.2 | 0.059 |
| 775.3 | 0.061 |
| 775.4 | 0.061 |
| 775.5 | 0.064 |
| 775.6 | 0.069 |
| 775.7 | 0.07 |
| 775.8 | 0.074 |
| 775.9 | 0.077 |
| 776.0 | 0.08 |
| 776.1 | 0.085 |
| 776.2 | 0.091 |
| 776.3 | 0.102 |
| 776.4 | 0.113 |
| 776.5 | 0.127 |
| 776.6 | 0.143 |
| 776.7 | 0.161 |
| 776.8 | 0.183 |
| 776.9 | 0.213 |
| 777.0 | 0.248 |
| 777.1 | 0.279 |
| 777.2 | 0.305 |
| 777.3 | 0.323 |
| 777.4 | 0.335 |
| 777.5 | 0.337 |
| 777.6 | 0.332 |
| 777.7 | 0.317 |
| 777.8 | 0.301 |
| 777.9 | 0.284 |
| 778.0 | 0.269 |
| 778.1 | 0.255 |
| 778.2 | 0.241 |
| 778.3 | 0.231 |
| 778.4 | 0.221 |
| 778.5 | 0.213 |
| 778.6 | 0.205 |
| 778.7 | 0.195 |
| 778.8 | 0.185 |
| 778.9 | 0.176 |
| 779.0 | 0.167 |
| 779.1 | 0.158 |
| 779.2 | 0.149 |
| 779.3 | 0.139 |
| 779.4 | 0.13 |
| 779.5 | 0.124 |
| 779.6 | 0.118 |
| 779.7 | 0.114 |
| 779.8 | 0.11 |
| 779.9 | 0.105 |
| 780.0 | 0.1 |
| 780.1 | 0.094 |
| 780.2 | 0.091 |
| 780.3 | 0.088 |
| 780.4 | 0.085 |
| 780.5 | 0.083 |
| 780.6 | 0.081 |
| 780.7 | 0.081 |
| 780.8 | 0.081 |
| 780.9 | 0.081 |
| 781.0 | 0.079 |
| 781.1 | 0.078 |
| 781.2 | 0.076 |
| 781.3 | 0.075 |
| 781.4 | 0.074 |
| 781.5 | 0.075 |
| 781.6 | 0.074 |
| 781.7 | 0.073 |
| 781.8 | 0.073 |
| 781.9 | 0.075 |
| 782.0 | 0.073 |
| 782.1 | 0.073 |
| 782.2 | 0.073 |
| 782.3 | 0.073 |
| 782.4 | 0.074 |
| 782.5 | 0.073 |
| 782.6 | 0.074 |
| 782.7 | 0.075 |
| 782.8 | 0.076 |
| 782.9 | 0.075 |
| 783.0 | 0.075 |
| 783.1 | 0.075 |
| 783.2 | 0.077 |
| 783.3 | 0.078 |
| 783.4 | 0.08 |
| 783.5 | 0.081 |
| 783.6 | 0.083 |
| 783.7 | 0.083 |
| 783.8 | 0.085 |
| 783.9 | 0.085 |
| 784.0 | 0.089 |
| 784.1 | 0.091 |
| 784.2 | 0.096 |
| 784.3 | 0.098 |
| 784.4 | 0.102 |
| 784.5 | 0.106 |
| 784.6 | 0.109 |
| 784.7 | 0.114 |
| 784.8 | 0.119 |
| 784.9 | 0.126 |
| 785.0 | 0.132 |
| 785.1 | 0.137 |
| 785.2 | 0.144 |
| 785.3 | 0.151 |
| 785.4 | 0.156 |
| 785.5 | 0.162 |
| 785.6 | 0.167 |
| 785.7 | 0.169 |
| 785.8 | 0.167 |
| 785.9 | 0.166 |
| 786.0 | 0.164 |
| 786.1 | 0.162 |
| 786.2 | 0.158 |
| 786.3 | 0.155 |
| 786.4 | 0.151 |
| 786.5 | 0.147 |
| 786.6 | 0.142 |
| 786.7 | 0.137 |
| 786.8 | 0.132 |
| 786.9 | 0.125 |
| 787.0 | 0.122 |
| 787.1 | 0.117 |
| 787.2 | 0.114 |
| 787.3 | 0.109 |
| 787.4 | 0.104 |
| 787.5 | 0.1 |
| 787.6 | 0.099 |
| 787.7 | 0.098 |
| 787.8 | 0.095 |
| 787.9 | 0.091 |
| 788.0 | 0.086 |
| 788.1 | 0.086 |
| 788.2 | 0.085 |
| 788.3 | 0.088 |
| 788.4 | 0.089 |
| 788.5 | 0.09 |
| 788.6 | 0.094 |
| 788.7 | 0.097 |
| 788.8 | 0.097 |
| 788.9 | 0.1 |
| 789.0 | 0.103 |
| 789.1 | 0.111 |
| 789.2 | 0.114 |
| 789.3 | 0.119 |
| 789.4 | 0.119 |
| 789.5 | 0.121 |
| 789.6 | 0.123 |
| 789.7 | 0.126 |
| 789.8 | 0.127 |
| 789.9 | 0.129 |
| 790.0 | 0.135 |
| 790.1 | 0.141 |
| 790.2 | 0.148 |
| 790.3 | 0.154 |
| 790.4 | 0.165 |
| 790.5 | 0.177 |
| 790.6 | 0.192 |
| 790.7 | 0.208 |
| 790.8 | 0.23 |
| 790.9 | 0.261 |
| 791.0 | 0.302 |
| 791.1 | 0.352 |
| 791.2 | 0.418 |
| 791.3 | 0.502 |
| 791.4 | 0.589 |
| 791.5 | 0.656 |
| 791.6 | 0.687 |
| 791.7 | 0.678 |
| 791.8 | 0.637 |
| 791.9 | 0.576 |
| 792.0 | 0.514 |
| 792.1 | 0.465 |
| 792.2 | 0.441 |
| 792.3 | 0.445 |
| 792.4 | 0.479 |
| 792.5 | 0.54 |
| 792.6 | 0.622 |
| 792.7 | 0.72 |
| 792.8 | 0.819 |
| 792.9 | 0.901 |
| 793.0 | 0.946 |
| 793.1 | 0.934 |
| 793.2 | 0.864 |
| 793.3 | 0.762 |
| 793.4 | 0.655 |
| 793.5 | 0.559 |
| 793.6 | 0.48 |
| 793.7 | 0.422 |
| 793.8 | 0.391 |
| 793.9 | 0.385 |
| 794.0 | 0.399 |
| 794.1 | 0.433 |
| 794.2 | 0.482 |
| 794.3 | 0.551 |
| 794.4 | 0.65 |
| 794.5 | 0.778 |
| 794.6 | 0.926 |
| 794.7 | 1.076 |
| 794.8 | 1.209 |
| 794.9 | 1.296 |
| 795.0 | 1.31 |
| 795.1 | 1.249 |
| 795.2 | 1.125 |
| 795.3 | 0.964 |
| 795.4 | 0.798 |
| 795.5 | 0.649 |
| 795.6 | 0.518 |
| 795.7 | 0.411 |
| 795.8 | 0.332 |
| 795.9 | 0.283 |
| 796.0 | 0.247 |
| 796.1 | 0.219 |
| 796.2 | 0.196 |
| 796.3 | 0.182 |
| 796.4 | 0.171 |
| 796.5 | 0.165 |
| 796.6 | 0.158 |
| 796.7 | 0.154 |
| 796.8 | 0.155 |
| 796.9 | 0.155 |
| 797.0 | 0.16 |
| 797.1 | 0.159 |
| 797.2 | 0.16 |
| 797.3 | 0.159 |
| 797.4 | 0.161 |
| 797.5 | 0.166 |
| 797.6 | 0.17 |
| 797.7 | 0.178 |
| 797.8 | 0.192 |
| 797.9 | 0.218 |
| 798.0 | 0.259 |
| 798.1 | 0.316 |
| 798.2 | 0.4 |
| 798.3 | 0.502 |
| 798.4 | 0.617 |
| 798.5 | 0.717 |
| 798.6 | 0.788 |
| 798.7 | 0.809 |
| 798.8 | 0.773 |
| 798.9 | 0.699 |
| 799.0 | 0.599 |
| 799.1 | 0.496 |
| 799.2 | 0.4 |
| 799.3 | 0.328 |
| 799.4 | 0.281 |
| 799.5 | 0.247 |
| 799.6 | 0.217 |
| 799.7 | 0.196 |
| 799.8 | 0.179 |
| 799.9 | 0.166 |
| 800.0 | 0.156 |
| 800.1 | 0.149 |
| 800.2 | 0.148 |
| 800.3 | 0.146 |
| 800.4 | 0.145 |
| 800.5 | 0.144 |
| 800.6 | 0.142 |
| 800.7 | 0.141 |
| 800.8 | 0.143 |
| 800.9 | 0.145 |
| 801.0 | 0.147 |
| 801.1 | 0.148 |
| 801.2 | 0.151 |
| 801.3 | 0.153 |
| 801.4 | 0.159 |
| 801.5 | 0.169 |
| 801.6 | 0.188 |
| 801.7 | 0.214 |
| 801.8 | 0.248 |
| 801.9 | 0.28 |
| 802.0 | 0.313 |
| 802.1 | 0.346 |
| 802.2 | 0.38 |
| 802.3 | 0.407 |
| 802.4 | 0.422 |
| 802.5 | 0.426 |
| 802.6 | 0.424 |
| 802.7 | 0.423 |
| 802.8 | 0.42 |
| 802.9 | 0.417 |
| 803.0 | 0.414 |
| 803.1 | 0.411 |
| 803.2 | 0.41 |
| 803.3 | 0.41 |
| 803.4 | 0.419 |
| 803.5 | 0.442 |
| 803.6 | 0.477 |
| 803.7 | 0.523 |
| 803.8 | 0.581 |
| 803.9 | 0.654 |
| 804.0 | 0.739 |
| 804.1 | 0.836 |
| 804.2 | 0.935 |
| 804.3 | 1.026 |
| 804.4 | 1.091 |
| 804.5 | 1.122 |
| 804.6 | 1.116 |
| 804.7 | 1.076 |
| 804.8 | 1.009 |
| 804.9 | 0.924 |
| 805.0 | 0.839 |
| 805.1 | 0.767 |
| 805.2 | 0.725 |
| 805.3 | 0.713 |
| 805.4 | 0.724 |
| 805.5 | 0.753 |
| 805.6 | 0.795 |
| 805.7 | 0.845 |
| 805.8 | 0.895 |
| 805.9 | 0.937 |
| 806.0 | 0.974 |
| 806.1 | 1.002 |
| 806.2 | 1.018 |
| 806.3 | 1.02 |
| 806.4 | 1.013 |
| 806.5 | 1.002 |
| 806.6 | 0.986 |
| 806.7 | 0.971 |
| 806.8 | 0.958 |
| 806.9 | 0.948 |
| 807.0 | 0.942 |
| 807.1 | 0.947 |
| 807.2 | 0.97 |
| 807.3 | 1.02 |
| 807.4 | 1.094 |
| 807.5 | 1.194 |
| 807.6 | 1.301 |
| 807.7 | 1.406 |
| 807.8 | 1.492 |
| 807.9 | 1.552 |
| 808.0 | 1.58 |
| 808.1 | 1.574 |
| 808.2 | 1.535 |
| 808.3 | 1.468 |
| 808.4 | 1.37 |
| 808.5 | 1.254 |
| 808.6 | 1.12 |
| 808.7 | 0.979 |
| 808.8 | 0.834 |
| 808.9 | 0.707 |
| 809.0 | 0.604 |
| 809.1 | 0.524 |
| 809.2 | 0.458 |
| 809.3 | 0.401 |
| 809.4 | 0.359 |
| 809.5 | 0.325 |
| 809.6 | 0.298 |
| 809.7 | 0.278 |
| 809.8 | 0.268 |
| 809.9 | 0.262 |
| 810.0 | 0.26 |
| 810.1 | 0.259 |
| 810.2 | 0.268 |
| 810.3 | 0.278 |
| 810.4 | 0.296 |
| 810.5 | 0.317 |
| 810.6 | 0.344 |
| 810.7 | 0.377 |
| 810.8 | 0.407 |
| 810.9 | 0.441 |
| 811.0 | 0.469 |
| 811.1 | 0.5 |
| 811.2 | 0.526 |
| 811.3 | 0.548 |
| 811.4 | 0.564 |
| 811.5 | 0.576 |
| 811.6 | 0.592 |
| 811.7 | 0.615 |
| 811.8 | 0.649 |
| 811.9 | 0.696 |
| 812.0 | 0.759 |
| 812.1 | 0.83 |
| 812.2 | 0.908 |
| 812.3 | 0.98 |
| 812.4 | 1.04 |
| 812.5 | 1.074 |
| 812.6 | 1.087 |
| 812.7 | 1.077 |
| 812.8 | 1.058 |
| 812.9 | 1.025 |
| 813.0 | 0.99 |
| 813.1 | 0.939 |
| 813.2 | 0.874 |
| 813.3 | 0.794 |
| 813.4 | 0.704 |
| 813.5 | 0.615 |
| 813.6 | 0.529 |
| 813.7 | 0.45 |
| 813.8 | 0.373 |
| 813.9 | 0.309 |
| 814.0 | 0.259 |
| 814.1 | 0.224 |
| 814.2 | 0.198 |
| 814.3 | 0.18 |
| 814.4 | 0.171 |
| 814.5 | 0.165 |
| 814.6 | 0.161 |
| 814.7 | 0.159 |
| 814.8 | 0.158 |
| 814.9 | 0.158 |
| 815.0 | 0.165 |
| 815.1 | 0.178 |
| 815.2 | 0.198 |
| 815.3 | 0.219 |
| 815.4 | 0.243 |
| 815.5 | 0.27 |
| 815.6 | 0.296 |
| 815.7 | 0.317 |
| 815.8 | 0.329 |
| 815.9 | 0.331 |
| 816.0 | 0.322 |
| 816.1 | 0.308 |
| 816.2 | 0.29 |
| 816.3 | 0.273 |
| 816.4 | 0.256 |
| 816.5 | 0.238 |
| 816.6 | 0.222 |
| 816.7 | 0.21 |
| 816.8 | 0.204 |
| 816.9 | 0.205 |
| 817.0 | 0.215 |
| 817.1 | 0.237 |
| 817.2 | 0.269 |
| 817.3 | 0.31 |
| 817.4 | 0.352 |
| 817.5 | 0.389 |
| 817.6 | 0.41 |
| 817.7 | 0.407 |
| 817.8 | 0.379 |
| 817.9 | 0.327 |
| 818.0 | 0.267 |
| 818.1 | 0.215 |
| 818.2 | 0.178 |
| 818.3 | 0.152 |
| 818.4 | 0.132 |
| 818.5 | 0.117 |
| 818.6 | 0.107 |
| 818.7 | 0.099 |
| 818.8 | 0.092 |
| 818.9 | 0.087 |
| 819.0 | 0.086 |
| 819.1 | 0.088 |
| 819.2 | 0.09 |
| 819.3 | 0.093 |
| 819.4 | 0.099 |
| 819.5 | 0.107 |
| 819.6 | 0.118 |
| 819.7 | 0.129 |
| 819.8 | 0.146 |
| 819.9 | 0.169 |
| 820.0 | 0.196 |
| 820.1 | 0.23 |
| 820.2 | 0.269 |
| 820.3 | 0.321 |
| 820.4 | 0.389 |
| 820.5 | 0.465 |
| 820.6 | 0.548 |
| 820.7 | 0.628 |
| 820.8 | 0.691 |
| 820.9 | 0.719 |
| 821.0 | 0.706 |
| 821.1 | 0.657 |
| 821.2 | 0.586 |
| 821.3 | 0.5 |
| 821.4 | 0.418 |
| 821.5 | 0.343 |
| 821.6 | 0.278 |
| 821.7 | 0.224 |
| 821.8 | 0.185 |
| 821.9 | 0.156 |
| 822.0 | 0.133 |
| 822.1 | 0.111 |
| 822.2 | 0.094 |
| 822.3 | 0.082 |
| 822.4 | 0.074 |
| 822.5 | 0.068 |
| 822.6 | 0.061 |
| 822.7 | 0.058 |
| 822.8 | 0.056 |
| 822.9 | 0.053 |
| 823.0 | 0.053 |
| 823.1 | 0.056 |
| 823.2 | 0.059 |
| 823.3 | 0.057 |
| 823.4 | 0.054 |
| 823.5 | 0.054 |
| 823.6 | 0.054 |
| 823.7 | 0.059 |
| 823.8 | 0.06 |
| 823.9 | 0.065 |
| 824.0 | 0.068 |
| 824.1 | 0.072 |
| 824.2 | 0.08 |
| 824.3 | 0.082 |
| 824.4 | 0.087 |
| 824.5 | 0.085 |
| 824.6 | 0.087 |
| 824.7 | 0.084 |
| 824.8 | 0.086 |
| 824.9 | 0.077 |
| 825.0 | 0.073 |
| 825.1 | 0.062 |
| 825.2 | 0.056 |
| 825.3 | 0.049 |
| 825.4 | 0.045 |
| 825.5 | 0.044 |
| 825.6 | 0.04 |
| 825.7 | 0.035 |
| 825.8 | 0.03 |
| 825.9 | 0.029 |
| 826.0 | 0.029 |
| 826.1 | 0.029 |
| 826.2 | 0.027 |
| 826.3 | 0.024 |
| 826.4 | 0.023 |
| 826.5 | 0.023 |
| 826.6 | 0.022 |
| 826.7 | 0.023 |
| 826.8 | 0.023 |
| 826.9 | 0.024 |
| 827.0 | 0.027 |
| 827.1 | 0.033 |
| 827.2 | 0.036 |
| 827.3 | 0.038 |
| 827.4 | 0.042 |
| 827.5 | 0.05 |
| 827.6 | 0.058 |
| 827.7 | 0.061 |
| 827.8 | 0.067 |
| 827.9 | 0.076 |
| 828.0 | 0.081 |
| 828.1 | 0.08 |
| 828.2 | 0.074 |
| 828.3 | 0.073 |
| 828.4 | 0.068 |
| 828.5 | 0.064 |
| 828.6 | 0.058 |
| 828.7 | 0.053 |
| 828.8 | 0.046 |
| 828.9 | 0.04 |
| 829.0 | 0.032 |
| 829.1 | 0.026 |
| 829.2 | 0.019 |
| 829.3 | 0.018 |
| 829.4 | 0.011 |
| 829.5 | 0.011 |
| 829.6 | 0.007 |
| 829.7 | 0.011 |
| 829.8 | 0.008 |
| 829.9 | 0.008 |
| 830.0 | 0.002 |
| 830.1 | 0.01 |
| 830.2 | 0.009 |
| 830.3 | 0.009 |
| 830.4 | 0.006 |
| 830.5 | 0.005 |
| 830.6 | 0.005 |
| 830.7 | 0.005 |
| 830.8 | 0.004 |
| 830.9 | 0.005 |
| 831.0 | 0.005 |
| 831.1 | 0.005 |
| 831.2 | 0.005 |
| 831.3 | 0.002 |
| 831.4 | 0 |
| 831.5 | 0 |
| 831.6 | 0.006 |
| 831.7 | 0.006 |
| 831.8 | 0.006 |
| 831.9 | 0.004 |
| 832.0 | 0.002 |
| 832.1 | 0.002 |
| 832.2 | 0.002 |
| 832.3 | 0.001 |
| 832.4 | 0.002 |
| 832.5 | 0 |
| 832.6 | 0 |
| 832.7 | 0.004 |
| 832.8 | 0.002 |
| 832.9 | 0.004 |
| 833.0 | 0 |
| 833.1 | 0 |
| 833.2 | 0 |
| 833.3 | 0.002 |
| 833.4 | 0.002 |
| 833.5 | 0.002 |
| 833.6 | 0.002 |
| 833.7 | 0.005 |
| 833.8 | 0.003 |
| 833.9 | 0.001 |
| 834.0 | 0 |
| 834.1 | 0.006 |
| 834.2 | 0.007 |
| 834.3 | 0.01 |
| 834.4 | 0.002 |
| 834.5 | 0.004 |
| 834.6 | 0.002 |
| 834.7 | 0.005 |
| 834.8 | 0.004 |
| 834.9 | 0.007 |
| 835.0 | 0.004 |
| 835.1 | 0.004 |
| 835.2 | 0.002 |
| 835.3 | 0.01 |
| 835.4 | 0.004 |
| 835.5 | 0.008 |
| 835.6 | 0.01 |
| 835.7 | 0.01 |
| 835.8 | 0.006 |
| 835.9 | 0.004 |
| 836.0 | 0.001 |
| 836.1 | 0.004 |
| 836.2 | 0.012 |
| 836.3 | 0.012 |
| 836.4 | 0.011 |
| 836.5 | 0.008 |
| 836.6 | 0.006 |
| 836.7 | 0.009 |
| 836.8 | 0.009 |
| 836.9 | 0.014 |
| 837.0 | 0.008 |
| 837.1 | 0.005 |
| 837.2 | 0.003 |
| 837.3 | 0.003 |
| 837.4 | 0.005 |
| 837.5 | 0.005 |
| 837.6 | 0.007 |
| 837.7 | 0.011 |
| 837.8 | 0.009 |
| 837.9 | 0.014 |
| 838.0 | 0.014 |
| 838.1 | 0.013 |
| 838.2 | 0.005 |
| 838.3 | 0.001 |
| 838.4 | 0.004 |
| 838.5 | 0.005 |
| 838.6 | 0.009 |
| 838.7 | 0.01 |
| 838.8 | 0.014 |
| 838.9 | 0.014 |
| 839.0 | 0.011 |
| 839.1 | 0.012 |
| 839.2 | 0.014 |
| 839.3 | 0.018 |
| 839.4 | 0.02 |
| 839.5 | 0.015 |
| 839.6 | 0.01 |
| 839.7 | 0.005 |
| 839.8 | 0.004 |
| 839.9 | 0.006 |
| 840.0 | 0.007 |
| 840.1 | 0.011 |
| 840.2 | 0.004 |
| 840.3 | 0.006 |
| 840.4 | 0.006 |
| 840.5 | 0.009 |
| 840.6 | 0.011 |
| 840.7 | 0.005 |
| 840.8 | 0.004 |
| 840.9 | 0.003 |
| 841.0 | 0.011 |
| 841.1 | 0.013 |
| 841.2 | 0.008 |
| 841.3 | 0.007 |
| 841.4 | 0.008 |
| 841.5 | 0.009 |
| 841.6 | 0.009 |
| 841.7 | 0.01 |
| 841.8 | 0.012 |
| 841.9 | 0.013 |
| 842.0 | 0.014 |
| 842.1 | 0.016 |
| 842.2 | 0.013 |
| 842.3 | 0.015 |
| 842.4 | 0.014 |
| 842.5 | 0.017 |
| 842.6 | 0.013 |
| 842.7 | 0.016 |
| 842.8 | 0.014 |
| 842.9 | 0.016 |
| 843.0 | 0.012 |
| 843.1 | 0.015 |
| 843.2 | 0.018 |
| 843.3 | 0.021 |
| 843.4 | 0.019 |
| 843.5 | 0.015 |
| 843.6 | 0.019 |
| 843.7 | 0.025 |
| 843.8 | 0.03 |
| 843.9 | 0.025 |
| 844.0 | 0.02 |
| 844.1 | 0.016 |
| 844.2 | 0.013 |
| 844.3 | 0.012 |
| 844.4 | 0.011 |
| 844.5 | 0.017 |
| 844.6 | 0.017 |
| 844.7 | 0.021 |
| 844.8 | 0.021 |
| 844.9 | 0.02 |
| 845.0 | 0.016 |
| 845.1 | 0.017 |
| 845.2 | 0.019 |
| 845.3 | 0.024 |
| 845.4 | 0.021 |
| 845.5 | 0.024 |
| 845.6 | 0.029 |
| 845.7 | 0.031 |
| 845.8 | 0.028 |
| 845.9 | 0.019 |
| 846.0 | 0.016 |
| 846.1 | 0.013 |
| 846.2 | 0.019 |
| 846.3 | 0.02 |
| 846.4 | 0.021 |
| 846.5 | 0.016 |
| 846.6 | 0.02 |
| 846.7 | 0.02 |
| 846.8 | 0.017 |
| 846.9 | 0.012 |
| 847.0 | 0.013 |
| 847.1 | 0.02 |
| 847.2 | 0.019 |
| 847.3 | 0.018 |
| 847.4 | 0.012 |
| 847.5 | 0.018 |
| 847.6 | 0.019 |
| 847.7 | 0.014 |
| 847.8 | 0.018 |
| 847.9 | 0.021 |
| 848.0 | 0.029 |
| 848.1 | 0.022 |
| 848.2 | 0.025 |
| 848.3 | 0.022 |
| 848.4 | 0.022 |
| 848.5 | 0.016 |
| 848.6 | 0.023 |
| 848.7 | 0.03 |
| 848.8 | 0.037 |
| 848.9 | 0.032 |
| 849.0 | 0.029 |
| 849.1 | 0.025 |
| 849.2 | 0.028 |
| 849.3 | 0.028 |
| 849.4 | 0.027 |
| 849.5 | 0.032 |
| 849.6 | 0.035 |
| 849.7 | 0.033 |
| 849.8 | 0.029 |
| 849.9 | 0.027 |
| 850.0 | 0.038 |
| 850.1 | 0.038 |
| 850.2 | 0.037 |
| 850.3 | 0.036 |
| 850.4 | 0.039 |
| 850.5 | 0.036 |
| 850.6 | 0.042 |
| 850.7 | 0.049 |
| 850.8 | 0.056 |
| 850.9 | 0.052 |
| 851.0 | 0.042 |
| 851.1 | 0.039 |
| 851.2 | 0.035 |
| 851.3 | 0.038 |
| 851.4 | 0.039 |
| 851.5 | 0.048 |
| 851.6 | 0.053 |
| 851.7 | 0.052 |
| 851.8 | 0.038 |
| 851.9 | 0.041 |
| 852.0 | 0.045 |
| 852.1 | 0.05 |
| 852.2 | 0.043 |
| 852.3 | 0.035 |
| 852.4 | 0.042 |
| 852.5 | 0.04 |
| 852.6 | 0.049 |
| 852.7 | 0.051 |
| 852.8 | 0.054 |
| 852.9 | 0.052 |
| 853.0 | 0.045 |
| 853.1 | 0.037 |
| 853.2 | 0.032 |
| 853.3 | 0.037 |
| 853.4 | 0.049 |
| 853.5 | 0.054 |
| 853.6 | 0.045 |
| 853.7 | 0.037 |
| 853.8 | 0.033 |
| 853.9 | 0.036 |
| 854.0 | 0.038 |
| 854.1 | 0.041 |
| 854.2 | 0.041 |
| 854.3 | 0.052 |
| 854.4 | 0.05 |
| 854.5 | 0.051 |
| 854.6 | 0.047 |
| 854.7 | 0.056 |
| 854.8 | 0.07 |
| 854.9 | 0.069 |
| 855.0 | 0.065 |
| 855.1 | 0.06 |
| 855.2 | 0.061 |
| 855.3 | 0.053 |
| 855.4 | 0.05 |
| 855.5 | 0.048 |
| 855.6 | 0.061 |
| 855.7 | 0.059 |
| 855.8 | 0.064 |
| 855.9 | 0.063 |
| 856.0 | 0.073 |
| 856.1 | 0.069 |
| 856.2 | 0.072 |
| 856.3 | 0.077 |
| 856.4 | 0.082 |
| 856.5 | 0.088 |
| 856.6 | 0.081 |
| 856.7 | 0.089 |
| 856.8 | 0.088 |
| 856.9 | 0.089 |
| 857.0 | 0.079 |
| 857.1 | 0.081 |
| 857.2 | 0.089 |
| 857.3 | 0.101 |
| 857.4 | 0.102 |
| 857.5 | 0.101 |
| 857.6 | 0.097 |
| 857.7 | 0.092 |
| 857.8 | 0.088 |
| 857.9 | 0.086 |
| 858.0 | 0.091 |
| 858.1 | 0.083 |
| 858.2 | 0.091 |
| 858.3 | 0.091 |
| 858.4 | 0.098 |
| 858.5 | 0.097 |
| 858.6 | 0.101 |
| 858.7 | 0.103 |
| 858.8 | 0.11 |
| 858.9 | 0.11 |
| 859.0 | 0.114 |
| 859.1 | 0.116 |
| 859.2 | 0.128 |
| 859.3 | 0.138 |
| 859.4 | 0.136 |
| 859.5 | 0.127 |
| 859.6 | 0.129 |
| 859.7 | 0.128 |
| 859.8 | 0.136 |
| 859.9 | 0.136 |
| 860.0 | 0.152 |
| 860.1 | 0.143 |
| 860.2 | 0.145 |
| 860.3 | 0.143 |
| 860.4 | 0.145 |
| 860.5 | 0.147 |
| 860.6 | 0.141 |
| 860.7 | 0.15 |
| 860.8 | 0.141 |
| 860.9 | 0.146 |
| 861.0 | 0.15 |
| 861.1 | 0.159 |
| 861.2 | 0.155 |
| 861.3 | 0.155 |
| 861.4 | 0.165 |
| 861.5 | 0.167 |
| 861.6 | 0.172 |
| 861.7 | 0.172 |
| 861.8 | 0.165 |
| 861.9 | 0.149 |
| 862.0 | 0.139 |
| 862.1 | 0.147 |
| 862.2 | 0.154 |
| 862.3 | 0.169 |
| 862.4 | 0.176 |
| 862.5 | 0.189 |
| 862.6 | 0.179 |
| 862.7 | 0.182 |
| 862.8 | 0.185 |
| 862.9 | 0.202 |
| 863.0 | 0.2 |
| 863.1 | 0.207 |
| 863.2 | 0.185 |
| 863.3 | 0.175 |
| 863.4 | 0.178 |
| 863.5 | 0.199 |
| 863.6 | 0.21 |
| 863.7 | 0.206 |
| 863.8 | 0.208 |
| 863.9 | 0.22 |
| 864.0 | 0.219 |
| 864.1 | 0.235 |
| 864.2 | 0.225 |
| 864.3 | 0.231 |
| 864.4 | 0.219 |
| 864.5 | 0.242 |
| 864.6 | 0.243 |
| 864.7 | 0.251 |
| 864.8 | 0.245 |
| 864.9 | 0.254 |
| 865.0 | 0.246 |
| 865.1 | 0.256 |
| 865.2 | 0.26 |
| 865.3 | 0.279 |
| 865.4 | 0.272 |
| 865.5 | 0.274 |
| 865.6 | 0.264 |
| 865.7 | 0.269 |
| 865.8 | 0.26 |
| 865.9 | 0.265 |
| 866.0 | 0.266 |
| 866.1 | 0.267 |
| 866.2 | 0.267 |
| 866.3 | 0.269 |
| 866.4 | 0.282 |
| 866.5 | 0.289 |
| 866.6 | 0.284 |
| 866.7 | 0.289 |
| 866.8 | 0.301 |
| 866.9 | 0.308 |
| 867.0 | 0.313 |
| 867.1 | 0.305 |
| 867.2 | 0.311 |
| 867.3 | 0.312 |
| 867.4 | 0.32 |
| 867.5 | 0.328 |
| 867.6 | 0.343 |
| 867.7 | 0.355 |
| 867.8 | 0.377 |
| 867.9 | 0.403 |
| 868.0 | 0.42 |
| 868.1 | 0.434 |
| 868.2 | 0.47 |
| 868.3 | 0.53 |
| 868.4 | 0.607 |
| 868.5 | 0.673 |
| 868.6 | 0.74 |
| 868.7 | 0.793 |
| 868.8 | 0.817 |
| 868.9 | 0.818 |
| 869.0 | 0.796 |
| 869.1 | 0.745 |
| 869.2 | 0.682 |
| 869.3 | 0.609 |
| 869.4 | 0.56 |
| 869.5 | 0.522 |
| 869.6 | 0.501 |
| 869.7 | 0.484 |
| 869.8 | 0.497 |
| 869.9 | 0.528 |
| 870.0 | 0.577 |
| 870.1 | 0.653 |
| 870.2 | 0.763 |
| 870.3 | 0.902 |
| 870.4 | 1.041 |
| 870.5 | 1.224 |
| 870.6 | 1.402 |
| 870.7 | 1.563 |
| 870.8 | 1.639 |
| 870.9 | 1.687 |
| 871.0 | 1.687 |
| 871.1 | 1.629 |
| 871.2 | 1.521 |
| 871.3 | 1.372 |
| 871.4 | 1.239 |
| 871.5 | 1.106 |
| 871.6 | 0.986 |
| 871.7 | 0.844 |
| 871.8 | 0.73 |
| 871.9 | 0.641 |
| 872.0 | 0.574 |
| 872.1 | 0.504 |
| 872.2 | 0.453 |
| 872.3 | 0.418 |
| 872.4 | 0.398 |
| 872.5 | 0.383 |
| 872.6 | 0.367 |
| 872.7 | 0.357 |
| 872.8 | 0.336 |
| 872.9 | 0.332 |
| 873.0 | 0.323 |
| 873.1 | 0.33 |
| 873.2 | 0.327 |
| 873.3 | 0.337 |
| 873.4 | 0.344 |
| 873.5 | 0.365 |
| 873.6 | 0.386 |
| 873.7 | 0.412 |
| 873.8 | 0.429 |
| 873.9 | 0.443 |
| 874.0 | 0.446 |
| 874.1 | 0.436 |
| 874.2 | 0.412 |
| 874.3 | 0.394 |
| 874.4 | 0.376 |
| 874.5 | 0.362 |
| 874.6 | 0.346 |
| 874.7 | 0.336 |
| 874.8 | 0.344 |
| 874.9 | 0.348 |
| 875.0 | 0.369 |
| 875.1 | 0.391 |
| 875.2 | 0.438 |
| 875.3 | 0.487 |
| 875.4 | 0.549 |
| 875.5 | 0.635 |
| 875.6 | 0.748 |
| 875.7 | 0.881 |
| 875.8 | 1.033 |
| 875.9 | 1.232 |
| 876.0 | 1.411 |
| 876.1 | 1.534 |
| 876.2 | 1.57 |
| 876.3 | 1.532 |
| 876.4 | 1.424 |
| 876.5 | 1.264 |
| 876.6 | 1.122 |
| 876.7 | 0.95 |
| 876.8 | 0.796 |
| 876.9 | 0.651 |
| 877.0 | 0.57 |
| 877.1 | 0.505 |
| 877.2 | 0.458 |
| 877.3 | 0.428 |
| 877.4 | 0.402 |
| 877.5 | 0.383 |
| 877.6 | 0.362 |
| 877.7 | 0.351 |
| 877.8 | 0.334 |
| 877.9 | 0.326 |
| 878.0 | 0.32 |
| 878.1 | 0.32 |
| 878.2 | 0.322 |
| 878.3 | 0.324 |
| 878.4 | 0.328 |
| 878.5 | 0.331 |
| 878.6 | 0.345 |
| 878.7 | 0.365 |
| 878.8 | 0.389 |
| 878.9 | 0.408 |
| 879.0 | 0.435 |
| 879.1 | 0.461 |
| 879.2 | 0.49 |
| 879.3 | 0.512 |
| 879.4 | 0.538 |
| 879.5 | 0.552 |
| 879.6 | 0.562 |
| 879.7 | 0.565 |
| 879.8 | 0.561 |
| 879.9 | 0.554 |
| 880.0 | 0.541 |
| 880.1 | 0.52 |
| 880.2 | 0.491 |
| 880.3 | 0.459 |
| 880.4 | 0.425 |
| 880.5 | 0.386 |
| 880.6 | 0.341 |
| 880.7 | 0.301 |
| 880.8 | 0.271 |
| 880.9 | 0.245 |
| 881.0 | 0.225 |
| 881.1 | 0.205 |
| 881.2 | 0.192 |
| 881.3 | 0.182 |
| 881.4 | 0.173 |
| 881.5 | 0.166 |
| 881.6 | 0.159 |
| 881.7 | 0.157 |
| 881.8 | 0.156 |
| 881.9 | 0.157 |
| 882.0 | 0.157 |
| 882.1 | 0.157 |
| 882.2 | 0.163 |
| 882.3 | 0.173 |
| 882.4 | 0.182 |
| 882.5 | 0.188 |
| 882.6 | 0.193 |
| 882.7 | 0.201 |
| 882.8 | 0.21 |
| 882.9 | 0.226 |
| 883.0 | 0.241 |
| 883.1 | 0.256 |
| 883.2 | 0.274 |
| 883.3 | 0.306 |
| 883.4 | 0.342 |
| 883.5 | 0.387 |
| 883.6 | 0.459 |
| 883.7 | 0.55 |
| 883.8 | 0.646 |
| 883.9 | 0.726 |
| 884.0 | 0.841 |
| 884.1 | 0.979 |
| 884.2 | 1.122 |
| 884.3 | 1.234 |
| 884.4 | 1.345 |
| 884.5 | 1.441 |
| 884.6 | 1.517 |
| 884.7 | 1.554 |
| 884.8 | 1.588 |
| 884.9 | 1.616 |
| 885.0 | 1.63 |
| 885.1 | 1.623 |
| 885.2 | 1.58 |
| 885.3 | 1.519 |
| 885.4 | 1.431 |
| 885.5 | 1.294 |
| 885.6 | 1.114 |
| 885.7 | 0.934 |
| 885.8 | 0.796 |
| 885.9 | 0.682 |
| 886.0 | 0.57 |
| 886.1 | 0.48 |
| 886.2 | 0.406 |
| 886.3 | 0.341 |
| 886.4 | 0.28 |
| 886.5 | 0.236 |
| 886.6 | 0.211 |
| 886.7 | 0.186 |
| 886.8 | 0.166 |
| 886.9 | 0.147 |
| 887.0 | 0.135 |
| 887.1 | 0.12 |
| 887.2 | 0.107 |
| 887.3 | 0.094 |
| 887.4 | 0.088 |
| 887.5 | 0.08 |
| 887.6 | 0.074 |
| 887.7 | 0.066 |
| 887.8 | 0.061 |
| 887.9 | 0.06 |
| 888.0 | 0.059 |
| 888.1 | 0.06 |
| 888.2 | 0.058 |
| 888.3 | 0.06 |
| 888.4 | 0.061 |
| 888.5 | 0.063 |
| 888.6 | 0.066 |
| 888.7 | 0.07 |
| 888.8 | 0.072 |
| 888.9 | 0.076 |
| 889.0 | 0.081 |
| 889.1 | 0.092 |
| 889.2 | 0.103 |
| 889.3 | 0.113 |
| 889.4 | 0.125 |
| 889.5 | 0.146 |
| 889.6 | 0.17 |
| 889.7 | 0.199 |
| 889.8 | 0.232 |
| 889.9 | 0.284 |
| 890.0 | 0.343 |
| 890.1 | 0.404 |
| 890.2 | 0.474 |
| 890.3 | 0.542 |
| 890.4 | 0.605 |
| 890.5 | 0.64 |
| 890.6 | 0.657 |
| 890.7 | 0.659 |
| 890.8 | 0.638 |
| 890.9 | 0.608 |
| 891.0 | 0.6 |
| 891.1 | 0.537 |
| 891.2 | 0.463 |
| 891.3 | 0.413 |
| 891.4 | 0.35 |
| 891.5 | 0.297 |
| 891.6 | 0.248 |
| 891.7 | 0.217 |
| 891.8 | 0.187 |
| 891.9 | 0.162 |
| 892.0 | 0.143 |
| 892.1 | 0.132 |
| 892.2 | 0.119 |
| 892.3 | 0.109 |
| 892.4 | 0.1 |
| 892.5 | 0.097 |
| 892.6 | 0.091 |
| 892.7 | 0.088 |
| 892.8 | 0.083 |
| 892.9 | 0.082 |
| 893.0 | 0.081 |
| 893.1 | 0.083 |
| 893.2 | 0.084 |
| 893.3 | 0.085 |
| 893.4 | 0.083 |
| 893.5 | 0.082 |
| 893.6 | 0.081 |
| 893.7 | 0.079 |
| 893.8 | 0.075 |
| 893.9 | 0.071 |
| 894.0 | 0.066 |
| 894.1 | 0.061 |
| 894.2 | 0.053 |
| 894.3 | 0.048 |
| 894.4 | 0.047 |
| 894.5 | 0.045 |
| 894.6 | 0.047 |
| 894.7 | 0.041 |
| 894.8 | 0.037 |
| 894.9 | 0.033 |
| 895.0 | 0.034 |
| 895.1 | 0.037 |
| 895.2 | 0.038 |
| 895.3 | 0.034 |
| 895.4 | 0.031 |
| 895.5 | 0.03 |
| 895.6 | 0.032 |
| 895.7 | 0.031 |
| 895.8 | 0.031 |
| 895.9 | 0.032 |
| 896.0 | 0.033 |
| 896.1 | 0.03 |
| 896.2 | 0.027 |
| 896.3 | 0.025 |
| 896.4 | 0.026 |
| 896.5 | 0.027 |
| 896.6 | 0.027 |
| 896.7 | 0.023 |
| 896.8 | 0.024 |
| 896.9 | 0.023 |
| 897.0 | 0.024 |
| 897.1 | 0.023 |
| 897.2 | 0.025 |
| 897.3 | 0.026 |
| 897.4 | 0.028 |
| 897.5 | 0.029 |
| 897.6 | 0.035 |
| 897.7 | 0.042 |
| 897.8 | 0.049 |
| 897.9 | 0.055 |
| 898.0 | 0.06 |
| 898.1 | 0.069 |
| 898.2 | 0.077 |
| 898.3 | 0.09 |
| 898.4 | 0.097 |
| 898.5 | 0.108 |
| 898.6 | 0.116 |
| 898.7 | 0.124 |
| 898.8 | 0.129 |
| 898.9 | 0.134 |
| 899.0 | 0.139 |
| 899.1 | 0.139 |
| 899.2 | 0.14 |
| 899.3 | 0.133 |
| 899.4 | 0.126 |
| 899.5 | 0.115 |
| 899.6 | 0.108 |
| 899.7 | 0.099 |
| 899.8 | 0.092 |
| 899.9 | 0.082 |
| 900.0 | 0.076 |
| 900.1 | 0.069 |
| 900.2 | 0.06 |
| 900.3 | 0.055 |
| 900.4 | 0.047 |
| 900.5 | 0.046 |
| 900.6 | 0.041 |
| 900.7 | 0.04 |
| 900.8 | 0.034 |
| 900.9 | 0.031 |
| 901.0 | 0.027 |
| 901.1 | 0.024 |
| 901.2 | 0.024 |
| 901.3 | 0.022 |
| 901.4 | 0.021 |
| 901.5 | 0.017 |
| 901.6 | 0.015 |
| 901.7 | 0.014 |
| 901.8 | 0.012 |
| 901.9 | 0.01 |
| 902.0 | 0.009 |
| 902.1 | 0.007 |
| 902.2 | 0.005 |
| 902.3 | 0.004 |
| 902.4 | 0.006 |
| 902.5 | 0.006 |
| 902.6 | 0.006 |
| 902.7 | 0.005 |
| 902.8 | 0.005 |
| 902.9 | 0.002 |
| 903.0 | 0 |
| 903.1 | 0 |
| 903.2 | 0 |
| 903.3 | 0.002 |
| 903.4 | 0.003 |
| 903.5 | 0.004 |
| 903.6 | 0.003 |
| 903.7 | 0.001 |
| 903.8 | 0.005 |
| 903.9 | 0.002 |
| 904.0 | 0.004 |
| 904.1 | 0.004 |
| 904.2 | 0.004 |
| 904.3 | 0.004 |
| 904.4 | 0.005 |
| 904.5 | 0.008 |
| 904.6 | 0.007 |
| 904.7 | 0.007 |
| 904.8 | 0.009 |
| 904.9 | 0.01 |
| 905.0 | 0.01 |
| 905.1 | 0.008 |
| 905.2 | 0.008 |
| 905.3 | 0.008 |
| 905.4 | 0.01 |
| 905.5 | 0.009 |
| 905.6 | 0.011 |
| 905.7 | 0.01 |
| 905.8 | 0.011 |
| 905.9 | 0.011 |
| 906.0 | 0.012 |
| 906.1 | 0.013 |
| 906.2 | 0.013 |
| 906.3 | 0.013 |
| 906.4 | 0.013 |
| 906.5 | 0.013 |
| 906.6 | 0.014 |
| 906.7 | 0.014 |
| 906.8 | 0.014 |
| 906.9 | 0.012 |
| 907.0 | 0.014 |
| 907.1 | 0.016 |
| 907.2 | 0.017 |
| 907.3 | 0.015 |
| 907.4 | 0.014 |
| 907.5 | 0.016 |
| 907.6 | 0.017 |
| 907.7 | 0.018 |
| 907.8 | 0.018 |
| 907.9 | 0.016 |
| 908.0 | 0.017 |
| 908.1 | 0.017 |
| 908.2 | 0.018 |
| 908.3 | 0.018 |
| 908.4 | 0.018 |
| 908.5 | 0.019 |
| 908.6 | 0.019 |
| 908.7 | 0.019 |
| 908.8 | 0.019 |
| 908.9 | 0.018 |
| 909.0 | 0.018 |
| 909.1 | 0.018 |
| 909.2 | 0.018 |
| 909.3 | 0.018 |
| 909.4 | 0.016 |
| 909.5 | 0.017 |
| 909.6 | 0.016 |
| 909.7 | 0.016 |
| 909.8 | 0.014 |
| 909.9 | 0.013 |
| 910.0 | 0.013 |
| 910.1 | 0.014 |
| 910.2 | 0.016 |
| 910.3 | 0.016 |
| 910.4 | 0.017 |
| 910.5 | 0.017 |
| 910.6 | 0.016 |
| 910.7 | 0.013 |
| 910.8 | 0.01 |
| 910.9 | 0.011 |
| 911.0 | 0.013 |
| 911.1 | 0.013 |
| 911.2 | 0.013 |
| 911.3 | 0.012 |
| 911.4 | 0.012 |
| 911.5 | 0.011 |
| 911.6 | 0.012 |
| 911.7 | 0.011 |
| 911.8 | 0.011 |
| 911.9 | 0.01 |
| 912.0 | 0.011 |
| 912.1 | 0.01 |
| 912.2 | 0.011 |
| 912.3 | 0.011 |
| 912.4 | 0.011 |
| 912.5 | 0.011 |
| 912.6 | 0.011 |
| 912.7 | 0.012 |
| 912.8 | 0.01 |
| 912.9 | 0.01 |
| 913.0 | 0.008 |
| 913.1 | 0.008 |
| 913.2 | 0.008 |
| 913.3 | 0.009 |
| 913.4 | 0.009 |
| 913.5 | 0.009 |
| 913.6 | 0.007 |
| 913.7 | 0.007 |
| 913.8 | 0.006 |
| 913.9 | 0.005 |
| 914.0 | 0.006 |
| 914.1 | 0.006 |
| 914.2 | 0.005 |
| 914.3 | 0.004 |
| 914.4 | 0.004 |
| 914.5 | 0.006 |
| 914.6 | 0.006 |
| 914.7 | 0.006 |
| 914.8 | 0.006 |
| 914.9 | 0.007 |
| 915.0 | 0.006 |
| 915.1 | 0.007 |
| 915.2 | 0.008 |
| 915.3 | 0.008 |
| 915.4 | 0.007 |
| 915.5 | 0.007 |
| 915.6 | 0.007 |
| 915.7 | 0.007 |
| 915.8 | 0.006 |
| 915.9 | 0.005 |
| 916.0 | 0.005 |
| 916.1 | 0.005 |
| 916.2 | 0.006 |
| 916.3 | 0.006 |
| 916.4 | 0.006 |
| 916.5 | 0.007 |
| 916.6 | 0.008 |
| 916.7 | 0.009 |
| 916.8 | 0.01 |
| 916.9 | 0.009 |
| 917.0 | 0.009 |
| 917.1 | 0.007 |
| 917.2 | 0.005 |
| 917.3 | 0.004 |
| 917.4 | 0.005 |
| 917.5 | 0.005 |
| 917.6 | 0.005 |
| 917.7 | 0.005 |
| 917.8 | 0.006 |
| 917.9 | 0.005 |
| 918.0 | 0.004 |
| 918.1 | 0.004 |
| 918.2 | 0.004 |
| 918.3 | 0.004 |
| 918.4 | 0.004 |
| 918.5 | 0.004 |
| 918.6 | 0.004 |
| 918.7 | 0.006 |
| 918.8 | 0.005 |
| 918.9 | 0.004 |
| 919.0 | 0.003 |
| 919.1 | 0.004 |
| 919.2 | 0.005 |
| 919.3 | 0.005 |
| 919.4 | 0.005 |
| 919.5 | 0.005 |
| 919.6 | 0.004 |
| 919.7 | 0.004 |
| 919.8 | 0.003 |
| 919.9 | 0.002 |
| 920.0 | 0.001 |
| 920.1 | 0.001 |
| 920.2 | 0.001 |
| 920.3 | 0.002 |
| 920.4 | 0.004 |
| 920.5 | 0.005 |
| 920.6 | 0.004 |
| 920.7 | 0.004 |
| 920.8 | 0.003 |
| 920.9 | 0.004 |
| 921.0 | 0.003 |
| 921.1 | 0.004 |
| 921.2 | 0.004 |
| 921.3 | 0.002 |
| 921.4 | 0.002 |
| 921.5 | 0.002 |
| 921.6 | 0.002 |
| 921.7 | 0.003 |
| 921.8 | 0.004 |
| 921.9 | 0.005 |
| 922.0 | 0.003 |
| 922.1 | 0.004 |
| 922.2 | 0.002 |
| 922.3 | 0.004 |
| 922.4 | 0.003 |
| 922.5 | 0.004 |
| 922.6 | 0.003 |
| 922.7 | 0.004 |
| 922.8 | 0.003 |
| 922.9 | 0.003 |
| 923.0 | 0.002 |
| 923.1 | 0.002 |
| 923.2 | 0.001 |
| 923.3 | 0.001 |
| 923.4 | 0.002 |
| 923.5 | 0.005 |
| 923.6 | 0.005 |
| 923.7 | 0.005 |
| 923.8 | 0.003 |
| 923.9 | 0.004 |
| 924.0 | 0.003 |
| 924.1 | 0.003 |
| 924.2 | 0.002 |
| 924.3 | 0.001 |
| 924.4 | 0.001 |
| 924.5 | 0.001 |
| 924.6 | 0.001 |
| 924.7 | 0.001 |
| 924.8 | 0.001 |
| 924.9 | 0.001 |
| 925.0 | 0.002 |
| 925.1 | 0.001 |
| 925.2 | 0.001 |
| 925.3 | 0.001 |
| 925.4 | 0 |
| 925.5 | 0.001 |
| 925.6 | 0 |
| 925.7 | 0 |
| 925.8 | 0 |
| 925.9 | 0 |
| 926.0 | 0 |
| 926.1 | 0.001 |
| 926.2 | 0.001 |
| 926.3 | 0.001 |
| 926.4 | 0 |
| 926.5 | 0.001 |
| 926.6 | 0.002 |
| 926.7 | 0.001 |
| 926.8 | 0.001 |
| 926.9 | 0.001 |
| 927.0 | 0.001 |
| 927.1 | 0.001 |
| 927.2 | 0.001 |
| 927.3 | 0.001 |
| 927.4 | 0 |
| 927.5 | 0.002 |
| 927.6 | 0.003 |
| 927.7 | 0.004 |
| 927.8 | 0.004 |
| 927.9 | 0.003 |
| 928.0 | 0.001 |
| 928.1 | 0 |
| 928.2 | 0 |
| 928.3 | 0 |
| 928.4 | 0 |
| 928.5 | 0 |
| 928.6 | 0 |
| 928.7 | 0.001 |
| 928.8 | 0.003 |
| 928.9 | 0.002 |
| 929.0 | 0.003 |
| 929.1 | 0.002 |
| 929.2 | 0.003 |
| 929.3 | 0.002 |
| 929.4 | 0.002 |
| 929.5 | 0.003 |
| 929.6 | 0.003 |
| 929.7 | 0.002 |
| 929.8 | 0.001 |
| 929.9 | 0 |
| 930.0 | 0.001 |
| 930.1 | 0.002 |
| 930.2 | 0.004 |
| 930.3 | 0.005 |
| 930.4 | 0.007 |
| 930.5 | 0.008 |
| 930.6 | 0.01 |
| 930.7 | 0.012 |
| 930.8 | 0.01 |
| 930.9 | 0.01 |
| 931.0 | 0.009 |
| 931.1 | 0.01 |
| 931.2 | 0.01 |
| 931.3 | 0.01 |
| 931.4 | 0.01 |
| 931.5 | 0.01 |
| 931.6 | 0.01 |
| 931.7 | 0.01 |
| 931.8 | 0.01 |
| 931.9 | 0.01 |
| 932.0 | 0.01 |
| 932.1 | 0.01 |
| 932.2 | 0.011 |
| 932.3 | 0.011 |
| 932.4 | 0.011 |
| 932.5 | 0.011 |
| 932.6 | 0.011 |
| 932.7 | 0.01 |
| 932.8 | 0.011 |
| 932.9 | 0.011 |
| 933.0 | 0.012 |
| 933.1 | 0.013 |
| 933.2 | 0.013 |
| 933.3 | 0.013 |
| 933.4 | 0.011 |
| 933.5 | 0.011 |
| 933.6 | 0.01 |
| 933.7 | 0.012 |
| 933.8 | 0.013 |
| 933.9 | 0.015 |
| 934.0 | 0.015 |
| 934.1 | 0.016 |
| 934.2 | 0.015 |
| 934.3 | 0.015 |
| 934.4 | 0.014 |
| 934.5 | 0.015 |
| 934.6 | 0.015 |
| 934.7 | 0.016 |
| 934.8 | 0.016 |
| 934.9 | 0.016 |
| 935.0 | 0.015 |
| 935.1 | 0.013 |
| 935.2 | 0.012 |
| 935.3 | 0.011 |
| 935.4 | 0.01 |
| 935.5 | 0.009 |
| 935.6 | 0.008 |
| 935.7 | 0.007 |
| 935.8 | 0.008 |
| 935.9 | 0.007 |
| 936.0 | 0.007 |
| 936.1 | 0.006 |
| 936.2 | 0.005 |
| 936.3 | 0.006 |
| 936.4 | 0.008 |
| 936.5 | 0.01 |
| 936.6 | 0.013 |
| 936.7 | 0.014 |
| 936.8 | 0.015 |
| 936.9 | 0.017 |
| 937.0 | 0.016 |
| 937.1 | 0.015 |
| 937.2 | 0.01 |
| 937.3 | 0.008 |
| 937.4 | 0.006 |
| 937.5 | 0.007 |
| 937.6 | 0.008 |
| 937.7 | 0.009 |
| 937.8 | 0.011 |
| 937.9 | 0.013 |
| 938.0 | 0.015 |
| 938.1 | 0.016 |
| 938.2 | 0.016 |
| 938.3 | 0.016 |
| 938.4 | 0.014 |
| 938.5 | 0.013 |
| 938.6 | 0.01 |
| 938.7 | 0.009 |
| 938.8 | 0.008 |
| 938.9 | 0.009 |
| 939.0 | 0.009 |
| 939.1 | 0.009 |
| 939.2 | 0.01 |
| 939.3 | 0.011 |
| 939.4 | 0.013 |
| 939.5 | 0.014 |
| 939.6 | 0.014 |
| 939.7 | 0.013 |
| 939.8 | 0.013 |
| 939.9 | 0.012 |
| 940.0 | 0.012 |
| 940.1 | 0.012 |
| 940.2 | 0.012 |
| 940.3 | 0.013 |
| 940.4 | 0.014 |
| 940.5 | 0.015 |
| 940.6 | 0.015 |
| 940.7 | 0.015 |
| 940.8 | 0.015 |
| 940.9 | 0.016 |
| 941.0 | 0.016 |
| 941.1 | 0.016 |
| 941.2 | 0.015 |
| 941.3 | 0.015 |
| 941.4 | 0.015 |
| 941.5 | 0.015 |
| 941.6 | 0.014 |
| 941.7 | 0.013 |
| 941.8 | 0.013 |
| 941.9 | 0.013 |
| 942.0 | 0.013 |
| 942.1 | 0.013 |
| 942.2 | 0.011 |
| 942.3 | 0.013 |
| 942.4 | 0.012 |
| 942.5 | 0.013 |
| 942.6 | 0.013 |
| 942.7 | 0.013 |
| 942.8 | 0.013 |
| 942.9 | 0.013 |
| 943.0 | 0.014 |
| 943.1 | 0.014 |
| 943.2 | 0.014 |
| 943.3 | 0.014 |
| 943.4 | 0.013 |
| 943.5 | 0.013 |
| 943.6 | 0.013 |
| 943.7 | 0.013 |
| 943.8 | 0.014 |
| 943.9 | 0.014 |
| 944.0 | 0.014 |
| 944.1 | 0.013 |
| 944.2 | 0.012 |
| 944.3 | 0.012 |
| 944.4 | 0.011 |
| 944.5 | 0.011 |
| 944.6 | 0.011 |
| 944.7 | 0.01 |
| 944.8 | 0.009 |
| 944.9 | 0.007 |
| 945.0 | 0.007 |
| 945.1 | 0.007 |
| 945.2 | 0.009 |
| 945.3 | 0.011 |
| 945.4 | 0.012 |
| 945.5 | 0.014 |
| 945.6 | 0.016 |
| 945.7 | 0.016 |
| 945.8 | 0.015 |
| 945.9 | 0.012 |
| 946.0 | 0.011 |
| 946.1 | 0.009 |
| 946.2 | 0.008 |
| 946.3 | 0.006 |
| 946.4 | 0.006 |
| 946.5 | 0.007 |
| 946.6 | 0.009 |
| 946.7 | 0.011 |
| 946.8 | 0.013 |
| 946.9 | 0.014 |
| 947.0 | 0.015 |
| 947.1 | 0.014 |
| 947.2 | 0.013 |
| 947.3 | 0.012 |
| 947.4 | 0.011 |
| 947.5 | 0.009 |
| 947.6 | 0.008 |
| 947.7 | 0.008 |
| 947.8 | 0.008 |
| 947.9 | 0.007 |
| 948.0 | 0.006 |
| 948.1 | 0.005 |
| 948.2 | 0.007 |
| 948.3 | 0.008 |
| 948.4 | 0.008 |
| 948.5 | 0.009 |
| 948.6 | 0.009 |
| 948.7 | 0.009 |
| 948.8 | 0.01 |
| 948.9 | 0.01 |
| 949.0 | 0.01 |
| 949.1 | 0.011 |
| 949.2 | 0.011 |
| 949.3 | 0.01 |
| 949.4 | 0.01 |
| 949.5 | 0.011 |
| 949.6 | 0.011 |
| 949.7 | 0.011 |
| 949.8 | 0.011 |
| 949.9 | 0.011 |
| 950.0 | 0.012 |
| 950.1 | 0.011 |
| 950.2 | 0.009 |
| 950.3 | 0.009 |
| 950.4 | 0.008 |
| 950.5 | 0.008 |
| 950.6 | 0.008 |
| 950.7 | 0.008 |
| 950.8 | 0.008 |
| 950.9 | 0.007 |
| 951.0 | 0.009 |
| 951.1 | 0.009 |
| 951.2 | 0.01 |
| 951.3 | 0.009 |
| 951.4 | 0.008 |
| 951.5 | 0.007 |
| 951.6 | 0.006 |
| 951.7 | 0.006 |
| 951.8 | 0.005 |
| 951.9 | 0.005 |
| 952.0 | 0.005 |
| 952.1 | 0.004 |
| 952.2 | 0.005 |
| 952.3 | 0.006 |
| 952.4 | 0.007 |
| 952.5 | 0.006 |
| 952.6 | 0.006 |
| 952.7 | 0.006 |
| 952.8 | 0.006 |
| 952.9 | 0.007 |
| 953.0 | 0.007 |
| 953.1 | 0.007 |
| 953.2 | 0.007 |
| 953.3 | 0.007 |
| 953.4 | 0.006 |
| 953.5 | 0.006 |
| 953.6 | 0.005 |
| 953.7 | 0.004 |
| 953.8 | 0.004 |
| 953.9 | 0.004 |
| 954.0 | 0.003 |
| 954.1 | 0.002 |
| 954.2 | 0.002 |
| 954.3 | 0.003 |
| 954.4 | 0.002 |
| 954.5 | 0.002 |
| 954.6 | 0.002 |
| 954.7 | 0.004 |
| 954.8 | 0.005 |
| 954.9 | 0.005 |
| 955.0 | 0.004 |
| 955.1 | 0.003 |
| 955.2 | 0.004 |
| 955.3 | 0.005 |
| 955.4 | 0.009 |
| 955.5 | 0.009 |
| 955.6 | 0.009 |
| 955.7 | 0.008 |
| 955.8 | 0.007 |
| 955.9 | 0.007 |
| 956.0 | 0.008 |
| 956.1 | 0.009 |
| 956.2 | 0.009 |
| 956.3 | 0.008 |
| 956.4 | 0.008 |
| 956.5 | 0.008 |
| 956.6 | 0.007 |
| 956.7 | 0.006 |
| 956.8 | 0.005 |
| 956.9 | 0.004 |
| 957.0 | 0.005 |
| 957.1 | 0.006 |
| 957.2 | 0.006 |
| 957.3 | 0.007 |
| 957.4 | 0.007 |
| 957.5 | 0.008 |
| 957.6 | 0.009 |
| 957.7 | 0.008 |
| 957.8 | 0.005 |
| 957.9 | 0.005 |
| 958.0 | 0.005 |
| 958.1 | 0.005 |
| 958.2 | 0.003 |
| 958.3 | 0.001 |
| 958.4 | 0.001 |
| 958.5 | 0.003 |
| 958.6 | 0.004 |
| 958.7 | 0.004 |
| 958.8 | 0.004 |
| 958.9 | 0.003 |
| 959.0 | 0.003 |
| 959.1 | 0.003 |
| 959.2 | 0.003 |
| 959.3 | 0.004 |
| 959.4 | 0.004 |
| 959.5 | 0.005 |
| 959.6 | 0.006 |
| 959.7 | 0.006 |
| 959.8 | 0.007 |
| 959.9 | 0.007 |
| 960.0 | 0.006 |
| 960.1 | 0.005 |
| 960.2 | 0.004 |
| 960.3 | 0.005 |
| 960.4 | 0.005 |
| 960.5 | 0.005 |
| 960.6 | 0.004 |
| 960.7 | 0.005 |
| 960.8 | 0.005 |
| 960.9 | 0.005 |
| 961.0 | 0.006 |
| 961.1 | 0.006 |
| 961.2 | 0.006 |
| 961.3 | 0.005 |
| 961.4 | 0.005 |
| 961.5 | 0.005 |
| 961.6 | 0.006 |
| 961.7 | 0.005 |
| 961.8 | 0.005 |
| 961.9 | 0.007 |
| 962.0 | 0.008 |
| 962.1 | 0.009 |
| 962.2 | 0.01 |
| 962.3 | 0.009 |
| 962.4 | 0.009 |
| 962.5 | 0.008 |
| 962.6 | 0.008 |
| 962.7 | 0.009 |
| 962.8 | 0.009 |
| 962.9 | 0.01 |
| 963.0 | 0.009 |
| 963.1 | 0.009 |
| 963.2 | 0.009 |
| 963.3 | 0.008 |
| 963.4 | 0.009 |
| 963.5 | 0.009 |
| 963.6 | 0.01 |
| 963.7 | 0.01 |
| 963.8 | 0.01 |
| 963.9 | 0.012 |
| 964.0 | 0.011 |
| 964.1 | 0.011 |
| 964.2 | 0.011 |
| 964.3 | 0.012 |
| 964.4 | 0.011 |
| 964.5 | 0.011 |
| 964.6 | 0.011 |
| 964.7 | 0.012 |
| 964.8 | 0.013 |
| 964.9 | 0.015 |
| 965.0 | 0.015 |
| 965.1 | 0.015 |
| 965.2 | 0.015 |
| 965.3 | 0.017 |
| 965.4 | 0.016 |
| 965.5 | 0.015 |
| 965.6 | 0.014 |
| 965.7 | 0.013 |
| 965.8 | 0.013 |
| 965.9 | 0.012 |
| 966.0 | 0.011 |
| 966.1 | 0.011 |
| 966.2 | 0.011 |
| 966.3 | 0.011 |
| 966.4 | 0.012 |
| 966.5 | 0.013 |
| 966.6 | 0.014 |
| 966.7 | 0.013 |
| 966.8 | 0.013 |
| 966.9 | 0.013 |
| 967.0 | 0.013 |
| 967.1 | 0.013 |
| 967.2 | 0.013 |
| 967.3 | 0.013 |
| 967.4 | 0.014 |
| 967.5 | 0.014 |
| 967.6 | 0.013 |
| 967.7 | 0.012 |
| 967.8 | 0.012 |
| 967.9 | 0.012 |
| 968.0 | 0.011 |
| 968.1 | 0.011 |
| 968.2 | 0.012 |
| 968.3 | 0.011 |
| 968.4 | 0.011 |
| 968.5 | 0.01 |
| 968.6 | 0.01 |
| 968.7 | 0.01 |
| 968.8 | 0.01 |
| 968.9 | 0.01 |
| 969.0 | 0.011 |
| 969.1 | 0.011 |
| 969.2 | 0.012 |
| 969.3 | 0.012 |
| 969.4 | 0.012 |
| 969.5 | 0.012 |
| 969.6 | 0.012 |
| 969.7 | 0.012 |
| 969.8 | 0.012 |
| 969.9 | 0.012 |
| 970.0 | 0.011 |
| 970.1 | 0.011 |
| 970.2 | 0.01 |
| 970.3 | 0.011 |
| 970.4 | 0.011 |
| 970.5 | 0.012 |
| 970.6 | 0.012 |
| 970.7 | 0.011 |
| 970.8 | 0.011 |
| 970.9 | 0.01 |
| 971.0 | 0.011 |
| 971.1 | 0.012 |
| 971.2 | 0.011 |
| 971.3 | 0.011 |
| 971.4 | 0.011 |
| 971.5 | 0.011 |
| 971.6 | 0.011 |
| 971.7 | 0.01 |
| 971.8 | 0.01 |
| 971.9 | 0.009 |
| 972.0 | 0.01 |
| 972.1 | 0.01 |
| 972.2 | 0.009 |
| 972.3 | 0.008 |
| 972.4 | 0.008 |
| 972.5 | 0.009 |
| 972.6 | 0.009 |
| 972.7 | 0.009 |
| 972.8 | 0.008 |
| 972.9 | 0.008 |
| 973.0 | 0.008 |
| 973.1 | 0.009 |
| 973.2 | 0.009 |
| 973.3 | 0.008 |
| 973.4 | 0.008 |
| 973.5 | 0.008 |
| 973.6 | 0.007 |
| 973.7 | 0.007 |
| 973.8 | 0.007 |
| 973.9 | 0.007 |
| 974.0 | 0.007 |
| 974.1 | 0.008 |
| 974.2 | 0.007 |
| 974.3 | 0.007 |
| 974.4 | 0.007 |
| 974.5 | 0.008 |
| 974.6 | 0.007 |
| 974.7 | 0.007 |
| 974.8 | 0.007 |
| 974.9 | 0.007 |
| 975.0 | 0.007 |
| 975.1 | 0.007 |
| 975.2 | 0.007 |
| 975.3 | 0.007 |
| 975.4 | 0.006 |
| 975.5 | 0.006 |
| 975.6 | 0.007 |
| 975.7 | 0.007 |
| 975.8 | 0.007 |
| 975.9 | 0.007 |
| 976.0 | 0.007 |
| 976.1 | 0.007 |
| 976.2 | 0.007 |
| 976.3 | 0.007 |
| 976.4 | 0.007 |
| 976.5 | 0.007 |
| 976.6 | 0.007 |
| 976.7 | 0.007 |
| 976.8 | 0.007 |
| 976.9 | 0.007 |
| 977.0 | 0.007 |
| 977.1 | 0.007 |
| 977.2 | 0.007 |
| 977.3 | 0.006 |
| 977.4 | 0.005 |
| 977.5 | 0.005 |
| 977.6 | 0.005 |
| 977.7 | 0.005 |
| 977.8 | 0.006 |
| 977.9 | 0.006 |
| 978.0 | 0.006 |
| 978.1 | 0.006 |
| 978.2 | 0.007 |
| 978.3 | 0.008 |
| 978.4 | 0.008 |
| 978.5 | 0.007 |
| 978.6 | 0.007 |
| 978.7 | 0.007 |
| 978.8 | 0.007 |
| 978.9 | 0.008 |
| 979.0 | 0.008 |
| 979.1 | 0.008 |
| 979.2 | 0.008 |
| 979.3 | 0.008 |
| 979.4 | 0.009 |
| 979.5 | 0.009 |
| 979.6 | 0.008 |
| 979.7 | 0.008 |
| 979.8 | 0.008 |
| 979.9 | 0.009 |
| 980.0 | 0.01 |
| 980.1 | 0.01 |
| 980.2 | 0.009 |
| 980.3 | 0.009 |
| 980.4 | 0.009 |
| 980.5 | 0.009 |
| 980.6 | 0.009 |
| 980.7 | 0.009 |
| 980.8 | 0.009 |
| 980.9 | 0.009 |
| 981.0 | 0.009 |
| 981.1 | 0.01 |
| 981.2 | 0.009 |
| 981.3 | 0.009 |
| 981.4 | 0.01 |
| 981.5 | 0.01 |
| 981.6 | 0.01 |
| 981.7 | 0.01 |
| 981.8 | 0.01 |
| 981.9 | 0.01 |
| 982.0 | 0.009 |
| 982.1 | 0.009 |
| 982.2 | 0.008 |
| 982.3 | 0.008 |
| 982.4 | 0.008 |
| 982.5 | 0.008 |
| 982.6 | 0.007 |
| 982.7 | 0.007 |
| 982.8 | 0.007 |
| 982.9 | 0.008 |
| 983.0 | 0.008 |
| 983.1 | 0.008 |
| 983.2 | 0.008 |
| 983.3 | 0.008 |
| 983.4 | 0.008 |
| 983.5 | 0.008 |
| 983.6 | 0.007 |
| 983.7 | 0.007 |
| 983.8 | 0.007 |
| 983.9 | 0.008 |
| 984.0 | 0.008 |
| 984.1 | 0.007 |
| 984.2 | 0.007 |
| 984.3 | 0.007 |
| 984.4 | 0.007 |
| 984.5 | 0.007 |
| 984.6 | 0.006 |
| 984.7 | 0.006 |
| 984.8 | 0.005 |
| 984.9 | 0.005 |
| 985.0 | 0.005 |
| 985.1 | 0.005 |
| 985.2 | 0.005 |
| 985.3 | 0.004 |
| 985.4 | 0.004 |
| 985.5 | 0.004 |
| 985.6 | 0.004 |
| 985.7 | 0.004 |
| 985.8 | 0.004 |
| 985.9 | 0.004 |
| 986.0 | 0.004 |
| 986.1 | 0.004 |
| 986.2 | 0.004 |
| 986.3 | 0.004 |
| 986.4 | 0.005 |
| 986.5 | 0.004 |
| 986.6 | 0.004 |
| 986.7 | 0.003 |
| 986.8 | 0.004 |
| 986.9 | 0.004 |
| 987.0 | 0.003 |
| 987.1 | 0.003 |
| 987.2 | 0.003 |
| 987.3 | 0.003 |
| 987.4 | 0.003 |
| 987.5 | 0.003 |
| 987.6 | 0.003 |
| 987.7 | 0.003 |
| 987.8 | 0.003 |
| 987.9 | 0.003 |
| 988.0 | 0.003 |
| 988.1 | 0.003 |
| 988.2 | 0.003 |
| 988.3 | 0.003 |
| 988.4 | 0.004 |
| 988.5 | 0.004 |
| 988.6 | 0.004 |
| 988.7 | 0.004 |
| 988.8 | 0.004 |
| 988.9 | 0.004 |
| 989.0 | 0.003 |
| 989.1 | 0.003 |
| 989.2 | 0.002 |
| 989.3 | 0.003 |
| 989.4 | 0.003 |
| 989.5 | 0.003 |
| 989.6 | 0.003 |
| 989.7 | 0.003 |
| 989.8 | 0.003 |
| 989.9 | 0.003 |
| 990.0 | 0.003 |
| 990.1 | 0.003 |
| 990.2 | 0.003 |
| 990.3 | 0.003 |
| 990.4 | 0.004 |
| 990.5 | 0.004 |
| 990.6 | 0.004 |
| 990.7 | 0.004 |
| 990.8 | 0.003 |
| 990.9 | 0.003 |
| 991.0 | 0.003 |
| 991.1 | 0.003 |
| 991.2 | 0.003 |
| 991.3 | 0.004 |
| 991.4 | 0.003 |
| 991.5 | 0.003 |
| 991.6 | 0.003 |
| 991.7 | 0.003 |
| 991.8 | 0.004 |
| 991.9 | 0.003 |
| 992.0 | 0.003 |
| 992.1 | 0.003 |
| 992.2 | 0.003 |
| 992.3 | 0.003 |
| 992.4 | 0.003 |
| 992.5 | 0.003 |
| 992.6 | 0.004 |
| 992.7 | 0.004 |
| 992.8 | 0.004 |
| 992.9 | 0.004 |
| 993.0 | 0.004 |
| 993.1 | 0.005 |
| 993.2 | 0.004 |
| 993.3 | 0.004 |
| 993.4 | 0.004 |
| 993.5 | 0.003 |
| 993.6 | 0.003 |
| 993.7 | 0.003 |
| 993.8 | 0.002 |
| 993.9 | 0.002 |
| 994.0 | 0.003 |
| 994.1 | 0.004 |
| 994.2 | 0.004 |
| 994.3 | 0.004 |
| 994.4 | 0.003 |
| 994.5 | 0.003 |
| 994.6 | 0.003 |
| 994.7 | 0.003 |
| 994.8 | 0.004 |
| 994.9 | 0.003 |
| 995.0 | 0.004 |
| 995.1 | 0.003 |
| 995.2 | 0.003 |
| 995.3 | 0.004 |
| 995.4 | 0.004 |
| 995.5 | 0.004 |
| 995.6 | 0.004 |
| 995.7 | 0.004 |
| 995.8 | 0.004 |
| 995.9 | 0.004 |
| 996.0 | 0.005 |
| 996.1 | 0.005 |
| 996.2 | 0.005 |
| 996.3 | 0.004 |
| 996.4 | 0.005 |
| 996.5 | 0.005 |
| 996.6 | 0.005 |
| 996.7 | 0.006 |
| 996.8 | 0.005 |
| 996.9 | 0.005 |
| 997.0 | 0.005 |
| 997.1 | 0.005 |
| 997.2 | 0.005 |
| 997.3 | 0.005 |
| 997.4 | 0.005 |
| 997.5 | 0.005 |
| 997.6 | 0.005 |
| 997.7 | 0.006 |
| 997.8 | 0.006 |
| 997.9 | 0.007 |
| 998.0 | 0.007 |
| 998.1 | 0.007 |
| 998.2 | 0.007 |
| 998.3 | 0.007 |
| 998.4 | 0.007 |
| 998.5 | 0.008 |
| 998.6 | 0.009 |
| 998.7 | 0.008 |
| 998.8 | 0.008 |
| 998.9 | 0.008 |
| 999.0 | 0.009 |
| 999.1 | 0.009 |
| 999.2 | 0.01 |
| 999.3 | 0.011 |
| 999.4 | 0.011 |
| 999.5 | 0.011 |
| 999.6 | 0.011 |
| 999.7 | 0.011 |
| 999.8 | 0.011 |
| 999.9 | 0.011 |
| 1000.0 | 0.012 |